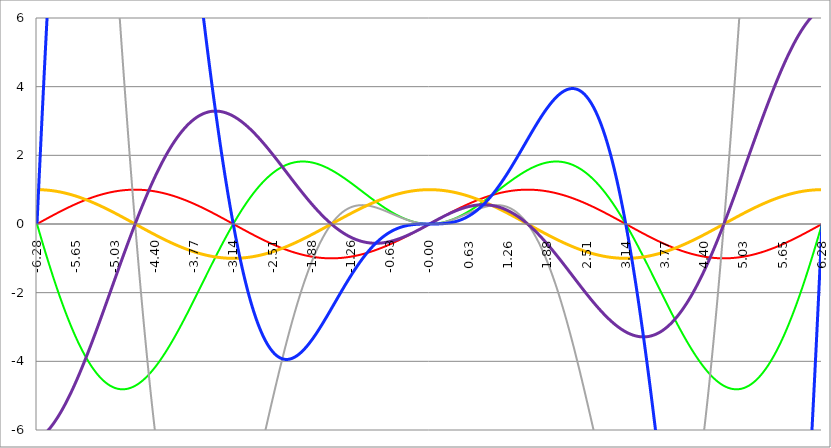
| Category | Series 1 | Series 0 | Series 2 | Series 3 | Series 4 | Series 5 |
|---|---|---|---|---|---|---|
| -6.283185307179586 | 0 | 0 | 39.478 | 1 | -6.283 | 0 |
| -6.276902121872407 | 0.006 | -0.039 | 39.399 | 1 | -6.277 | 0.248 |
| -6.270618936565228 | 0.013 | -0.079 | 39.318 | 1 | -6.27 | 0.494 |
| -6.264335751258049 | 0.019 | -0.118 | 39.235 | 1 | -6.263 | 0.74 |
| -6.25805256595087 | 0.025 | -0.157 | 39.151 | 1 | -6.256 | 0.984 |
| -6.25176938064369 | 0.031 | -0.196 | 39.065 | 1 | -6.249 | 1.228 |
| -6.245486195336511 | 0.038 | -0.235 | 38.978 | 0.999 | -6.241 | 1.47 |
| -6.23920301002933 | 0.044 | -0.274 | 38.89 | 0.999 | -6.233 | 1.712 |
| -6.232919824722153 | 0.05 | -0.313 | 38.8 | 0.999 | -6.225 | 1.952 |
| -6.226636639414973 | 0.057 | -0.352 | 38.709 | 0.998 | -6.217 | 2.191 |
| -6.220353454107794 | 0.063 | -0.391 | 38.616 | 0.998 | -6.208 | 2.43 |
| -6.214070268800615 | 0.069 | -0.429 | 38.522 | 0.998 | -6.199 | 2.667 |
| -6.207787083493435 | 0.075 | -0.468 | 38.427 | 0.997 | -6.19 | 2.903 |
| -6.201503898186257 | 0.082 | -0.506 | 38.33 | 0.997 | -6.181 | 3.138 |
| -6.195220712879077 | 0.088 | -0.544 | 38.232 | 0.996 | -6.171 | 3.372 |
| -6.188937527571898 | 0.094 | -0.582 | 38.133 | 0.996 | -6.161 | 3.605 |
| -6.182654342264719 | 0.1 | -0.621 | 38.032 | 0.995 | -6.151 | 3.836 |
| -6.17637115695754 | 0.107 | -0.658 | 37.93 | 0.994 | -6.141 | 4.067 |
| -6.170087971650361 | 0.113 | -0.696 | 37.827 | 0.994 | -6.131 | 4.296 |
| -6.163804786343182 | 0.119 | -0.734 | 37.722 | 0.993 | -6.12 | 4.525 |
| -6.157521601036002 | 0.125 | -0.772 | 37.616 | 0.992 | -6.109 | 4.752 |
| -6.151238415728823 | 0.132 | -0.809 | 37.509 | 0.991 | -6.098 | 4.978 |
| -6.144955230421644 | 0.138 | -0.847 | 37.4 | 0.99 | -6.086 | 5.203 |
| -6.138672045114464 | 0.144 | -0.884 | 37.29 | 0.99 | -6.075 | 5.427 |
| -6.132388859807286 | 0.15 | -0.921 | 37.179 | 0.989 | -6.063 | 5.649 |
| -6.126105674500106 | 0.156 | -0.958 | 37.067 | 0.988 | -6.051 | 5.871 |
| -6.119822489192927 | 0.163 | -0.995 | 36.954 | 0.987 | -6.038 | 6.091 |
| -6.113539303885748 | 0.169 | -1.032 | 36.839 | 0.986 | -6.026 | 6.31 |
| -6.107256118578569 | 0.175 | -1.069 | 36.723 | 0.985 | -6.013 | 6.528 |
| -6.10097293327139 | 0.181 | -1.106 | 36.606 | 0.983 | -6 | 6.745 |
| -6.09468974796421 | 0.187 | -1.142 | 36.487 | 0.982 | -5.987 | 6.96 |
| -6.088406562657031 | 0.194 | -1.178 | 36.368 | 0.981 | -5.973 | 7.175 |
| -6.082123377349852 | 0.2 | -1.215 | 36.247 | 0.98 | -5.96 | 7.388 |
| -6.075840192042672 | 0.206 | -1.251 | 36.125 | 0.979 | -5.946 | 7.6 |
| -6.069557006735494 | 0.212 | -1.287 | 36.002 | 0.977 | -5.932 | 7.81 |
| -6.063273821428314 | 0.218 | -1.323 | 35.878 | 0.976 | -5.917 | 8.02 |
| -6.056990636121135 | 0.224 | -1.358 | 35.753 | 0.975 | -5.903 | 8.228 |
| -6.050707450813956 | 0.23 | -1.394 | 35.626 | 0.973 | -5.888 | 8.435 |
| -6.044424265506777 | 0.236 | -1.43 | 35.499 | 0.972 | -5.873 | 8.641 |
| -6.038141080199597 | 0.243 | -1.465 | 35.37 | 0.97 | -5.858 | 8.845 |
| -6.031857894892418 | 0.249 | -1.5 | 35.24 | 0.969 | -5.842 | 9.048 |
| -6.025574709585239 | 0.255 | -1.535 | 35.109 | 0.967 | -5.827 | 9.25 |
| -6.01929152427806 | 0.261 | -1.57 | 34.978 | 0.965 | -5.811 | 9.451 |
| -6.013008338970881 | 0.267 | -1.605 | 34.845 | 0.964 | -5.795 | 9.65 |
| -6.006725153663701 | 0.273 | -1.64 | 34.711 | 0.962 | -5.779 | 9.848 |
| -6.000441968356522 | 0.279 | -1.674 | 34.576 | 0.96 | -5.762 | 10.045 |
| -5.994158783049343 | 0.285 | -1.708 | 34.44 | 0.959 | -5.746 | 10.241 |
| -5.987875597742164 | 0.291 | -1.743 | 34.303 | 0.957 | -5.729 | 10.435 |
| -5.981592412434984 | 0.297 | -1.777 | 34.165 | 0.955 | -5.712 | 10.628 |
| -5.975309227127805 | 0.303 | -1.811 | 34.025 | 0.953 | -5.694 | 10.82 |
| -5.969026041820626 | 0.309 | -1.845 | 33.885 | 0.951 | -5.677 | 11.01 |
| -5.962742856513447 | 0.315 | -1.878 | 33.744 | 0.949 | -5.659 | 11.199 |
| -5.956459671206268 | 0.321 | -1.912 | 33.602 | 0.947 | -5.641 | 11.387 |
| -5.950176485899088 | 0.327 | -1.945 | 33.46 | 0.945 | -5.623 | 11.573 |
| -5.94389330059191 | 0.333 | -1.978 | 33.316 | 0.943 | -5.605 | 11.758 |
| -5.93761011528473 | 0.339 | -2.011 | 33.171 | 0.941 | -5.587 | 11.942 |
| -5.931326929977551 | 0.345 | -2.044 | 33.025 | 0.939 | -5.568 | 12.125 |
| -5.925043744670372 | 0.351 | -2.077 | 32.879 | 0.937 | -5.549 | 12.306 |
| -5.918760559363193 | 0.356 | -2.11 | 32.731 | 0.934 | -5.53 | 12.486 |
| -5.912477374056014 | 0.362 | -2.142 | 32.583 | 0.932 | -5.511 | 12.664 |
| -5.906194188748834 | 0.368 | -2.174 | 32.434 | 0.93 | -5.491 | 12.841 |
| -5.899911003441655 | 0.374 | -2.206 | 32.283 | 0.927 | -5.472 | 13.017 |
| -5.893627818134476 | 0.38 | -2.238 | 32.132 | 0.925 | -5.452 | 13.192 |
| -5.887344632827297 | 0.386 | -2.27 | 31.981 | 0.923 | -5.432 | 13.365 |
| -5.881061447520117 | 0.391 | -2.302 | 31.828 | 0.92 | -5.412 | 13.536 |
| -5.874778262212938 | 0.397 | -2.333 | 31.674 | 0.918 | -5.392 | 13.707 |
| -5.868495076905759 | 0.403 | -2.364 | 31.52 | 0.915 | -5.371 | 13.876 |
| -5.86221189159858 | 0.409 | -2.396 | 31.365 | 0.913 | -5.35 | 14.043 |
| -5.855928706291401 | 0.414 | -2.427 | 31.209 | 0.91 | -5.33 | 14.21 |
| -5.849645520984221 | 0.42 | -2.457 | 31.053 | 0.907 | -5.308 | 14.375 |
| -5.843362335677042 | 0.426 | -2.488 | 30.895 | 0.905 | -5.287 | 14.538 |
| -5.837079150369863 | 0.431 | -2.518 | 30.737 | 0.902 | -5.266 | 14.7 |
| -5.830795965062684 | 0.437 | -2.549 | 30.578 | 0.899 | -5.244 | 14.861 |
| -5.824512779755505 | 0.443 | -2.579 | 30.419 | 0.897 | -5.222 | 15.021 |
| -5.818229594448325 | 0.448 | -2.609 | 30.258 | 0.894 | -5.201 | 15.179 |
| -5.811946409141146 | 0.454 | -2.639 | 30.097 | 0.891 | -5.178 | 15.335 |
| -5.805663223833967 | 0.46 | -2.668 | 29.935 | 0.888 | -5.156 | 15.49 |
| -5.799380038526788 | 0.465 | -2.698 | 29.773 | 0.885 | -5.134 | 15.644 |
| -5.793096853219609 | 0.471 | -2.727 | 29.61 | 0.882 | -5.111 | 15.797 |
| -5.78681366791243 | 0.476 | -2.756 | 29.446 | 0.879 | -5.088 | 15.948 |
| -5.780530482605251 | 0.482 | -2.785 | 29.281 | 0.876 | -5.066 | 16.098 |
| -5.774247297298071 | 0.487 | -2.814 | 29.116 | 0.873 | -5.042 | 16.246 |
| -5.767964111990892 | 0.493 | -2.842 | 28.951 | 0.87 | -5.019 | 16.393 |
| -5.761680926683713 | 0.498 | -2.87 | 28.784 | 0.867 | -4.996 | 16.538 |
| -5.755397741376534 | 0.504 | -2.899 | 28.617 | 0.864 | -4.972 | 16.682 |
| -5.749114556069355 | 0.509 | -2.927 | 28.45 | 0.861 | -4.949 | 16.825 |
| -5.742831370762175 | 0.514 | -2.954 | 28.281 | 0.858 | -4.925 | 16.966 |
| -5.736548185454996 | 0.52 | -2.982 | 28.113 | 0.854 | -4.901 | 17.106 |
| -5.730265000147816 | 0.525 | -3.009 | 27.943 | 0.851 | -4.876 | 17.245 |
| -5.723981814840638 | 0.531 | -3.037 | 27.773 | 0.848 | -4.852 | 17.382 |
| -5.717698629533459 | 0.536 | -3.064 | 27.603 | 0.844 | -4.828 | 17.517 |
| -5.711415444226279 | 0.541 | -3.091 | 27.432 | 0.841 | -4.803 | 17.652 |
| -5.7051322589191 | 0.546 | -3.117 | 27.26 | 0.838 | -4.778 | 17.784 |
| -5.698849073611921 | 0.552 | -3.144 | 27.088 | 0.834 | -4.753 | 17.916 |
| -5.692565888304742 | 0.557 | -3.17 | 26.916 | 0.831 | -4.728 | 18.046 |
| -5.686282702997562 | 0.562 | -3.196 | 26.743 | 0.827 | -4.703 | 18.174 |
| -5.679999517690383 | 0.567 | -3.222 | 26.569 | 0.824 | -4.678 | 18.301 |
| -5.673716332383204 | 0.572 | -3.248 | 26.395 | 0.82 | -4.652 | 18.427 |
| -5.667433147076025 | 0.578 | -3.273 | 26.221 | 0.816 | -4.627 | 18.552 |
| -5.661149961768846 | 0.583 | -3.299 | 26.046 | 0.813 | -4.601 | 18.674 |
| -5.654866776461667 | 0.588 | -3.324 | 25.87 | 0.809 | -4.575 | 18.796 |
| -5.648583591154487 | 0.593 | -3.349 | 25.695 | 0.805 | -4.549 | 18.916 |
| -5.642300405847308 | 0.598 | -3.374 | 25.518 | 0.802 | -4.523 | 19.035 |
| -5.63601722054013 | 0.603 | -3.398 | 25.342 | 0.798 | -4.496 | 19.152 |
| -5.62973403523295 | 0.608 | -3.422 | 25.165 | 0.794 | -4.47 | 19.268 |
| -5.623450849925771 | 0.613 | -3.447 | 24.987 | 0.79 | -4.443 | 19.382 |
| -5.617167664618591 | 0.618 | -3.471 | 24.809 | 0.786 | -4.417 | 19.495 |
| -5.610884479311412 | 0.623 | -3.494 | 24.631 | 0.782 | -4.39 | 19.607 |
| -5.604601294004233 | 0.628 | -3.518 | 24.453 | 0.778 | -4.363 | 19.717 |
| -5.598318108697054 | 0.633 | -3.541 | 24.274 | 0.775 | -4.336 | 19.825 |
| -5.592034923389875 | 0.637 | -3.564 | 24.095 | 0.771 | -4.309 | 19.933 |
| -5.585751738082695 | 0.642 | -3.587 | 23.915 | 0.766 | -4.281 | 20.039 |
| -5.579468552775516 | 0.647 | -3.61 | 23.735 | 0.762 | -4.254 | 20.143 |
| -5.573185367468337 | 0.652 | -3.633 | 23.555 | 0.758 | -4.226 | 20.246 |
| -5.566902182161157 | 0.657 | -3.655 | 23.375 | 0.754 | -4.199 | 20.348 |
| -5.560618996853979 | 0.661 | -3.677 | 23.194 | 0.75 | -4.171 | 20.448 |
| -5.5543358115468 | 0.666 | -3.699 | 23.013 | 0.746 | -4.143 | 20.547 |
| -5.54805262623962 | 0.671 | -3.721 | 22.831 | 0.742 | -4.115 | 20.644 |
| -5.54176944093244 | 0.675 | -3.743 | 22.65 | 0.738 | -4.087 | 20.74 |
| -5.535486255625262 | 0.68 | -3.764 | 22.468 | 0.733 | -4.059 | 20.835 |
| -5.529203070318083 | 0.685 | -3.785 | 22.286 | 0.729 | -4.031 | 20.928 |
| -5.522919885010904 | 0.689 | -3.806 | 22.104 | 0.725 | -4.002 | 21.02 |
| -5.516636699703724 | 0.694 | -3.827 | 21.921 | 0.72 | -3.974 | 21.11 |
| -5.510353514396545 | 0.698 | -3.847 | 21.739 | 0.716 | -3.945 | 21.199 |
| -5.504070329089366 | 0.703 | -3.867 | 21.556 | 0.712 | -3.916 | 21.287 |
| -5.497787143782186 | 0.707 | -3.888 | 21.373 | 0.707 | -3.888 | 21.373 |
| -5.491503958475008 | 0.712 | -3.907 | 21.19 | 0.703 | -3.859 | 21.458 |
| -5.485220773167828 | 0.716 | -3.927 | 21.006 | 0.698 | -3.83 | 21.541 |
| -5.47893758786065 | 0.72 | -3.947 | 20.823 | 0.694 | -3.8 | 21.623 |
| -5.47265440255347 | 0.725 | -3.966 | 20.639 | 0.689 | -3.771 | 21.703 |
| -5.466371217246291 | 0.729 | -3.985 | 20.455 | 0.685 | -3.742 | 21.782 |
| -5.460088031939112 | 0.733 | -4.004 | 20.271 | 0.68 | -3.713 | 21.86 |
| -5.453804846631932 | 0.738 | -4.022 | 20.087 | 0.675 | -3.683 | 21.937 |
| -5.447521661324753 | 0.742 | -4.041 | 19.903 | 0.671 | -3.654 | 22.012 |
| -5.441238476017574 | 0.746 | -4.059 | 19.719 | 0.666 | -3.624 | 22.085 |
| -5.434955290710395 | 0.75 | -4.077 | 19.534 | 0.661 | -3.594 | 22.157 |
| -5.428672105403215 | 0.754 | -4.095 | 19.35 | 0.657 | -3.564 | 22.228 |
| -5.422388920096036 | 0.758 | -4.112 | 19.165 | 0.652 | -3.534 | 22.298 |
| -5.416105734788857 | 0.762 | -4.129 | 18.981 | 0.647 | -3.505 | 22.366 |
| -5.409822549481678 | 0.766 | -4.147 | 18.796 | 0.642 | -3.474 | 22.432 |
| -5.403539364174499 | 0.771 | -4.163 | 18.612 | 0.637 | -3.444 | 22.498 |
| -5.39725617886732 | 0.775 | -4.18 | 18.427 | 0.633 | -3.414 | 22.562 |
| -5.39097299356014 | 0.778 | -4.197 | 18.242 | 0.628 | -3.384 | 22.624 |
| -5.384689808252961 | 0.782 | -4.213 | 18.058 | 0.623 | -3.354 | 22.685 |
| -5.378406622945782 | 0.786 | -4.229 | 17.873 | 0.618 | -3.323 | 22.745 |
| -5.372123437638603 | 0.79 | -4.245 | 17.688 | 0.613 | -3.293 | 22.804 |
| -5.365840252331424 | 0.794 | -4.26 | 17.504 | 0.608 | -3.262 | 22.861 |
| -5.359557067024244 | 0.798 | -4.276 | 17.319 | 0.603 | -3.231 | 22.917 |
| -5.353273881717065 | 0.802 | -4.291 | 17.134 | 0.598 | -3.201 | 22.971 |
| -5.346990696409886 | 0.805 | -4.306 | 16.95 | 0.593 | -3.17 | 23.024 |
| -5.340707511102707 | 0.809 | -4.321 | 16.765 | 0.588 | -3.139 | 23.076 |
| -5.334424325795528 | 0.813 | -4.335 | 16.581 | 0.583 | -3.108 | 23.126 |
| -5.328141140488348 | 0.816 | -4.35 | 16.397 | 0.578 | -3.077 | 23.175 |
| -5.32185795518117 | 0.82 | -4.364 | 16.213 | 0.572 | -3.046 | 23.223 |
| -5.31557476987399 | 0.824 | -4.378 | 16.028 | 0.567 | -3.015 | 23.269 |
| -5.30929158456681 | 0.827 | -4.391 | 15.844 | 0.562 | -2.984 | 23.314 |
| -5.303008399259631 | 0.831 | -4.405 | 15.66 | 0.557 | -2.953 | 23.358 |
| -5.296725213952453 | 0.834 | -4.418 | 15.477 | 0.552 | -2.922 | 23.4 |
| -5.290442028645273 | 0.838 | -4.431 | 15.293 | 0.546 | -2.891 | 23.441 |
| -5.284158843338094 | 0.841 | -4.444 | 15.109 | 0.541 | -2.859 | 23.481 |
| -5.277875658030915 | 0.844 | -4.456 | 14.926 | 0.536 | -2.828 | 23.52 |
| -5.271592472723735 | 0.848 | -4.469 | 14.743 | 0.531 | -2.797 | 23.557 |
| -5.265309287416557 | 0.851 | -4.481 | 14.56 | 0.525 | -2.765 | 23.593 |
| -5.259026102109377 | 0.854 | -4.493 | 14.377 | 0.52 | -2.734 | 23.627 |
| -5.252742916802198 | 0.858 | -4.504 | 14.194 | 0.514 | -2.702 | 23.66 |
| -5.246459731495019 | 0.861 | -4.516 | 14.012 | 0.509 | -2.671 | 23.692 |
| -5.24017654618784 | 0.864 | -4.527 | 13.829 | 0.504 | -2.639 | 23.723 |
| -5.23389336088066 | 0.867 | -4.538 | 13.647 | 0.498 | -2.607 | 23.752 |
| -5.227610175573481 | 0.87 | -4.549 | 13.465 | 0.493 | -2.576 | 23.78 |
| -5.221326990266302 | 0.873 | -4.56 | 13.284 | 0.487 | -2.544 | 23.807 |
| -5.215043804959122 | 0.876 | -4.57 | 13.102 | 0.482 | -2.512 | 23.833 |
| -5.208760619651944 | 0.879 | -4.58 | 12.921 | 0.476 | -2.481 | 23.857 |
| -5.202477434344764 | 0.882 | -4.59 | 12.74 | 0.471 | -2.449 | 23.88 |
| -5.196194249037585 | 0.885 | -4.6 | 12.559 | 0.465 | -2.417 | 23.902 |
| -5.189911063730406 | 0.888 | -4.609 | 12.379 | 0.46 | -2.385 | 23.922 |
| -5.183627878423227 | 0.891 | -4.619 | 12.199 | 0.454 | -2.353 | 23.941 |
| -5.177344693116048 | 0.894 | -4.628 | 12.019 | 0.448 | -2.321 | 23.959 |
| -5.171061507808868 | 0.897 | -4.637 | 11.839 | 0.443 | -2.29 | 23.976 |
| -5.164778322501689 | 0.899 | -4.645 | 11.66 | 0.437 | -2.258 | 23.992 |
| -5.15849513719451 | 0.902 | -4.654 | 11.481 | 0.431 | -2.226 | 24.006 |
| -5.152211951887331 | 0.905 | -4.662 | 11.302 | 0.426 | -2.194 | 24.019 |
| -5.145928766580152 | 0.907 | -4.67 | 11.124 | 0.42 | -2.162 | 24.031 |
| -5.139645581272972 | 0.91 | -4.678 | 10.946 | 0.414 | -2.13 | 24.041 |
| -5.133362395965793 | 0.913 | -4.685 | 10.768 | 0.409 | -2.098 | 24.051 |
| -5.127079210658614 | 0.915 | -4.693 | 10.591 | 0.403 | -2.066 | 24.059 |
| -5.120796025351435 | 0.918 | -4.7 | 10.414 | 0.397 | -2.034 | 24.066 |
| -5.114512840044256 | 0.92 | -4.707 | 10.238 | 0.391 | -2.002 | 24.072 |
| -5.108229654737076 | 0.923 | -4.713 | 10.061 | 0.386 | -1.97 | 24.076 |
| -5.101946469429897 | 0.925 | -4.72 | 9.886 | 0.38 | -1.938 | 24.08 |
| -5.095663284122718 | 0.927 | -4.726 | 9.71 | 0.374 | -1.906 | 24.082 |
| -5.08938009881554 | 0.93 | -4.732 | 9.535 | 0.368 | -1.874 | 24.083 |
| -5.08309691350836 | 0.932 | -4.738 | 9.36 | 0.362 | -1.841 | 24.083 |
| -5.07681372820118 | 0.934 | -4.743 | 9.186 | 0.356 | -1.809 | 24.081 |
| -5.070530542894002 | 0.937 | -4.749 | 9.012 | 0.351 | -1.777 | 24.079 |
| -5.064247357586822 | 0.939 | -4.754 | 8.839 | 0.345 | -1.745 | 24.075 |
| -5.057964172279643 | 0.941 | -4.759 | 8.666 | 0.339 | -1.713 | 24.071 |
| -5.051680986972464 | 0.943 | -4.764 | 8.493 | 0.333 | -1.681 | 24.065 |
| -5.045397801665285 | 0.945 | -4.768 | 8.321 | 0.327 | -1.649 | 24.058 |
| -5.039114616358106 | 0.947 | -4.773 | 8.15 | 0.321 | -1.617 | 24.049 |
| -5.032831431050926 | 0.949 | -4.777 | 7.978 | 0.315 | -1.585 | 24.04 |
| -5.026548245743747 | 0.951 | -4.781 | 7.808 | 0.309 | -1.553 | 24.03 |
| -5.020265060436568 | 0.953 | -4.784 | 7.637 | 0.303 | -1.521 | 24.018 |
| -5.013981875129389 | 0.955 | -4.788 | 7.468 | 0.297 | -1.489 | 24.005 |
| -5.00769868982221 | 0.957 | -4.791 | 7.298 | 0.291 | -1.457 | 23.992 |
| -5.00141550451503 | 0.959 | -4.794 | 7.13 | 0.285 | -1.425 | 23.977 |
| -4.995132319207851 | 0.96 | -4.797 | 6.961 | 0.279 | -1.394 | 23.961 |
| -4.98884913390067 | 0.962 | -4.799 | 6.793 | 0.273 | -1.362 | 23.944 |
| -4.982565948593493 | 0.964 | -4.802 | 6.626 | 0.267 | -1.33 | 23.925 |
| -4.976282763286313 | 0.965 | -4.804 | 6.459 | 0.261 | -1.298 | 23.906 |
| -4.969999577979134 | 0.967 | -4.806 | 6.293 | 0.255 | -1.266 | 23.886 |
| -4.963716392671955 | 0.969 | -4.808 | 6.127 | 0.249 | -1.234 | 23.864 |
| -4.957433207364776 | 0.97 | -4.809 | 5.962 | 0.243 | -1.203 | 23.842 |
| -4.951150022057597 | 0.972 | -4.811 | 5.798 | 0.236 | -1.171 | 23.818 |
| -4.944866836750418 | 0.973 | -4.812 | 5.633 | 0.23 | -1.139 | 23.794 |
| -4.938583651443238 | 0.975 | -4.813 | 5.47 | 0.224 | -1.108 | 23.768 |
| -4.932300466136059 | 0.976 | -4.814 | 5.307 | 0.218 | -1.076 | 23.742 |
| -4.92601728082888 | 0.977 | -4.814 | 5.144 | 0.212 | -1.044 | 23.714 |
| -4.9197340955217 | 0.979 | -4.814 | 4.983 | 0.206 | -1.013 | 23.685 |
| -4.913450910214521 | 0.98 | -4.814 | 4.821 | 0.2 | -0.981 | 23.656 |
| -4.907167724907342 | 0.981 | -4.814 | 4.661 | 0.194 | -0.95 | 23.625 |
| -4.900884539600163 | 0.982 | -4.814 | 4.501 | 0.187 | -0.918 | 23.593 |
| -4.894601354292984 | 0.983 | -4.814 | 4.341 | 0.181 | -0.887 | 23.561 |
| -4.888318168985805 | 0.985 | -4.813 | 4.182 | 0.175 | -0.856 | 23.527 |
| -4.882034983678625 | 0.986 | -4.812 | 4.024 | 0.169 | -0.824 | 23.492 |
| -4.875751798371446 | 0.987 | -4.811 | 3.866 | 0.163 | -0.793 | 23.456 |
| -4.869468613064267 | 0.988 | -4.81 | 3.709 | 0.156 | -0.762 | 23.42 |
| -4.863185427757088 | 0.989 | -4.808 | 3.553 | 0.15 | -0.731 | 23.382 |
| -4.856902242449909 | 0.99 | -4.806 | 3.397 | 0.144 | -0.699 | 23.344 |
| -4.85061905714273 | 0.99 | -4.804 | 3.242 | 0.138 | -0.668 | 23.304 |
| -4.84433587183555 | 0.991 | -4.802 | 3.087 | 0.132 | -0.637 | 23.264 |
| -4.838052686528371 | 0.992 | -4.8 | 2.934 | 0.125 | -0.606 | 23.222 |
| -4.831769501221192 | 0.993 | -4.797 | 2.78 | 0.119 | -0.575 | 23.18 |
| -4.825486315914013 | 0.994 | -4.795 | 2.628 | 0.113 | -0.545 | 23.137 |
| -4.819203130606833 | 0.994 | -4.792 | 2.476 | 0.107 | -0.514 | 23.092 |
| -4.812919945299654 | 0.995 | -4.789 | 2.325 | 0.1 | -0.483 | 23.047 |
| -4.806636759992475 | 0.996 | -4.785 | 2.174 | 0.094 | -0.452 | 23.001 |
| -4.800353574685296 | 0.996 | -4.782 | 2.024 | 0.088 | -0.422 | 22.954 |
| -4.794070389378117 | 0.997 | -4.778 | 1.875 | 0.082 | -0.391 | 22.906 |
| -4.787787204070938 | 0.997 | -4.774 | 1.727 | 0.075 | -0.361 | 22.858 |
| -4.781504018763758 | 0.998 | -4.77 | 1.579 | 0.069 | -0.33 | 22.808 |
| -4.77522083345658 | 0.998 | -4.766 | 1.432 | 0.063 | -0.3 | 22.758 |
| -4.7689376481494 | 0.998 | -4.761 | 1.285 | 0.057 | -0.27 | 22.706 |
| -4.762654462842221 | 0.999 | -4.757 | 1.14 | 0.05 | -0.239 | 22.654 |
| -4.756371277535042 | 0.999 | -4.752 | 0.995 | 0.044 | -0.209 | 22.601 |
| -4.750088092227862 | 0.999 | -4.747 | 0.85 | 0.038 | -0.179 | 22.547 |
| -4.743804906920683 | 1 | -4.741 | 0.707 | 0.031 | -0.149 | 22.493 |
| -4.737521721613504 | 1 | -4.736 | 0.564 | 0.025 | -0.119 | 22.437 |
| -4.731238536306324 | 1 | -4.73 | 0.422 | 0.019 | -0.089 | 22.381 |
| -4.724955350999146 | 1 | -4.725 | 0.281 | 0.013 | -0.059 | 22.323 |
| -4.718672165691966 | 1 | -4.719 | 0.14 | 0.006 | -0.03 | 22.265 |
| -4.712388980384787 | 1 | -4.712 | 0 | 0 | 0 | 22.207 |
| -4.706105795077608 | 1 | -4.706 | -0.139 | -0.006 | 0.03 | 22.147 |
| -4.699822609770429 | 1 | -4.699 | -0.278 | -0.013 | 0.059 | 22.087 |
| -4.69353942446325 | 1 | -4.693 | -0.415 | -0.019 | 0.088 | 22.025 |
| -4.68725623915607 | 1 | -4.686 | -0.552 | -0.025 | 0.118 | 21.963 |
| -4.680973053848891 | 1 | -4.679 | -0.688 | -0.031 | 0.147 | 21.901 |
| -4.674689868541712 | 0.999 | -4.671 | -0.824 | -0.038 | 0.176 | 21.837 |
| -4.668406683234533 | 0.999 | -4.664 | -0.958 | -0.044 | 0.205 | 21.773 |
| -4.662123497927354 | 0.999 | -4.656 | -1.092 | -0.05 | 0.234 | 21.708 |
| -4.655840312620174 | 0.998 | -4.648 | -1.225 | -0.057 | 0.263 | 21.642 |
| -4.649557127312995 | 0.998 | -4.64 | -1.357 | -0.063 | 0.292 | 21.576 |
| -4.643273942005816 | 0.998 | -4.632 | -1.489 | -0.069 | 0.321 | 21.509 |
| -4.636990756698637 | 0.997 | -4.624 | -1.62 | -0.075 | 0.349 | 21.441 |
| -4.630707571391458 | 0.997 | -4.615 | -1.75 | -0.082 | 0.378 | 21.372 |
| -4.624424386084279 | 0.996 | -4.607 | -1.879 | -0.088 | 0.406 | 21.303 |
| -4.618141200777099 | 0.996 | -4.598 | -2.007 | -0.094 | 0.435 | 21.233 |
| -4.61185801546992 | 0.995 | -4.589 | -2.135 | -0.1 | 0.463 | 21.162 |
| -4.605574830162741 | 0.994 | -4.579 | -2.261 | -0.107 | 0.491 | 21.09 |
| -4.599291644855561 | 0.994 | -4.57 | -2.387 | -0.113 | 0.519 | 21.018 |
| -4.593008459548383 | 0.993 | -4.56 | -2.512 | -0.119 | 0.547 | 20.946 |
| -4.586725274241203 | 0.992 | -4.551 | -2.637 | -0.125 | 0.575 | 20.872 |
| -4.580442088934024 | 0.991 | -4.541 | -2.76 | -0.132 | 0.603 | 20.798 |
| -4.574158903626845 | 0.99 | -4.531 | -2.883 | -0.138 | 0.63 | 20.723 |
| -4.567875718319666 | 0.99 | -4.52 | -3.005 | -0.144 | 0.658 | 20.648 |
| -4.561592533012487 | 0.989 | -4.51 | -3.126 | -0.15 | 0.685 | 20.572 |
| -4.555309347705307 | 0.988 | -4.499 | -3.246 | -0.156 | 0.713 | 20.495 |
| -4.549026162398128 | 0.987 | -4.488 | -3.366 | -0.163 | 0.74 | 20.418 |
| -4.542742977090949 | 0.986 | -4.478 | -3.484 | -0.169 | 0.767 | 20.34 |
| -4.53645979178377 | 0.985 | -4.466 | -3.602 | -0.175 | 0.794 | 20.262 |
| -4.530176606476591 | 0.983 | -4.455 | -3.719 | -0.181 | 0.821 | 20.183 |
| -4.523893421169412 | 0.982 | -4.444 | -3.835 | -0.187 | 0.848 | 20.103 |
| -4.517610235862232 | 0.981 | -4.432 | -3.95 | -0.194 | 0.874 | 20.023 |
| -4.511327050555053 | 0.98 | -4.42 | -4.065 | -0.2 | 0.901 | 19.942 |
| -4.505043865247874 | 0.979 | -4.409 | -4.178 | -0.206 | 0.927 | 19.861 |
| -4.498760679940694 | 0.977 | -4.396 | -4.291 | -0.212 | 0.954 | 19.779 |
| -4.492477494633515 | 0.976 | -4.384 | -4.403 | -0.218 | 0.98 | 19.696 |
| -4.486194309326336 | 0.975 | -4.372 | -4.514 | -0.224 | 1.006 | 19.613 |
| -4.479911124019157 | 0.973 | -4.359 | -4.624 | -0.23 | 1.032 | 19.53 |
| -4.473627938711977 | 0.972 | -4.347 | -4.733 | -0.236 | 1.058 | 19.446 |
| -4.467344753404799 | 0.97 | -4.334 | -4.842 | -0.243 | 1.084 | 19.361 |
| -4.46106156809762 | 0.969 | -4.321 | -4.949 | -0.249 | 1.109 | 19.276 |
| -4.45477838279044 | 0.967 | -4.308 | -5.056 | -0.255 | 1.135 | 19.19 |
| -4.44849519748326 | 0.965 | -4.294 | -5.162 | -0.261 | 1.16 | 19.104 |
| -4.442212012176082 | 0.964 | -4.281 | -5.267 | -0.267 | 1.186 | 19.017 |
| -4.435928826868903 | 0.962 | -4.267 | -5.371 | -0.273 | 1.211 | 18.93 |
| -4.429645641561723 | 0.96 | -4.254 | -5.474 | -0.279 | 1.236 | 18.843 |
| -4.423362456254544 | 0.959 | -4.24 | -5.577 | -0.285 | 1.261 | 18.755 |
| -4.417079270947365 | 0.957 | -4.226 | -5.678 | -0.291 | 1.286 | 18.666 |
| -4.410796085640185 | 0.955 | -4.212 | -5.779 | -0.297 | 1.31 | 18.577 |
| -4.404512900333007 | 0.953 | -4.197 | -5.879 | -0.303 | 1.335 | 18.488 |
| -4.398229715025827 | 0.951 | -4.183 | -5.978 | -0.309 | 1.359 | 18.398 |
| -4.391946529718648 | 0.949 | -4.168 | -6.076 | -0.315 | 1.383 | 18.307 |
| -4.38566334441147 | 0.947 | -4.154 | -6.173 | -0.321 | 1.408 | 18.217 |
| -4.37938015910429 | 0.945 | -4.139 | -6.269 | -0.327 | 1.432 | 18.125 |
| -4.373096973797111 | 0.943 | -4.124 | -6.365 | -0.333 | 1.455 | 18.034 |
| -4.366813788489932 | 0.941 | -4.109 | -6.459 | -0.339 | 1.479 | 17.942 |
| -4.360530603182752 | 0.939 | -4.093 | -6.553 | -0.345 | 1.503 | 17.849 |
| -4.354247417875573 | 0.937 | -4.078 | -6.646 | -0.351 | 1.526 | 17.756 |
| -4.347964232568394 | 0.934 | -4.062 | -6.738 | -0.356 | 1.55 | 17.663 |
| -4.341681047261215 | 0.932 | -4.047 | -6.829 | -0.362 | 1.573 | 17.57 |
| -4.335397861954035 | 0.93 | -4.031 | -6.919 | -0.368 | 1.596 | 17.476 |
| -4.329114676646856 | 0.927 | -4.015 | -7.008 | -0.374 | 1.619 | 17.381 |
| -4.322831491339677 | 0.925 | -3.999 | -7.097 | -0.38 | 1.642 | 17.287 |
| -4.316548306032498 | 0.923 | -3.983 | -7.184 | -0.386 | 1.664 | 17.192 |
| -4.310265120725319 | 0.92 | -3.966 | -7.271 | -0.391 | 1.687 | 17.096 |
| -4.30398193541814 | 0.918 | -3.95 | -7.357 | -0.397 | 1.709 | 17.001 |
| -4.29769875011096 | 0.915 | -3.933 | -7.442 | -0.403 | 1.732 | 16.905 |
| -4.291415564803781 | 0.913 | -3.917 | -7.526 | -0.409 | 1.754 | 16.808 |
| -4.285132379496602 | 0.91 | -3.9 | -7.609 | -0.414 | 1.776 | 16.712 |
| -4.278849194189422 | 0.907 | -3.883 | -7.691 | -0.42 | 1.797 | 16.615 |
| -4.272566008882244 | 0.905 | -3.866 | -7.773 | -0.426 | 1.819 | 16.517 |
| -4.266282823575064 | 0.902 | -3.849 | -7.853 | -0.431 | 1.841 | 16.42 |
| -4.259999638267885 | 0.899 | -3.831 | -7.933 | -0.437 | 1.862 | 16.322 |
| -4.253716452960706 | 0.897 | -3.814 | -8.011 | -0.443 | 1.883 | 16.224 |
| -4.247433267653527 | 0.894 | -3.797 | -8.089 | -0.448 | 1.904 | 16.126 |
| -4.241150082346347 | 0.891 | -3.779 | -8.166 | -0.454 | 1.925 | 16.027 |
| -4.234866897039168 | 0.888 | -3.761 | -8.242 | -0.46 | 1.946 | 15.928 |
| -4.228583711731989 | 0.885 | -3.743 | -8.317 | -0.465 | 1.967 | 15.829 |
| -4.22230052642481 | 0.882 | -3.725 | -8.392 | -0.471 | 1.987 | 15.729 |
| -4.216017341117631 | 0.879 | -3.707 | -8.465 | -0.476 | 2.008 | 15.63 |
| -4.209734155810452 | 0.876 | -3.689 | -8.538 | -0.482 | 2.028 | 15.53 |
| -4.203450970503273 | 0.873 | -3.671 | -8.609 | -0.487 | 2.048 | 15.43 |
| -4.197167785196093 | 0.87 | -3.652 | -8.68 | -0.493 | 2.068 | 15.329 |
| -4.190884599888914 | 0.867 | -3.634 | -8.75 | -0.498 | 2.088 | 15.229 |
| -4.184601414581734 | 0.864 | -3.615 | -8.819 | -0.504 | 2.107 | 15.128 |
| -4.178318229274556 | 0.861 | -3.596 | -8.887 | -0.509 | 2.127 | 15.027 |
| -4.172035043967377 | 0.858 | -3.578 | -8.954 | -0.514 | 2.146 | 14.926 |
| -4.165751858660197 | 0.854 | -3.559 | -9.021 | -0.52 | 2.165 | 14.825 |
| -4.159468673353018 | 0.851 | -3.54 | -9.086 | -0.525 | 2.184 | 14.723 |
| -4.153185488045839 | 0.848 | -3.521 | -9.151 | -0.531 | 2.203 | 14.622 |
| -4.14690230273866 | 0.844 | -3.501 | -9.215 | -0.536 | 2.222 | 14.52 |
| -4.140619117431481 | 0.841 | -3.482 | -9.277 | -0.541 | 2.241 | 14.418 |
| -4.134335932124301 | 0.838 | -3.463 | -9.339 | -0.546 | 2.259 | 14.316 |
| -4.128052746817122 | 0.834 | -3.443 | -9.4 | -0.552 | 2.277 | 14.213 |
| -4.121769561509943 | 0.831 | -3.424 | -9.461 | -0.557 | 2.295 | 14.111 |
| -4.115486376202764 | 0.827 | -3.404 | -9.52 | -0.562 | 2.313 | 14.008 |
| -4.109203190895584 | 0.824 | -3.384 | -9.579 | -0.567 | 2.331 | 13.906 |
| -4.102920005588405 | 0.82 | -3.364 | -9.636 | -0.572 | 2.349 | 13.803 |
| -4.096636820281226 | 0.816 | -3.344 | -9.693 | -0.578 | 2.366 | 13.7 |
| -4.090353634974047 | 0.813 | -3.324 | -9.749 | -0.583 | 2.383 | 13.597 |
| -4.084070449666868 | 0.809 | -3.304 | -9.804 | -0.588 | 2.401 | 13.494 |
| -4.077787264359689 | 0.805 | -3.284 | -9.858 | -0.593 | 2.418 | 13.391 |
| -4.071504079052509 | 0.802 | -3.264 | -9.912 | -0.598 | 2.434 | 13.288 |
| -4.06522089374533 | 0.798 | -3.243 | -9.964 | -0.603 | 2.451 | 13.184 |
| -4.058937708438151 | 0.794 | -3.223 | -10.016 | -0.608 | 2.468 | 13.081 |
| -4.052654523130972 | 0.79 | -3.202 | -10.066 | -0.613 | 2.484 | 12.978 |
| -4.046371337823793 | 0.786 | -3.182 | -10.116 | -0.618 | 2.5 | 12.874 |
| -4.040088152516613 | 0.782 | -3.161 | -10.165 | -0.623 | 2.516 | 12.77 |
| -4.033804967209434 | 0.778 | -3.14 | -10.214 | -0.628 | 2.532 | 12.667 |
| -4.027521781902255 | 0.775 | -3.119 | -10.261 | -0.633 | 2.548 | 12.563 |
| -4.021238596595076 | 0.771 | -3.098 | -10.307 | -0.637 | 2.563 | 12.459 |
| -4.014955411287897 | 0.766 | -3.077 | -10.353 | -0.642 | 2.579 | 12.356 |
| -4.008672225980717 | 0.762 | -3.056 | -10.398 | -0.647 | 2.594 | 12.252 |
| -4.002389040673538 | 0.758 | -3.035 | -10.442 | -0.652 | 2.609 | 12.148 |
| -3.996105855366359 | 0.754 | -3.014 | -10.485 | -0.657 | 2.624 | 12.045 |
| -3.989822670059179 | 0.75 | -2.993 | -10.527 | -0.661 | 2.639 | 11.941 |
| -3.983539484752 | 0.746 | -2.971 | -10.569 | -0.666 | 2.653 | 11.837 |
| -3.97725629944482 | 0.742 | -2.95 | -10.609 | -0.671 | 2.667 | 11.733 |
| -3.97097311413764 | 0.738 | -2.929 | -10.649 | -0.675 | 2.682 | 11.63 |
| -3.96468992883046 | 0.733 | -2.907 | -10.688 | -0.68 | 2.696 | 11.526 |
| -3.958406743523281 | 0.729 | -2.886 | -10.726 | -0.685 | 2.71 | 11.422 |
| -3.952123558216101 | 0.725 | -2.864 | -10.763 | -0.689 | 2.723 | 11.319 |
| -3.945840372908922 | 0.72 | -2.842 | -10.8 | -0.694 | 2.737 | 11.215 |
| -3.939557187601742 | 0.716 | -2.82 | -10.836 | -0.698 | 2.75 | 11.111 |
| -3.933274002294562 | 0.712 | -2.799 | -10.87 | -0.703 | 2.764 | 11.008 |
| -3.926990816987382 | 0.707 | -2.777 | -10.904 | -0.707 | 2.777 | 10.904 |
| -3.920707631680203 | 0.703 | -2.755 | -10.938 | -0.712 | 2.79 | 10.801 |
| -3.914424446373023 | 0.698 | -2.733 | -10.97 | -0.716 | 2.802 | 10.698 |
| -3.908141261065844 | 0.694 | -2.711 | -11.002 | -0.72 | 2.815 | 10.595 |
| -3.901858075758664 | 0.689 | -2.689 | -11.032 | -0.725 | 2.827 | 10.491 |
| -3.895574890451484 | 0.685 | -2.667 | -11.062 | -0.729 | 2.84 | 10.388 |
| -3.889291705144305 | 0.68 | -2.645 | -11.092 | -0.733 | 2.852 | 10.285 |
| -3.883008519837125 | 0.675 | -2.622 | -11.12 | -0.738 | 2.864 | 10.183 |
| -3.876725334529945 | 0.671 | -2.6 | -11.148 | -0.742 | 2.876 | 10.08 |
| -3.870442149222766 | 0.666 | -2.578 | -11.174 | -0.746 | 2.887 | 9.977 |
| -3.864158963915586 | 0.661 | -2.555 | -11.2 | -0.75 | 2.899 | 9.875 |
| -3.857875778608407 | 0.657 | -2.533 | -11.226 | -0.754 | 2.91 | 9.772 |
| -3.851592593301227 | 0.652 | -2.511 | -11.25 | -0.758 | 2.921 | 9.67 |
| -3.845309407994047 | 0.647 | -2.488 | -11.274 | -0.762 | 2.932 | 9.568 |
| -3.839026222686868 | 0.642 | -2.466 | -11.297 | -0.766 | 2.943 | 9.466 |
| -3.832743037379688 | 0.637 | -2.443 | -11.319 | -0.771 | 2.953 | 9.364 |
| -3.826459852072508 | 0.633 | -2.421 | -11.34 | -0.775 | 2.964 | 9.262 |
| -3.820176666765329 | 0.628 | -2.398 | -11.361 | -0.778 | 2.974 | 9.16 |
| -3.813893481458149 | 0.623 | -2.375 | -11.38 | -0.782 | 2.984 | 9.059 |
| -3.807610296150969 | 0.618 | -2.353 | -11.4 | -0.786 | 2.994 | 8.958 |
| -3.80132711084379 | 0.613 | -2.33 | -11.418 | -0.79 | 3.004 | 8.857 |
| -3.79504392553661 | 0.608 | -2.307 | -11.435 | -0.794 | 3.013 | 8.756 |
| -3.78876074022943 | 0.603 | -2.284 | -11.452 | -0.798 | 3.023 | 8.655 |
| -3.782477554922251 | 0.598 | -2.262 | -11.468 | -0.802 | 3.032 | 8.554 |
| -3.776194369615071 | 0.593 | -2.239 | -11.483 | -0.805 | 3.041 | 8.454 |
| -3.769911184307892 | 0.588 | -2.216 | -11.498 | -0.809 | 3.05 | 8.354 |
| -3.763627999000712 | 0.583 | -2.193 | -11.512 | -0.813 | 3.059 | 8.254 |
| -3.757344813693532 | 0.578 | -2.17 | -11.525 | -0.816 | 3.067 | 8.154 |
| -3.751061628386352 | 0.572 | -2.147 | -11.537 | -0.82 | 3.076 | 8.054 |
| -3.744778443079173 | 0.567 | -2.124 | -11.549 | -0.824 | 3.084 | 7.955 |
| -3.738495257771993 | 0.562 | -2.101 | -11.56 | -0.827 | 3.092 | 7.856 |
| -3.732212072464814 | 0.557 | -2.078 | -11.57 | -0.831 | 3.1 | 7.757 |
| -3.725928887157634 | 0.552 | -2.055 | -11.579 | -0.834 | 3.108 | 7.658 |
| -3.719645701850454 | 0.546 | -2.032 | -11.588 | -0.838 | 3.115 | 7.56 |
| -3.713362516543275 | 0.541 | -2.009 | -11.596 | -0.841 | 3.123 | 7.462 |
| -3.707079331236095 | 0.536 | -1.986 | -11.603 | -0.844 | 3.13 | 7.364 |
| -3.700796145928915 | 0.531 | -1.963 | -11.61 | -0.848 | 3.137 | 7.266 |
| -3.694512960621736 | 0.525 | -1.94 | -11.616 | -0.851 | 3.144 | 7.168 |
| -3.688229775314556 | 0.52 | -1.917 | -11.621 | -0.854 | 3.151 | 7.071 |
| -3.681946590007376 | 0.514 | -1.894 | -11.625 | -0.858 | 3.157 | 6.974 |
| -3.675663404700197 | 0.509 | -1.871 | -11.629 | -0.861 | 3.164 | 6.877 |
| -3.669380219393017 | 0.504 | -1.848 | -11.632 | -0.864 | 3.17 | 6.781 |
| -3.663097034085838 | 0.498 | -1.825 | -11.635 | -0.867 | 3.176 | 6.685 |
| -3.656813848778658 | 0.493 | -1.802 | -11.636 | -0.87 | 3.182 | 6.589 |
| -3.650530663471478 | 0.487 | -1.779 | -11.637 | -0.873 | 3.188 | 6.493 |
| -3.644247478164299 | 0.482 | -1.756 | -11.638 | -0.876 | 3.193 | 6.398 |
| -3.63796429285712 | 0.476 | -1.733 | -11.638 | -0.879 | 3.199 | 6.303 |
| -3.631681107549939 | 0.471 | -1.709 | -11.637 | -0.882 | 3.204 | 6.208 |
| -3.62539792224276 | 0.465 | -1.686 | -11.635 | -0.885 | 3.209 | 6.114 |
| -3.61911473693558 | 0.46 | -1.663 | -11.633 | -0.888 | 3.214 | 6.02 |
| -3.612831551628401 | 0.454 | -1.64 | -11.63 | -0.891 | 3.219 | 5.926 |
| -3.606548366321221 | 0.448 | -1.617 | -11.626 | -0.894 | 3.224 | 5.832 |
| -3.600265181014041 | 0.443 | -1.594 | -11.622 | -0.897 | 3.228 | 5.739 |
| -3.593981995706862 | 0.437 | -1.571 | -11.617 | -0.899 | 3.232 | 5.646 |
| -3.587698810399682 | 0.431 | -1.548 | -11.612 | -0.902 | 3.237 | 5.554 |
| -3.581415625092502 | 0.426 | -1.525 | -11.606 | -0.905 | 3.241 | 5.461 |
| -3.575132439785323 | 0.42 | -1.502 | -11.599 | -0.907 | 3.244 | 5.369 |
| -3.568849254478143 | 0.414 | -1.479 | -11.592 | -0.91 | 3.248 | 5.278 |
| -3.562566069170964 | 0.409 | -1.456 | -11.584 | -0.913 | 3.252 | 5.187 |
| -3.556282883863784 | 0.403 | -1.433 | -11.575 | -0.915 | 3.255 | 5.096 |
| -3.549999698556604 | 0.397 | -1.41 | -11.566 | -0.918 | 3.258 | 5.005 |
| -3.543716513249425 | 0.391 | -1.387 | -11.556 | -0.92 | 3.261 | 4.915 |
| -3.537433327942245 | 0.386 | -1.364 | -11.546 | -0.923 | 3.264 | 4.825 |
| -3.531150142635065 | 0.38 | -1.341 | -11.535 | -0.925 | 3.267 | 4.735 |
| -3.524866957327886 | 0.374 | -1.318 | -11.523 | -0.927 | 3.269 | 4.646 |
| -3.518583772020706 | 0.368 | -1.295 | -11.511 | -0.93 | 3.271 | 4.558 |
| -3.512300586713526 | 0.362 | -1.272 | -11.498 | -0.932 | 3.274 | 4.469 |
| -3.506017401406347 | 0.356 | -1.25 | -11.485 | -0.934 | 3.276 | 4.381 |
| -3.499734216099167 | 0.351 | -1.227 | -11.471 | -0.937 | 3.278 | 4.293 |
| -3.493451030791987 | 0.345 | -1.204 | -11.456 | -0.939 | 3.279 | 4.206 |
| -3.487167845484808 | 0.339 | -1.181 | -11.441 | -0.941 | 3.281 | 4.119 |
| -3.480884660177628 | 0.333 | -1.159 | -11.426 | -0.943 | 3.282 | 4.033 |
| -3.474601474870449 | 0.327 | -1.136 | -11.41 | -0.945 | 3.284 | 3.946 |
| -3.468318289563269 | 0.321 | -1.113 | -11.393 | -0.947 | 3.285 | 3.861 |
| -3.462035104256089 | 0.315 | -1.09 | -11.376 | -0.949 | 3.286 | 3.775 |
| -3.45575191894891 | 0.309 | -1.068 | -11.358 | -0.951 | 3.287 | 3.69 |
| -3.44946873364173 | 0.303 | -1.045 | -11.339 | -0.953 | 3.287 | 3.606 |
| -3.44318554833455 | 0.297 | -1.023 | -11.32 | -0.955 | 3.288 | 3.522 |
| -3.436902363027371 | 0.291 | -1 | -11.301 | -0.957 | 3.288 | 3.438 |
| -3.430619177720191 | 0.285 | -0.978 | -11.281 | -0.959 | 3.288 | 3.354 |
| -3.424335992413011 | 0.279 | -0.955 | -11.26 | -0.96 | 3.288 | 3.271 |
| -3.418052807105832 | 0.273 | -0.933 | -11.239 | -0.962 | 3.288 | 3.189 |
| -3.411769621798652 | 0.267 | -0.911 | -11.218 | -0.964 | 3.288 | 3.107 |
| -3.405486436491473 | 0.261 | -0.888 | -11.196 | -0.965 | 3.288 | 3.025 |
| -3.399203251184293 | 0.255 | -0.866 | -11.173 | -0.967 | 3.287 | 2.944 |
| -3.392920065877113 | 0.249 | -0.844 | -11.15 | -0.969 | 3.286 | 2.863 |
| -3.386636880569934 | 0.243 | -0.822 | -11.127 | -0.97 | 3.285 | 2.782 |
| -3.380353695262754 | 0.236 | -0.799 | -11.103 | -0.972 | 3.284 | 2.702 |
| -3.374070509955574 | 0.23 | -0.777 | -11.078 | -0.973 | 3.283 | 2.623 |
| -3.367787324648395 | 0.224 | -0.755 | -11.053 | -0.975 | 3.282 | 2.544 |
| -3.361504139341215 | 0.218 | -0.733 | -11.028 | -0.976 | 3.281 | 2.465 |
| -3.355220954034035 | 0.212 | -0.711 | -11.002 | -0.977 | 3.279 | 2.387 |
| -3.348937768726855 | 0.206 | -0.689 | -10.975 | -0.979 | 3.277 | 2.309 |
| -3.342654583419676 | 0.2 | -0.668 | -10.948 | -0.98 | 3.275 | 2.231 |
| -3.336371398112496 | 0.194 | -0.646 | -10.921 | -0.981 | 3.273 | 2.154 |
| -3.330088212805317 | 0.187 | -0.624 | -10.893 | -0.982 | 3.271 | 2.078 |
| -3.323805027498137 | 0.181 | -0.602 | -10.865 | -0.983 | 3.269 | 2.002 |
| -3.317521842190957 | 0.175 | -0.581 | -10.836 | -0.985 | 3.266 | 1.926 |
| -3.311238656883778 | 0.169 | -0.559 | -10.807 | -0.986 | 3.264 | 1.851 |
| -3.304955471576598 | 0.163 | -0.538 | -10.777 | -0.987 | 3.261 | 1.776 |
| -3.298672286269419 | 0.156 | -0.516 | -10.747 | -0.988 | 3.258 | 1.702 |
| -3.292389100962239 | 0.15 | -0.495 | -10.717 | -0.989 | 3.255 | 1.628 |
| -3.286105915655059 | 0.144 | -0.473 | -10.686 | -0.99 | 3.252 | 1.555 |
| -3.27982273034788 | 0.138 | -0.452 | -10.655 | -0.99 | 3.249 | 1.482 |
| -3.2735395450407 | 0.132 | -0.431 | -10.623 | -0.991 | 3.245 | 1.41 |
| -3.26725635973352 | 0.125 | -0.409 | -10.591 | -0.992 | 3.241 | 1.338 |
| -3.260973174426341 | 0.119 | -0.388 | -10.558 | -0.993 | 3.238 | 1.266 |
| -3.254689989119161 | 0.113 | -0.367 | -10.525 | -0.994 | 3.234 | 1.195 |
| -3.248406803811982 | 0.107 | -0.346 | -10.492 | -0.994 | 3.23 | 1.125 |
| -3.242123618504802 | 0.1 | -0.325 | -10.458 | -0.995 | 3.226 | 1.055 |
| -3.235840433197622 | 0.094 | -0.305 | -10.424 | -0.996 | 3.221 | 0.985 |
| -3.229557247890442 | 0.088 | -0.284 | -10.39 | -0.996 | 3.217 | 0.916 |
| -3.223274062583263 | 0.082 | -0.263 | -10.355 | -0.997 | 3.213 | 0.848 |
| -3.216990877276083 | 0.075 | -0.242 | -10.32 | -0.997 | 3.208 | 0.78 |
| -3.210707691968904 | 0.069 | -0.222 | -10.284 | -0.998 | 3.203 | 0.712 |
| -3.204424506661724 | 0.063 | -0.201 | -10.248 | -0.998 | 3.198 | 0.645 |
| -3.198141321354544 | 0.057 | -0.181 | -10.212 | -0.998 | 3.193 | 0.578 |
| -3.191858136047365 | 0.05 | -0.16 | -10.175 | -0.999 | 3.188 | 0.512 |
| -3.185574950740185 | 0.044 | -0.14 | -10.138 | -0.999 | 3.182 | 0.446 |
| -3.179291765433005 | 0.038 | -0.12 | -10.101 | -0.999 | 3.177 | 0.381 |
| -3.173008580125826 | 0.031 | -0.1 | -10.063 | -1 | 3.171 | 0.316 |
| -3.166725394818646 | 0.025 | -0.08 | -10.025 | -1 | 3.166 | 0.252 |
| -3.160442209511467 | 0.019 | -0.06 | -9.987 | -1 | 3.16 | 0.188 |
| -3.154159024204287 | 0.013 | -0.04 | -9.948 | -1 | 3.154 | 0.125 |
| -3.147875838897107 | 0.006 | -0.02 | -9.909 | -1 | 3.148 | 0.062 |
| -3.141592653589928 | 0 | 0 | -9.87 | -1 | 3.142 | 0 |
| -3.135309468282748 | -0.006 | 0.02 | -9.83 | -1 | 3.135 | -0.062 |
| -3.129026282975568 | -0.013 | 0.039 | -9.79 | -1 | 3.129 | -0.123 |
| -3.122743097668389 | -0.019 | 0.059 | -9.75 | -1 | 3.122 | -0.184 |
| -3.116459912361209 | -0.025 | 0.078 | -9.709 | -1 | 3.115 | -0.244 |
| -3.110176727054029 | -0.031 | 0.098 | -9.668 | -1 | 3.109 | -0.304 |
| -3.10389354174685 | -0.038 | 0.117 | -9.627 | -0.999 | 3.102 | -0.363 |
| -3.09761035643967 | -0.044 | 0.136 | -9.586 | -0.999 | 3.095 | -0.422 |
| -3.09132717113249 | -0.05 | 0.155 | -9.544 | -0.999 | 3.087 | -0.48 |
| -3.085043985825311 | -0.057 | 0.174 | -9.502 | -0.998 | 3.08 | -0.538 |
| -3.078760800518131 | -0.063 | 0.193 | -9.46 | -0.998 | 3.073 | -0.595 |
| -3.072477615210952 | -0.069 | 0.212 | -9.418 | -0.998 | 3.065 | -0.652 |
| -3.066194429903772 | -0.075 | 0.231 | -9.375 | -0.997 | 3.057 | -0.708 |
| -3.059911244596592 | -0.082 | 0.25 | -9.332 | -0.997 | 3.05 | -0.764 |
| -3.053628059289413 | -0.088 | 0.268 | -9.289 | -0.996 | 3.042 | -0.819 |
| -3.047344873982233 | -0.094 | 0.287 | -9.245 | -0.996 | 3.034 | -0.874 |
| -3.041061688675053 | -0.1 | 0.305 | -9.201 | -0.995 | 3.026 | -0.928 |
| -3.034778503367874 | -0.107 | 0.324 | -9.157 | -0.994 | 3.017 | -0.982 |
| -3.028495318060694 | -0.113 | 0.342 | -9.113 | -0.994 | 3.009 | -1.035 |
| -3.022212132753515 | -0.119 | 0.36 | -9.069 | -0.993 | 3.001 | -1.088 |
| -3.015928947446335 | -0.125 | 0.378 | -9.024 | -0.992 | 2.992 | -1.14 |
| -3.009645762139155 | -0.132 | 0.396 | -8.979 | -0.991 | 2.983 | -1.192 |
| -3.003362576831975 | -0.138 | 0.414 | -8.934 | -0.99 | 2.975 | -1.243 |
| -2.997079391524796 | -0.144 | 0.432 | -8.889 | -0.99 | 2.966 | -1.294 |
| -2.990796206217616 | -0.15 | 0.449 | -8.843 | -0.989 | 2.957 | -1.344 |
| -2.984513020910436 | -0.156 | 0.467 | -8.798 | -0.988 | 2.948 | -1.393 |
| -2.978229835603257 | -0.163 | 0.484 | -8.752 | -0.987 | 2.939 | -1.443 |
| -2.971946650296077 | -0.169 | 0.502 | -8.706 | -0.986 | 2.929 | -1.491 |
| -2.965663464988898 | -0.175 | 0.519 | -8.659 | -0.985 | 2.92 | -1.539 |
| -2.959380279681718 | -0.181 | 0.536 | -8.613 | -0.983 | 2.91 | -1.587 |
| -2.953097094374538 | -0.187 | 0.553 | -8.566 | -0.982 | 2.901 | -1.634 |
| -2.946813909067359 | -0.194 | 0.57 | -8.52 | -0.981 | 2.891 | -1.681 |
| -2.94053072376018 | -0.2 | 0.587 | -8.473 | -0.98 | 2.881 | -1.727 |
| -2.934247538453 | -0.206 | 0.604 | -8.425 | -0.979 | 2.871 | -1.772 |
| -2.92796435314582 | -0.212 | 0.621 | -8.378 | -0.977 | 2.861 | -1.818 |
| -2.92168116783864 | -0.218 | 0.637 | -8.331 | -0.976 | 2.851 | -1.862 |
| -2.915397982531461 | -0.224 | 0.654 | -8.283 | -0.975 | 2.841 | -1.906 |
| -2.909114797224281 | -0.23 | 0.67 | -8.235 | -0.973 | 2.831 | -1.95 |
| -2.902831611917101 | -0.236 | 0.687 | -8.187 | -0.972 | 2.82 | -1.993 |
| -2.896548426609922 | -0.243 | 0.703 | -8.139 | -0.97 | 2.81 | -2.035 |
| -2.890265241302742 | -0.249 | 0.719 | -8.091 | -0.969 | 2.799 | -2.077 |
| -2.883982055995562 | -0.255 | 0.735 | -8.043 | -0.967 | 2.789 | -2.119 |
| -2.877698870688383 | -0.261 | 0.751 | -7.994 | -0.965 | 2.778 | -2.16 |
| -2.871415685381203 | -0.267 | 0.766 | -7.946 | -0.964 | 2.767 | -2.201 |
| -2.865132500074023 | -0.273 | 0.782 | -7.897 | -0.962 | 2.756 | -2.241 |
| -2.858849314766844 | -0.279 | 0.798 | -7.848 | -0.96 | 2.745 | -2.28 |
| -2.852566129459664 | -0.285 | 0.813 | -7.8 | -0.959 | 2.734 | -2.319 |
| -2.846282944152485 | -0.291 | 0.828 | -7.751 | -0.957 | 2.723 | -2.358 |
| -2.839999758845305 | -0.297 | 0.844 | -7.702 | -0.955 | 2.712 | -2.396 |
| -2.833716573538125 | -0.303 | 0.859 | -7.652 | -0.953 | 2.7 | -2.433 |
| -2.827433388230946 | -0.309 | 0.874 | -7.603 | -0.951 | 2.689 | -2.47 |
| -2.821150202923766 | -0.315 | 0.889 | -7.554 | -0.949 | 2.678 | -2.507 |
| -2.814867017616586 | -0.321 | 0.903 | -7.504 | -0.947 | 2.666 | -2.543 |
| -2.808583832309407 | -0.327 | 0.918 | -7.455 | -0.945 | 2.654 | -2.579 |
| -2.802300647002227 | -0.333 | 0.933 | -7.405 | -0.943 | 2.643 | -2.614 |
| -2.796017461695047 | -0.339 | 0.947 | -7.356 | -0.941 | 2.631 | -2.648 |
| -2.789734276387867 | -0.345 | 0.961 | -7.306 | -0.939 | 2.619 | -2.682 |
| -2.783451091080688 | -0.351 | 0.976 | -7.256 | -0.937 | 2.607 | -2.716 |
| -2.777167905773509 | -0.356 | 0.99 | -7.206 | -0.934 | 2.595 | -2.749 |
| -2.770884720466329 | -0.362 | 1.004 | -7.156 | -0.932 | 2.583 | -2.781 |
| -2.764601535159149 | -0.368 | 1.018 | -7.106 | -0.93 | 2.57 | -2.814 |
| -2.75831834985197 | -0.374 | 1.031 | -7.056 | -0.927 | 2.558 | -2.845 |
| -2.75203516454479 | -0.38 | 1.045 | -7.006 | -0.925 | 2.546 | -2.876 |
| -2.74575197923761 | -0.386 | 1.059 | -6.956 | -0.923 | 2.533 | -2.907 |
| -2.739468793930431 | -0.391 | 1.072 | -6.906 | -0.92 | 2.521 | -2.937 |
| -2.733185608623251 | -0.397 | 1.085 | -6.856 | -0.918 | 2.508 | -2.967 |
| -2.726902423316071 | -0.403 | 1.099 | -6.806 | -0.915 | 2.496 | -2.996 |
| -2.720619238008892 | -0.409 | 1.112 | -6.756 | -0.913 | 2.483 | -3.025 |
| -2.714336052701712 | -0.414 | 1.125 | -6.705 | -0.91 | 2.47 | -3.053 |
| -2.708052867394532 | -0.42 | 1.138 | -6.655 | -0.907 | 2.458 | -3.081 |
| -2.701769682087352 | -0.426 | 1.15 | -6.605 | -0.905 | 2.445 | -3.108 |
| -2.695486496780173 | -0.431 | 1.163 | -6.555 | -0.902 | 2.432 | -3.135 |
| -2.689203311472993 | -0.437 | 1.175 | -6.504 | -0.899 | 2.419 | -3.161 |
| -2.682920126165814 | -0.443 | 1.188 | -6.454 | -0.897 | 2.406 | -3.187 |
| -2.676636940858634 | -0.448 | 1.2 | -6.404 | -0.894 | 2.392 | -3.212 |
| -2.670353755551454 | -0.454 | 1.212 | -6.354 | -0.891 | 2.379 | -3.237 |
| -2.664070570244275 | -0.46 | 1.224 | -6.303 | -0.888 | 2.366 | -3.262 |
| -2.657787384937095 | -0.465 | 1.236 | -6.253 | -0.885 | 2.353 | -3.286 |
| -2.651504199629916 | -0.471 | 1.248 | -6.203 | -0.882 | 2.339 | -3.309 |
| -2.645221014322736 | -0.476 | 1.26 | -6.153 | -0.879 | 2.326 | -3.332 |
| -2.638937829015556 | -0.482 | 1.271 | -6.103 | -0.876 | 2.313 | -3.355 |
| -2.632654643708377 | -0.487 | 1.283 | -6.052 | -0.873 | 2.299 | -3.377 |
| -2.626371458401197 | -0.493 | 1.294 | -6.002 | -0.87 | 2.285 | -3.399 |
| -2.620088273094018 | -0.498 | 1.305 | -5.952 | -0.867 | 2.272 | -3.42 |
| -2.613805087786838 | -0.504 | 1.316 | -5.902 | -0.864 | 2.258 | -3.441 |
| -2.607521902479658 | -0.509 | 1.327 | -5.852 | -0.861 | 2.244 | -3.461 |
| -2.601238717172478 | -0.514 | 1.338 | -5.802 | -0.858 | 2.231 | -3.481 |
| -2.594955531865299 | -0.52 | 1.349 | -5.753 | -0.854 | 2.217 | -3.5 |
| -2.588672346558119 | -0.525 | 1.36 | -5.703 | -0.851 | 2.203 | -3.519 |
| -2.58238916125094 | -0.531 | 1.37 | -5.653 | -0.848 | 2.189 | -3.538 |
| -2.57610597594376 | -0.536 | 1.38 | -5.603 | -0.844 | 2.175 | -3.556 |
| -2.56982279063658 | -0.541 | 1.391 | -5.554 | -0.841 | 2.161 | -3.574 |
| -2.563539605329401 | -0.546 | 1.401 | -5.504 | -0.838 | 2.147 | -3.591 |
| -2.557256420022221 | -0.552 | 1.411 | -5.455 | -0.834 | 2.133 | -3.608 |
| -2.550973234715042 | -0.557 | 1.421 | -5.405 | -0.831 | 2.119 | -3.624 |
| -2.544690049407862 | -0.562 | 1.43 | -5.356 | -0.827 | 2.105 | -3.64 |
| -2.538406864100682 | -0.567 | 1.44 | -5.306 | -0.824 | 2.09 | -3.655 |
| -2.532123678793503 | -0.572 | 1.449 | -5.257 | -0.82 | 2.076 | -3.67 |
| -2.525840493486323 | -0.578 | 1.459 | -5.208 | -0.816 | 2.062 | -3.685 |
| -2.519557308179143 | -0.583 | 1.468 | -5.159 | -0.813 | 2.048 | -3.699 |
| -2.513274122871964 | -0.588 | 1.477 | -5.11 | -0.809 | 2.033 | -3.713 |
| -2.506990937564784 | -0.593 | 1.486 | -5.061 | -0.805 | 2.019 | -3.726 |
| -2.500707752257604 | -0.598 | 1.495 | -5.013 | -0.802 | 2.004 | -3.739 |
| -2.494424566950425 | -0.603 | 1.504 | -4.964 | -0.798 | 1.99 | -3.752 |
| -2.488141381643245 | -0.608 | 1.513 | -4.915 | -0.794 | 1.976 | -3.764 |
| -2.481858196336065 | -0.613 | 1.521 | -4.867 | -0.79 | 1.961 | -3.775 |
| -2.475575011028886 | -0.618 | 1.53 | -4.819 | -0.786 | 1.947 | -3.787 |
| -2.469291825721706 | -0.623 | 1.538 | -4.771 | -0.782 | 1.932 | -3.797 |
| -2.463008640414527 | -0.628 | 1.546 | -4.722 | -0.778 | 1.917 | -3.808 |
| -2.456725455107347 | -0.633 | 1.554 | -4.675 | -0.775 | 1.903 | -3.818 |
| -2.450442269800167 | -0.637 | 1.562 | -4.627 | -0.771 | 1.888 | -3.828 |
| -2.444159084492988 | -0.642 | 1.57 | -4.579 | -0.766 | 1.873 | -3.837 |
| -2.437875899185808 | -0.647 | 1.577 | -4.531 | -0.762 | 1.859 | -3.846 |
| -2.431592713878628 | -0.652 | 1.585 | -4.484 | -0.758 | 1.844 | -3.854 |
| -2.425309528571449 | -0.657 | 1.592 | -4.437 | -0.754 | 1.829 | -3.862 |
| -2.419026343264269 | -0.661 | 1.6 | -4.389 | -0.75 | 1.815 | -3.87 |
| -2.412743157957089 | -0.666 | 1.607 | -4.342 | -0.746 | 1.8 | -3.877 |
| -2.40645997264991 | -0.671 | 1.614 | -4.295 | -0.742 | 1.785 | -3.884 |
| -2.40017678734273 | -0.675 | 1.621 | -4.249 | -0.738 | 1.77 | -3.89 |
| -2.393893602035551 | -0.68 | 1.628 | -4.202 | -0.733 | 1.755 | -3.897 |
| -2.387610416728371 | -0.685 | 1.634 | -4.156 | -0.729 | 1.74 | -3.902 |
| -2.381327231421191 | -0.689 | 1.641 | -4.109 | -0.725 | 1.726 | -3.908 |
| -2.375044046114012 | -0.694 | 1.647 | -4.063 | -0.72 | 1.711 | -3.913 |
| -2.368760860806832 | -0.698 | 1.654 | -4.017 | -0.716 | 1.696 | -3.917 |
| -2.362477675499652 | -0.703 | 1.66 | -3.971 | -0.712 | 1.681 | -3.922 |
| -2.356194490192473 | -0.707 | 1.666 | -3.926 | -0.707 | 1.666 | -3.926 |
| -2.349911304885293 | -0.712 | 1.672 | -3.88 | -0.703 | 1.651 | -3.929 |
| -2.343628119578113 | -0.716 | 1.678 | -3.835 | -0.698 | 1.636 | -3.932 |
| -2.337344934270934 | -0.72 | 1.684 | -3.79 | -0.694 | 1.621 | -3.935 |
| -2.331061748963754 | -0.725 | 1.689 | -3.745 | -0.689 | 1.606 | -3.938 |
| -2.324778563656574 | -0.729 | 1.695 | -3.7 | -0.685 | 1.591 | -3.94 |
| -2.318495378349395 | -0.733 | 1.7 | -3.655 | -0.68 | 1.576 | -3.942 |
| -2.312212193042215 | -0.738 | 1.705 | -3.611 | -0.675 | 1.562 | -3.943 |
| -2.305929007735036 | -0.742 | 1.71 | -3.566 | -0.671 | 1.547 | -3.944 |
| -2.299645822427856 | -0.746 | 1.715 | -3.522 | -0.666 | 1.532 | -3.945 |
| -2.293362637120676 | -0.75 | 1.72 | -3.478 | -0.661 | 1.517 | -3.945 |
| -2.287079451813496 | -0.754 | 1.725 | -3.434 | -0.657 | 1.502 | -3.945 |
| -2.280796266506317 | -0.758 | 1.73 | -3.391 | -0.652 | 1.487 | -3.945 |
| -2.274513081199137 | -0.762 | 1.734 | -3.347 | -0.647 | 1.472 | -3.944 |
| -2.268229895891957 | -0.766 | 1.739 | -3.304 | -0.642 | 1.457 | -3.944 |
| -2.261946710584778 | -0.771 | 1.743 | -3.261 | -0.637 | 1.442 | -3.942 |
| -2.255663525277598 | -0.775 | 1.747 | -3.219 | -0.633 | 1.427 | -3.941 |
| -2.249380339970419 | -0.778 | 1.751 | -3.176 | -0.628 | 1.412 | -3.939 |
| -2.24309715466324 | -0.782 | 1.755 | -3.134 | -0.623 | 1.397 | -3.937 |
| -2.23681396935606 | -0.786 | 1.759 | -3.091 | -0.618 | 1.382 | -3.934 |
| -2.23053078404888 | -0.79 | 1.762 | -3.049 | -0.613 | 1.367 | -3.931 |
| -2.2242475987417 | -0.794 | 1.766 | -3.008 | -0.608 | 1.352 | -3.928 |
| -2.217964413434521 | -0.798 | 1.769 | -2.966 | -0.603 | 1.337 | -3.925 |
| -2.211681228127341 | -0.802 | 1.773 | -2.925 | -0.598 | 1.322 | -3.921 |
| -2.205398042820161 | -0.805 | 1.776 | -2.884 | -0.593 | 1.307 | -3.917 |
| -2.199114857512981 | -0.809 | 1.779 | -2.843 | -0.588 | 1.293 | -3.912 |
| -2.192831672205802 | -0.813 | 1.782 | -2.802 | -0.583 | 1.278 | -3.908 |
| -2.186548486898622 | -0.816 | 1.785 | -2.761 | -0.578 | 1.263 | -3.903 |
| -2.180265301591443 | -0.82 | 1.788 | -2.721 | -0.572 | 1.248 | -3.898 |
| -2.173982116284263 | -0.824 | 1.79 | -2.681 | -0.567 | 1.233 | -3.892 |
| -2.167698930977084 | -0.827 | 1.793 | -2.641 | -0.562 | 1.218 | -3.886 |
| -2.161415745669904 | -0.831 | 1.795 | -2.602 | -0.557 | 1.204 | -3.88 |
| -2.155132560362724 | -0.834 | 1.798 | -2.562 | -0.552 | 1.189 | -3.874 |
| -2.148849375055545 | -0.838 | 1.8 | -2.523 | -0.546 | 1.174 | -3.867 |
| -2.142566189748365 | -0.841 | 1.802 | -2.484 | -0.541 | 1.159 | -3.86 |
| -2.136283004441185 | -0.844 | 1.804 | -2.445 | -0.536 | 1.145 | -3.853 |
| -2.129999819134006 | -0.848 | 1.806 | -2.407 | -0.531 | 1.13 | -3.846 |
| -2.123716633826826 | -0.851 | 1.807 | -2.369 | -0.525 | 1.115 | -3.838 |
| -2.117433448519646 | -0.854 | 1.809 | -2.331 | -0.52 | 1.101 | -3.83 |
| -2.111150263212467 | -0.858 | 1.81 | -2.293 | -0.514 | 1.086 | -3.822 |
| -2.104867077905287 | -0.861 | 1.812 | -2.255 | -0.509 | 1.071 | -3.813 |
| -2.098583892598107 | -0.864 | 1.813 | -2.218 | -0.504 | 1.057 | -3.805 |
| -2.092300707290928 | -0.867 | 1.814 | -2.181 | -0.498 | 1.042 | -3.796 |
| -2.086017521983748 | -0.87 | 1.815 | -2.144 | -0.493 | 1.028 | -3.787 |
| -2.079734336676569 | -0.873 | 1.816 | -2.108 | -0.487 | 1.013 | -3.777 |
| -2.073451151369389 | -0.876 | 1.817 | -2.071 | -0.482 | 0.999 | -3.767 |
| -2.06716796606221 | -0.879 | 1.818 | -2.035 | -0.476 | 0.984 | -3.757 |
| -2.06088478075503 | -0.882 | 1.818 | -1.999 | -0.471 | 0.97 | -3.747 |
| -2.05460159544785 | -0.885 | 1.819 | -1.964 | -0.465 | 0.956 | -3.737 |
| -2.04831841014067 | -0.888 | 1.819 | -1.928 | -0.46 | 0.941 | -3.726 |
| -2.042035224833491 | -0.891 | 1.819 | -1.893 | -0.454 | 0.927 | -3.715 |
| -2.035752039526311 | -0.894 | 1.82 | -1.858 | -0.448 | 0.913 | -3.704 |
| -2.029468854219131 | -0.897 | 1.82 | -1.824 | -0.443 | 0.899 | -3.693 |
| -2.023185668911951 | -0.899 | 1.82 | -1.789 | -0.437 | 0.884 | -3.682 |
| -2.016902483604772 | -0.902 | 1.82 | -1.755 | -0.431 | 0.87 | -3.67 |
| -2.010619298297592 | -0.905 | 1.819 | -1.721 | -0.426 | 0.856 | -3.658 |
| -2.004336112990412 | -0.907 | 1.819 | -1.688 | -0.42 | 0.842 | -3.646 |
| -1.998052927683233 | -0.91 | 1.818 | -1.654 | -0.414 | 0.828 | -3.633 |
| -1.991769742376054 | -0.913 | 1.818 | -1.621 | -0.409 | 0.814 | -3.621 |
| -1.985486557068874 | -0.915 | 1.817 | -1.588 | -0.403 | 0.8 | -3.608 |
| -1.979203371761694 | -0.918 | 1.816 | -1.556 | -0.397 | 0.786 | -3.595 |
| -1.972920186454515 | -0.92 | 1.816 | -1.523 | -0.391 | 0.772 | -3.582 |
| -1.966637001147335 | -0.923 | 1.815 | -1.491 | -0.386 | 0.758 | -3.569 |
| -1.960353815840155 | -0.925 | 1.813 | -1.459 | -0.38 | 0.745 | -3.555 |
| -1.954070630532976 | -0.927 | 1.812 | -1.428 | -0.374 | 0.731 | -3.541 |
| -1.947787445225796 | -0.93 | 1.811 | -1.397 | -0.368 | 0.717 | -3.527 |
| -1.941504259918616 | -0.932 | 1.81 | -1.366 | -0.362 | 0.703 | -3.513 |
| -1.935221074611437 | -0.934 | 1.808 | -1.335 | -0.356 | 0.69 | -3.499 |
| -1.928937889304257 | -0.937 | 1.807 | -1.304 | -0.351 | 0.676 | -3.485 |
| -1.922654703997078 | -0.939 | 1.805 | -1.274 | -0.345 | 0.663 | -3.47 |
| -1.916371518689898 | -0.941 | 1.803 | -1.244 | -0.339 | 0.649 | -3.455 |
| -1.910088333382718 | -0.943 | 1.801 | -1.214 | -0.333 | 0.636 | -3.44 |
| -1.903805148075539 | -0.945 | 1.799 | -1.185 | -0.327 | 0.622 | -3.425 |
| -1.897521962768359 | -0.947 | 1.797 | -1.156 | -0.321 | 0.609 | -3.41 |
| -1.891238777461179 | -0.949 | 1.795 | -1.127 | -0.315 | 0.596 | -3.395 |
| -1.884955592154 | -0.951 | 1.793 | -1.098 | -0.309 | 0.582 | -3.379 |
| -1.87867240684682 | -0.953 | 1.79 | -1.07 | -0.303 | 0.569 | -3.363 |
| -1.87238922153964 | -0.955 | 1.788 | -1.041 | -0.297 | 0.556 | -3.348 |
| -1.866106036232461 | -0.957 | 1.785 | -1.013 | -0.291 | 0.543 | -3.332 |
| -1.859822850925281 | -0.959 | 1.783 | -0.986 | -0.285 | 0.53 | -3.315 |
| -1.853539665618102 | -0.96 | 1.78 | -0.959 | -0.279 | 0.517 | -3.299 |
| -1.847256480310922 | -0.962 | 1.777 | -0.931 | -0.273 | 0.504 | -3.283 |
| -1.840973295003742 | -0.964 | 1.774 | -0.905 | -0.267 | 0.491 | -3.266 |
| -1.834690109696563 | -0.965 | 1.771 | -0.878 | -0.261 | 0.479 | -3.25 |
| -1.828406924389383 | -0.967 | 1.768 | -0.852 | -0.255 | 0.466 | -3.233 |
| -1.822123739082203 | -0.969 | 1.765 | -0.826 | -0.249 | 0.453 | -3.216 |
| -1.815840553775024 | -0.97 | 1.762 | -0.8 | -0.243 | 0.441 | -3.199 |
| -1.809557368467844 | -0.972 | 1.758 | -0.774 | -0.236 | 0.428 | -3.182 |
| -1.803274183160664 | -0.973 | 1.755 | -0.749 | -0.23 | 0.415 | -3.164 |
| -1.796990997853485 | -0.975 | 1.751 | -0.724 | -0.224 | 0.403 | -3.147 |
| -1.790707812546305 | -0.976 | 1.748 | -0.7 | -0.218 | 0.391 | -3.129 |
| -1.784424627239125 | -0.977 | 1.744 | -0.675 | -0.212 | 0.378 | -3.112 |
| -1.778141441931946 | -0.979 | 1.74 | -0.651 | -0.206 | 0.366 | -3.094 |
| -1.771858256624766 | -0.98 | 1.736 | -0.627 | -0.2 | 0.354 | -3.076 |
| -1.765575071317587 | -0.981 | 1.732 | -0.603 | -0.194 | 0.342 | -3.058 |
| -1.759291886010407 | -0.982 | 1.728 | -0.58 | -0.187 | 0.33 | -3.04 |
| -1.753008700703227 | -0.983 | 1.724 | -0.557 | -0.181 | 0.318 | -3.022 |
| -1.746725515396048 | -0.985 | 1.72 | -0.534 | -0.175 | 0.306 | -3.004 |
| -1.740442330088868 | -0.986 | 1.715 | -0.511 | -0.169 | 0.294 | -2.986 |
| -1.734159144781688 | -0.987 | 1.711 | -0.489 | -0.163 | 0.282 | -2.967 |
| -1.727875959474509 | -0.988 | 1.707 | -0.467 | -0.156 | 0.27 | -2.949 |
| -1.72159277416733 | -0.989 | 1.702 | -0.445 | -0.15 | 0.259 | -2.93 |
| -1.715309588860149 | -0.99 | 1.697 | -0.424 | -0.144 | 0.247 | -2.912 |
| -1.70902640355297 | -0.99 | 1.693 | -0.402 | -0.138 | 0.235 | -2.893 |
| -1.70274321824579 | -0.991 | 1.688 | -0.381 | -0.132 | 0.224 | -2.874 |
| -1.69646003293861 | -0.992 | 1.683 | -0.361 | -0.125 | 0.213 | -2.855 |
| -1.690176847631431 | -0.993 | 1.678 | -0.34 | -0.119 | 0.201 | -2.836 |
| -1.683893662324251 | -0.994 | 1.673 | -0.32 | -0.113 | 0.19 | -2.817 |
| -1.677610477017072 | -0.994 | 1.668 | -0.3 | -0.107 | 0.179 | -2.798 |
| -1.671327291709892 | -0.995 | 1.663 | -0.28 | -0.1 | 0.168 | -2.779 |
| -1.665044106402712 | -0.996 | 1.658 | -0.261 | -0.094 | 0.157 | -2.76 |
| -1.658760921095533 | -0.996 | 1.652 | -0.242 | -0.088 | 0.146 | -2.741 |
| -1.652477735788353 | -0.997 | 1.647 | -0.223 | -0.082 | 0.135 | -2.722 |
| -1.646194550481173 | -0.997 | 1.642 | -0.204 | -0.075 | 0.124 | -2.702 |
| -1.639911365173994 | -0.998 | 1.636 | -0.186 | -0.069 | 0.113 | -2.683 |
| -1.633628179866814 | -0.998 | 1.63 | -0.168 | -0.063 | 0.103 | -2.663 |
| -1.627344994559634 | -0.998 | 1.625 | -0.15 | -0.057 | 0.092 | -2.644 |
| -1.621061809252455 | -0.999 | 1.619 | -0.132 | -0.05 | 0.081 | -2.625 |
| -1.614778623945275 | -0.999 | 1.613 | -0.115 | -0.044 | 0.071 | -2.605 |
| -1.608495438638096 | -0.999 | 1.607 | -0.098 | -0.038 | 0.061 | -2.585 |
| -1.602212253330916 | -1 | 1.601 | -0.081 | -0.031 | 0.05 | -2.566 |
| -1.595929068023736 | -1 | 1.595 | -0.064 | -0.025 | 0.04 | -2.546 |
| -1.589645882716557 | -1 | 1.589 | -0.048 | -0.019 | 0.03 | -2.527 |
| -1.583362697409377 | -1 | 1.583 | -0.032 | -0.013 | 0.02 | -2.507 |
| -1.577079512102197 | -1 | 1.577 | -0.016 | -0.006 | 0.01 | -2.487 |
| -1.570796326795018 | -1 | 1.571 | 0 | 0 | 0 | -2.467 |
| -1.564513141487838 | -1 | 1.564 | 0.015 | 0.006 | -0.01 | -2.448 |
| -1.558229956180659 | -1 | 1.558 | 0.031 | 0.013 | -0.02 | -2.428 |
| -1.551946770873479 | -1 | 1.552 | 0.045 | 0.019 | -0.029 | -2.408 |
| -1.545663585566299 | -1 | 1.545 | 0.06 | 0.025 | -0.039 | -2.388 |
| -1.53938040025912 | -1 | 1.539 | 0.074 | 0.031 | -0.048 | -2.369 |
| -1.53309721495194 | -0.999 | 1.532 | 0.089 | 0.038 | -0.058 | -2.349 |
| -1.52681402964476 | -0.999 | 1.525 | 0.102 | 0.044 | -0.067 | -2.329 |
| -1.520530844337581 | -0.999 | 1.519 | 0.116 | 0.05 | -0.076 | -2.309 |
| -1.514247659030401 | -0.998 | 1.512 | 0.13 | 0.057 | -0.086 | -2.289 |
| -1.507964473723221 | -0.998 | 1.505 | 0.143 | 0.063 | -0.095 | -2.269 |
| -1.501681288416042 | -0.998 | 1.498 | 0.156 | 0.069 | -0.104 | -2.25 |
| -1.495398103108862 | -0.997 | 1.491 | 0.168 | 0.075 | -0.113 | -2.23 |
| -1.489114917801682 | -0.997 | 1.484 | 0.181 | 0.082 | -0.121 | -2.21 |
| -1.482831732494503 | -0.996 | 1.477 | 0.193 | 0.088 | -0.13 | -2.19 |
| -1.476548547187323 | -0.996 | 1.47 | 0.205 | 0.094 | -0.139 | -2.171 |
| -1.470265361880144 | -0.995 | 1.463 | 0.217 | 0.1 | -0.148 | -2.151 |
| -1.463982176572964 | -0.994 | 1.456 | 0.228 | 0.107 | -0.156 | -2.131 |
| -1.457698991265784 | -0.994 | 1.448 | 0.24 | 0.113 | -0.165 | -2.111 |
| -1.451415805958605 | -0.993 | 1.441 | 0.251 | 0.119 | -0.173 | -2.092 |
| -1.445132620651425 | -0.992 | 1.434 | 0.262 | 0.125 | -0.181 | -2.072 |
| -1.438849435344245 | -0.991 | 1.426 | 0.272 | 0.132 | -0.189 | -2.052 |
| -1.432566250037066 | -0.99 | 1.419 | 0.283 | 0.138 | -0.197 | -2.033 |
| -1.426283064729886 | -0.99 | 1.411 | 0.293 | 0.144 | -0.205 | -2.013 |
| -1.419999879422706 | -0.989 | 1.404 | 0.303 | 0.15 | -0.213 | -1.994 |
| -1.413716694115527 | -0.988 | 1.396 | 0.313 | 0.156 | -0.221 | -1.974 |
| -1.407433508808347 | -0.987 | 1.389 | 0.322 | 0.163 | -0.229 | -1.954 |
| -1.401150323501168 | -0.986 | 1.381 | 0.331 | 0.169 | -0.237 | -1.935 |
| -1.394867138193988 | -0.985 | 1.373 | 0.341 | 0.175 | -0.244 | -1.916 |
| -1.388583952886808 | -0.983 | 1.366 | 0.349 | 0.181 | -0.252 | -1.896 |
| -1.382300767579629 | -0.982 | 1.358 | 0.358 | 0.187 | -0.259 | -1.877 |
| -1.376017582272449 | -0.981 | 1.35 | 0.366 | 0.194 | -0.266 | -1.858 |
| -1.369734396965269 | -0.98 | 1.342 | 0.375 | 0.2 | -0.274 | -1.838 |
| -1.36345121165809 | -0.979 | 1.334 | 0.383 | 0.206 | -0.281 | -1.819 |
| -1.35716802635091 | -0.977 | 1.326 | 0.39 | 0.212 | -0.288 | -1.8 |
| -1.35088484104373 | -0.976 | 1.318 | 0.398 | 0.218 | -0.295 | -1.781 |
| -1.344601655736551 | -0.975 | 1.31 | 0.405 | 0.224 | -0.302 | -1.762 |
| -1.338318470429371 | -0.973 | 1.302 | 0.413 | 0.23 | -0.308 | -1.743 |
| -1.332035285122191 | -0.972 | 1.294 | 0.42 | 0.236 | -0.315 | -1.724 |
| -1.325752099815012 | -0.97 | 1.286 | 0.426 | 0.243 | -0.322 | -1.705 |
| -1.319468914507832 | -0.969 | 1.278 | 0.433 | 0.249 | -0.328 | -1.686 |
| -1.313185729200653 | -0.967 | 1.27 | 0.439 | 0.255 | -0.335 | -1.668 |
| -1.306902543893473 | -0.965 | 1.262 | 0.446 | 0.261 | -0.341 | -1.649 |
| -1.300619358586293 | -0.964 | 1.253 | 0.451 | 0.267 | -0.347 | -1.63 |
| -1.294336173279114 | -0.962 | 1.245 | 0.457 | 0.273 | -0.353 | -1.612 |
| -1.288052987971934 | -0.96 | 1.237 | 0.463 | 0.279 | -0.359 | -1.593 |
| -1.281769802664754 | -0.959 | 1.229 | 0.468 | 0.285 | -0.365 | -1.575 |
| -1.275486617357575 | -0.957 | 1.22 | 0.473 | 0.291 | -0.371 | -1.556 |
| -1.269203432050395 | -0.955 | 1.212 | 0.478 | 0.297 | -0.377 | -1.538 |
| -1.262920246743215 | -0.953 | 1.204 | 0.483 | 0.303 | -0.383 | -1.52 |
| -1.256637061436036 | -0.951 | 1.195 | 0.488 | 0.309 | -0.388 | -1.502 |
| -1.250353876128856 | -0.949 | 1.187 | 0.492 | 0.315 | -0.394 | -1.484 |
| -1.244070690821677 | -0.947 | 1.178 | 0.497 | 0.321 | -0.399 | -1.466 |
| -1.237787505514497 | -0.945 | 1.17 | 0.501 | 0.327 | -0.405 | -1.448 |
| -1.231504320207317 | -0.943 | 1.161 | 0.505 | 0.333 | -0.41 | -1.43 |
| -1.225221134900138 | -0.941 | 1.153 | 0.509 | 0.339 | -0.415 | -1.412 |
| -1.218937949592958 | -0.939 | 1.144 | 0.512 | 0.345 | -0.42 | -1.395 |
| -1.212654764285778 | -0.937 | 1.136 | 0.515 | 0.351 | -0.425 | -1.377 |
| -1.206371578978599 | -0.934 | 1.127 | 0.519 | 0.356 | -0.43 | -1.36 |
| -1.20008839367142 | -0.932 | 1.119 | 0.522 | 0.362 | -0.435 | -1.342 |
| -1.193805208364239 | -0.93 | 1.11 | 0.525 | 0.368 | -0.439 | -1.325 |
| -1.18752202305706 | -0.927 | 1.101 | 0.527 | 0.374 | -0.444 | -1.308 |
| -1.18123883774988 | -0.925 | 1.093 | 0.53 | 0.38 | -0.449 | -1.291 |
| -1.1749556524427 | -0.923 | 1.084 | 0.532 | 0.386 | -0.453 | -1.274 |
| -1.168672467135521 | -0.92 | 1.075 | 0.535 | 0.391 | -0.457 | -1.257 |
| -1.162389281828341 | -0.918 | 1.067 | 0.537 | 0.397 | -0.462 | -1.24 |
| -1.156106096521162 | -0.915 | 1.058 | 0.539 | 0.403 | -0.466 | -1.223 |
| -1.149822911213982 | -0.913 | 1.049 | 0.54 | 0.409 | -0.47 | -1.207 |
| -1.143539725906802 | -0.91 | 1.041 | 0.542 | 0.414 | -0.474 | -1.19 |
| -1.137256540599623 | -0.907 | 1.032 | 0.543 | 0.42 | -0.478 | -1.174 |
| -1.130973355292443 | -0.905 | 1.023 | 0.545 | 0.426 | -0.482 | -1.157 |
| -1.124690169985263 | -0.902 | 1.015 | 0.546 | 0.431 | -0.485 | -1.141 |
| -1.118406984678084 | -0.899 | 1.006 | 0.547 | 0.437 | -0.489 | -1.125 |
| -1.112123799370904 | -0.897 | 0.997 | 0.548 | 0.443 | -0.492 | -1.109 |
| -1.105840614063724 | -0.894 | 0.988 | 0.548 | 0.448 | -0.496 | -1.093 |
| -1.099557428756545 | -0.891 | 0.98 | 0.549 | 0.454 | -0.499 | -1.077 |
| -1.093274243449365 | -0.888 | 0.971 | 0.549 | 0.46 | -0.502 | -1.062 |
| -1.086991058142186 | -0.885 | 0.962 | 0.55 | 0.465 | -0.506 | -1.046 |
| -1.080707872835006 | -0.882 | 0.953 | 0.55 | 0.471 | -0.509 | -1.03 |
| -1.074424687527826 | -0.879 | 0.945 | 0.55 | 0.476 | -0.512 | -1.015 |
| -1.068141502220647 | -0.876 | 0.936 | 0.55 | 0.482 | -0.515 | -1 |
| -1.061858316913467 | -0.873 | 0.927 | 0.549 | 0.487 | -0.517 | -0.985 |
| -1.055575131606287 | -0.87 | 0.919 | 0.549 | 0.493 | -0.52 | -0.97 |
| -1.049291946299108 | -0.867 | 0.91 | 0.549 | 0.498 | -0.523 | -0.955 |
| -1.043008760991928 | -0.864 | 0.901 | 0.548 | 0.504 | -0.525 | -0.94 |
| -1.036725575684748 | -0.861 | 0.892 | 0.547 | 0.509 | -0.528 | -0.925 |
| -1.030442390377569 | -0.858 | 0.884 | 0.546 | 0.514 | -0.53 | -0.911 |
| -1.024159205070389 | -0.854 | 0.875 | 0.545 | 0.52 | -0.532 | -0.896 |
| -1.01787601976321 | -0.851 | 0.866 | 0.544 | 0.525 | -0.535 | -0.882 |
| -1.01159283445603 | -0.848 | 0.858 | 0.543 | 0.531 | -0.537 | -0.867 |
| -1.00530964914885 | -0.844 | 0.849 | 0.542 | 0.536 | -0.539 | -0.853 |
| -0.999026463841671 | -0.841 | 0.84 | 0.54 | 0.541 | -0.541 | -0.839 |
| -0.992743278534491 | -0.838 | 0.831 | 0.538 | 0.546 | -0.542 | -0.825 |
| -0.986460093227311 | -0.834 | 0.823 | 0.537 | 0.552 | -0.544 | -0.812 |
| -0.980176907920132 | -0.831 | 0.814 | 0.535 | 0.557 | -0.546 | -0.798 |
| -0.973893722612952 | -0.827 | 0.805 | 0.533 | 0.562 | -0.547 | -0.784 |
| -0.967610537305772 | -0.824 | 0.797 | 0.531 | 0.567 | -0.549 | -0.771 |
| -0.961327351998593 | -0.82 | 0.788 | 0.529 | 0.572 | -0.55 | -0.758 |
| -0.955044166691413 | -0.816 | 0.78 | 0.527 | 0.578 | -0.552 | -0.745 |
| -0.948760981384233 | -0.813 | 0.771 | 0.525 | 0.583 | -0.553 | -0.732 |
| -0.942477796077054 | -0.809 | 0.762 | 0.522 | 0.588 | -0.554 | -0.719 |
| -0.936194610769874 | -0.805 | 0.754 | 0.52 | 0.593 | -0.555 | -0.706 |
| -0.929911425462695 | -0.802 | 0.745 | 0.517 | 0.598 | -0.556 | -0.693 |
| -0.923628240155515 | -0.798 | 0.737 | 0.514 | 0.603 | -0.557 | -0.681 |
| -0.917345054848335 | -0.794 | 0.728 | 0.512 | 0.608 | -0.558 | -0.668 |
| -0.911061869541156 | -0.79 | 0.72 | 0.509 | 0.613 | -0.558 | -0.656 |
| -0.904778684233976 | -0.786 | 0.711 | 0.506 | 0.618 | -0.559 | -0.644 |
| -0.898495498926796 | -0.782 | 0.703 | 0.503 | 0.623 | -0.56 | -0.632 |
| -0.892212313619617 | -0.778 | 0.695 | 0.5 | 0.628 | -0.56 | -0.62 |
| -0.885929128312437 | -0.775 | 0.686 | 0.496 | 0.633 | -0.56 | -0.608 |
| -0.879645943005257 | -0.771 | 0.678 | 0.493 | 0.637 | -0.561 | -0.596 |
| -0.873362757698078 | -0.766 | 0.669 | 0.49 | 0.642 | -0.561 | -0.585 |
| -0.867079572390898 | -0.762 | 0.661 | 0.486 | 0.647 | -0.561 | -0.573 |
| -0.860796387083718 | -0.758 | 0.653 | 0.483 | 0.652 | -0.561 | -0.562 |
| -0.854513201776539 | -0.754 | 0.645 | 0.479 | 0.657 | -0.561 | -0.551 |
| -0.848230016469359 | -0.75 | 0.636 | 0.476 | 0.661 | -0.561 | -0.54 |
| -0.84194683116218 | -0.746 | 0.628 | 0.472 | 0.666 | -0.561 | -0.529 |
| -0.835663645855 | -0.742 | 0.62 | 0.468 | 0.671 | -0.56 | -0.518 |
| -0.82938046054782 | -0.738 | 0.612 | 0.465 | 0.675 | -0.56 | -0.507 |
| -0.823097275240641 | -0.733 | 0.604 | 0.461 | 0.68 | -0.56 | -0.497 |
| -0.816814089933461 | -0.729 | 0.595 | 0.457 | 0.685 | -0.559 | -0.486 |
| -0.810530904626281 | -0.725 | 0.587 | 0.453 | 0.689 | -0.559 | -0.476 |
| -0.804247719319102 | -0.72 | 0.579 | 0.449 | 0.694 | -0.558 | -0.466 |
| -0.797964534011922 | -0.716 | 0.571 | 0.445 | 0.698 | -0.557 | -0.456 |
| -0.791681348704742 | -0.712 | 0.563 | 0.44 | 0.703 | -0.556 | -0.446 |
| -0.785398163397563 | -0.707 | 0.555 | 0.436 | 0.707 | -0.555 | -0.436 |
| -0.779114978090383 | -0.703 | 0.547 | 0.432 | 0.712 | -0.554 | -0.427 |
| -0.772831792783204 | -0.698 | 0.54 | 0.428 | 0.716 | -0.553 | -0.417 |
| -0.766548607476024 | -0.694 | 0.532 | 0.423 | 0.72 | -0.552 | -0.408 |
| -0.760265422168844 | -0.689 | 0.524 | 0.419 | 0.725 | -0.551 | -0.398 |
| -0.753982236861665 | -0.685 | 0.516 | 0.414 | 0.729 | -0.55 | -0.389 |
| -0.747699051554485 | -0.68 | 0.508 | 0.41 | 0.733 | -0.548 | -0.38 |
| -0.741415866247305 | -0.675 | 0.501 | 0.405 | 0.738 | -0.547 | -0.371 |
| -0.735132680940126 | -0.671 | 0.493 | 0.401 | 0.742 | -0.545 | -0.362 |
| -0.728849495632946 | -0.666 | 0.485 | 0.396 | 0.746 | -0.544 | -0.354 |
| -0.722566310325766 | -0.661 | 0.478 | 0.392 | 0.75 | -0.542 | -0.345 |
| -0.716283125018587 | -0.657 | 0.47 | 0.387 | 0.754 | -0.54 | -0.337 |
| -0.709999939711407 | -0.652 | 0.463 | 0.382 | 0.758 | -0.538 | -0.329 |
| -0.703716754404227 | -0.647 | 0.455 | 0.378 | 0.762 | -0.537 | -0.32 |
| -0.697433569097048 | -0.642 | 0.448 | 0.373 | 0.766 | -0.535 | -0.312 |
| -0.691150383789868 | -0.637 | 0.441 | 0.368 | 0.771 | -0.533 | -0.304 |
| -0.684867198482689 | -0.633 | 0.433 | 0.363 | 0.775 | -0.53 | -0.297 |
| -0.678584013175509 | -0.628 | 0.426 | 0.358 | 0.778 | -0.528 | -0.289 |
| -0.672300827868329 | -0.623 | 0.419 | 0.354 | 0.782 | -0.526 | -0.281 |
| -0.66601764256115 | -0.618 | 0.412 | 0.349 | 0.786 | -0.524 | -0.274 |
| -0.65973445725397 | -0.613 | 0.404 | 0.344 | 0.79 | -0.521 | -0.267 |
| -0.65345127194679 | -0.608 | 0.397 | 0.339 | 0.794 | -0.519 | -0.26 |
| -0.647168086639611 | -0.603 | 0.39 | 0.334 | 0.798 | -0.516 | -0.253 |
| -0.640884901332431 | -0.598 | 0.383 | 0.329 | 0.802 | -0.514 | -0.246 |
| -0.634601716025251 | -0.593 | 0.376 | 0.324 | 0.805 | -0.511 | -0.239 |
| -0.628318530718072 | -0.588 | 0.369 | 0.319 | 0.809 | -0.508 | -0.232 |
| -0.622035345410892 | -0.583 | 0.362 | 0.314 | 0.813 | -0.506 | -0.225 |
| -0.615752160103712 | -0.578 | 0.356 | 0.31 | 0.816 | -0.503 | -0.219 |
| -0.609468974796533 | -0.572 | 0.349 | 0.305 | 0.82 | -0.5 | -0.213 |
| -0.603185789489353 | -0.567 | 0.342 | 0.3 | 0.824 | -0.497 | -0.206 |
| -0.596902604182174 | -0.562 | 0.336 | 0.295 | 0.827 | -0.494 | -0.2 |
| -0.590619418874994 | -0.557 | 0.329 | 0.29 | 0.831 | -0.491 | -0.194 |
| -0.584336233567814 | -0.552 | 0.322 | 0.285 | 0.834 | -0.487 | -0.188 |
| -0.578053048260635 | -0.546 | 0.316 | 0.28 | 0.838 | -0.484 | -0.183 |
| -0.571769862953455 | -0.541 | 0.309 | 0.275 | 0.841 | -0.481 | -0.177 |
| -0.565486677646275 | -0.536 | 0.303 | 0.27 | 0.844 | -0.477 | -0.171 |
| -0.559203492339096 | -0.531 | 0.297 | 0.265 | 0.848 | -0.474 | -0.166 |
| -0.552920307031916 | -0.525 | 0.29 | 0.26 | 0.851 | -0.471 | -0.161 |
| -0.546637121724737 | -0.52 | 0.284 | 0.255 | 0.854 | -0.467 | -0.155 |
| -0.540353936417557 | -0.514 | 0.278 | 0.25 | 0.858 | -0.463 | -0.15 |
| -0.534070751110377 | -0.509 | 0.272 | 0.246 | 0.861 | -0.46 | -0.145 |
| -0.527787565803198 | -0.504 | 0.266 | 0.241 | 0.864 | -0.456 | -0.14 |
| -0.521504380496018 | -0.498 | 0.26 | 0.236 | 0.867 | -0.452 | -0.135 |
| -0.515221195188838 | -0.493 | 0.254 | 0.231 | 0.87 | -0.448 | -0.131 |
| -0.508938009881659 | -0.487 | 0.248 | 0.226 | 0.873 | -0.444 | -0.126 |
| -0.502654824574479 | -0.482 | 0.242 | 0.221 | 0.876 | -0.44 | -0.122 |
| -0.496371639267299 | -0.476 | 0.236 | 0.217 | 0.879 | -0.436 | -0.117 |
| -0.49008845396012 | -0.471 | 0.231 | 0.212 | 0.882 | -0.432 | -0.113 |
| -0.48380526865294 | -0.465 | 0.225 | 0.207 | 0.885 | -0.428 | -0.109 |
| -0.477522083345761 | -0.46 | 0.219 | 0.203 | 0.888 | -0.424 | -0.105 |
| -0.471238898038581 | -0.454 | 0.214 | 0.198 | 0.891 | -0.42 | -0.101 |
| -0.464955712731402 | -0.448 | 0.208 | 0.193 | 0.894 | -0.416 | -0.097 |
| -0.458672527424222 | -0.443 | 0.203 | 0.189 | 0.897 | -0.411 | -0.093 |
| -0.452389342117042 | -0.437 | 0.198 | 0.184 | 0.899 | -0.407 | -0.089 |
| -0.446106156809863 | -0.431 | 0.192 | 0.18 | 0.902 | -0.402 | -0.086 |
| -0.439822971502683 | -0.426 | 0.187 | 0.175 | 0.905 | -0.398 | -0.082 |
| -0.433539786195504 | -0.42 | 0.182 | 0.171 | 0.907 | -0.393 | -0.079 |
| -0.427256600888324 | -0.414 | 0.177 | 0.166 | 0.91 | -0.389 | -0.076 |
| -0.420973415581144 | -0.409 | 0.172 | 0.162 | 0.913 | -0.384 | -0.072 |
| -0.414690230273965 | -0.403 | 0.167 | 0.157 | 0.915 | -0.38 | -0.069 |
| -0.408407044966785 | -0.397 | 0.162 | 0.153 | 0.918 | -0.375 | -0.066 |
| -0.402123859659606 | -0.391 | 0.157 | 0.149 | 0.92 | -0.37 | -0.063 |
| -0.395840674352426 | -0.386 | 0.153 | 0.145 | 0.923 | -0.365 | -0.06 |
| -0.389557489045247 | -0.38 | 0.148 | 0.14 | 0.925 | -0.36 | -0.058 |
| -0.383274303738067 | -0.374 | 0.143 | 0.136 | 0.927 | -0.355 | -0.055 |
| -0.376991118430887 | -0.368 | 0.139 | 0.132 | 0.93 | -0.351 | -0.052 |
| -0.370707933123708 | -0.362 | 0.134 | 0.128 | 0.932 | -0.346 | -0.05 |
| -0.364424747816528 | -0.356 | 0.13 | 0.124 | 0.934 | -0.34 | -0.047 |
| -0.358141562509349 | -0.351 | 0.126 | 0.12 | 0.937 | -0.335 | -0.045 |
| -0.351858377202169 | -0.345 | 0.121 | 0.116 | 0.939 | -0.33 | -0.043 |
| -0.345575191894989 | -0.339 | 0.117 | 0.112 | 0.941 | -0.325 | -0.04 |
| -0.33929200658781 | -0.333 | 0.113 | 0.109 | 0.943 | -0.32 | -0.038 |
| -0.33300882128063 | -0.327 | 0.109 | 0.105 | 0.945 | -0.315 | -0.036 |
| -0.326725635973451 | -0.321 | 0.105 | 0.101 | 0.947 | -0.309 | -0.034 |
| -0.320442450666271 | -0.315 | 0.101 | 0.097 | 0.949 | -0.304 | -0.032 |
| -0.314159265359092 | -0.309 | 0.097 | 0.094 | 0.951 | -0.299 | -0.03 |
| -0.307876080051912 | -0.303 | 0.093 | 0.09 | 0.953 | -0.293 | -0.029 |
| -0.301592894744732 | -0.297 | 0.09 | 0.087 | 0.955 | -0.288 | -0.027 |
| -0.295309709437553 | -0.291 | 0.086 | 0.083 | 0.957 | -0.283 | -0.025 |
| -0.289026524130373 | -0.285 | 0.082 | 0.08 | 0.959 | -0.277 | -0.024 |
| -0.282743338823194 | -0.279 | 0.079 | 0.077 | 0.96 | -0.272 | -0.022 |
| -0.276460153516014 | -0.273 | 0.075 | 0.074 | 0.962 | -0.266 | -0.021 |
| -0.270176968208834 | -0.267 | 0.072 | 0.07 | 0.964 | -0.26 | -0.019 |
| -0.263893782901655 | -0.261 | 0.069 | 0.067 | 0.965 | -0.255 | -0.018 |
| -0.257610597594475 | -0.255 | 0.066 | 0.064 | 0.967 | -0.249 | -0.017 |
| -0.251327412287296 | -0.249 | 0.063 | 0.061 | 0.969 | -0.243 | -0.016 |
| -0.245044226980116 | -0.243 | 0.059 | 0.058 | 0.97 | -0.238 | -0.015 |
| -0.238761041672937 | -0.236 | 0.056 | 0.055 | 0.972 | -0.232 | -0.013 |
| -0.232477856365757 | -0.23 | 0.054 | 0.053 | 0.973 | -0.226 | -0.012 |
| -0.226194671058577 | -0.224 | 0.051 | 0.05 | 0.975 | -0.22 | -0.011 |
| -0.219911485751398 | -0.218 | 0.048 | 0.047 | 0.976 | -0.215 | -0.011 |
| -0.213628300444218 | -0.212 | 0.045 | 0.045 | 0.977 | -0.209 | -0.01 |
| -0.207345115137039 | -0.206 | 0.043 | 0.042 | 0.979 | -0.203 | -0.009 |
| -0.201061929829859 | -0.2 | 0.04 | 0.04 | 0.98 | -0.197 | -0.008 |
| -0.194778744522679 | -0.194 | 0.038 | 0.037 | 0.981 | -0.191 | -0.007 |
| -0.1884955592155 | -0.187 | 0.035 | 0.035 | 0.982 | -0.185 | -0.007 |
| -0.18221237390832 | -0.181 | 0.033 | 0.033 | 0.983 | -0.179 | -0.006 |
| -0.175929188601141 | -0.175 | 0.031 | 0.03 | 0.985 | -0.173 | -0.005 |
| -0.169646003293961 | -0.169 | 0.029 | 0.028 | 0.986 | -0.167 | -0.005 |
| -0.163362817986782 | -0.163 | 0.027 | 0.026 | 0.987 | -0.161 | -0.004 |
| -0.157079632679602 | -0.156 | 0.025 | 0.024 | 0.988 | -0.155 | -0.004 |
| -0.150796447372422 | -0.15 | 0.023 | 0.022 | 0.989 | -0.149 | -0.003 |
| -0.144513262065243 | -0.144 | 0.021 | 0.021 | 0.99 | -0.143 | -0.003 |
| -0.138230076758063 | -0.138 | 0.019 | 0.019 | 0.99 | -0.137 | -0.003 |
| -0.131946891450884 | -0.132 | 0.017 | 0.017 | 0.991 | -0.131 | -0.002 |
| -0.125663706143704 | -0.125 | 0.016 | 0.016 | 0.992 | -0.125 | -0.002 |
| -0.119380520836524 | -0.119 | 0.014 | 0.014 | 0.993 | -0.119 | -0.002 |
| -0.113097335529345 | -0.113 | 0.013 | 0.013 | 0.994 | -0.112 | -0.001 |
| -0.106814150222165 | -0.107 | 0.011 | 0.011 | 0.994 | -0.106 | -0.001 |
| -0.100530964914986 | -0.1 | 0.01 | 0.01 | 0.995 | -0.1 | -0.001 |
| -0.0942477796078061 | -0.094 | 0.009 | 0.009 | 0.996 | -0.094 | -0.001 |
| -0.0879645943006265 | -0.088 | 0.008 | 0.008 | 0.996 | -0.088 | -0.001 |
| -0.0816814089934469 | -0.082 | 0.007 | 0.007 | 0.997 | -0.081 | -0.001 |
| -0.0753982236862674 | -0.075 | 0.006 | 0.006 | 0.997 | -0.075 | 0 |
| -0.0691150383790878 | -0.069 | 0.005 | 0.005 | 0.998 | -0.069 | 0 |
| -0.0628318530719082 | -0.063 | 0.004 | 0.004 | 0.998 | -0.063 | 0 |
| -0.0565486677647286 | -0.057 | 0.003 | 0.003 | 0.998 | -0.056 | 0 |
| -0.050265482457549 | -0.05 | 0.003 | 0.003 | 0.999 | -0.05 | 0 |
| -0.0439822971503694 | -0.044 | 0.002 | 0.002 | 0.999 | -0.044 | 0 |
| -0.0376991118431899 | -0.038 | 0.001 | 0.001 | 0.999 | -0.038 | 0 |
| -0.0314159265360103 | -0.031 | 0.001 | 0.001 | 1 | -0.031 | 0 |
| -0.0251327412288307 | -0.025 | 0.001 | 0.001 | 1 | -0.025 | 0 |
| -0.0188495559216511 | -0.019 | 0 | 0 | 1 | -0.019 | 0 |
| -0.0125663706144715 | -0.013 | 0 | 0 | 1 | -0.013 | 0 |
| -0.00628318530729192 | -0.006 | 0 | 0 | 1 | -0.006 | 0 |
| -1.12338957580782e-13 | 0 | 0 | 0 | 1 | 0 | 0 |
| 0.00628318530706725 | 0.006 | 0 | 0 | 1 | 0.006 | 0 |
| 0.0125663706142468 | 0.013 | 0 | 0 | 1 | 0.013 | 0 |
| 0.0188495559214264 | 0.019 | 0 | 0 | 1 | 0.019 | 0 |
| 0.025132741228606 | 0.025 | 0.001 | 0.001 | 1 | 0.025 | 0 |
| 0.0314159265357856 | 0.031 | 0.001 | 0.001 | 1 | 0.031 | 0 |
| 0.0376991118429652 | 0.038 | 0.001 | 0.001 | 0.999 | 0.038 | 0 |
| 0.0439822971501448 | 0.044 | 0.002 | 0.002 | 0.999 | 0.044 | 0 |
| 0.0502654824573243 | 0.05 | 0.003 | 0.003 | 0.999 | 0.05 | 0 |
| 0.0565486677645039 | 0.057 | 0.003 | 0.003 | 0.998 | 0.056 | 0 |
| 0.0628318530716835 | 0.063 | 0.004 | 0.004 | 0.998 | 0.063 | 0 |
| 0.0691150383788631 | 0.069 | 0.005 | 0.005 | 0.998 | 0.069 | 0 |
| 0.0753982236860427 | 0.075 | 0.006 | 0.006 | 0.997 | 0.075 | 0 |
| 0.0816814089932222 | 0.082 | 0.007 | 0.007 | 0.997 | 0.081 | 0.001 |
| 0.0879645943004018 | 0.088 | 0.008 | 0.008 | 0.996 | 0.088 | 0.001 |
| 0.0942477796075814 | 0.094 | 0.009 | 0.009 | 0.996 | 0.094 | 0.001 |
| 0.100530964914761 | 0.1 | 0.01 | 0.01 | 0.995 | 0.1 | 0.001 |
| 0.106814150221941 | 0.107 | 0.011 | 0.011 | 0.994 | 0.106 | 0.001 |
| 0.11309733552912 | 0.113 | 0.013 | 0.013 | 0.994 | 0.112 | 0.001 |
| 0.1193805208363 | 0.119 | 0.014 | 0.014 | 0.993 | 0.119 | 0.002 |
| 0.125663706143479 | 0.125 | 0.016 | 0.016 | 0.992 | 0.125 | 0.002 |
| 0.131946891450659 | 0.132 | 0.017 | 0.017 | 0.991 | 0.131 | 0.002 |
| 0.138230076757839 | 0.138 | 0.019 | 0.019 | 0.99 | 0.137 | 0.003 |
| 0.144513262065018 | 0.144 | 0.021 | 0.021 | 0.99 | 0.143 | 0.003 |
| 0.150796447372198 | 0.15 | 0.023 | 0.022 | 0.989 | 0.149 | 0.003 |
| 0.157079632679377 | 0.156 | 0.025 | 0.024 | 0.988 | 0.155 | 0.004 |
| 0.163362817986557 | 0.163 | 0.027 | 0.026 | 0.987 | 0.161 | 0.004 |
| 0.169646003293736 | 0.169 | 0.029 | 0.028 | 0.986 | 0.167 | 0.005 |
| 0.175929188600916 | 0.175 | 0.031 | 0.03 | 0.985 | 0.173 | 0.005 |
| 0.182212373908096 | 0.181 | 0.033 | 0.033 | 0.983 | 0.179 | 0.006 |
| 0.188495559215275 | 0.187 | 0.035 | 0.035 | 0.982 | 0.185 | 0.007 |
| 0.194778744522455 | 0.194 | 0.038 | 0.037 | 0.981 | 0.191 | 0.007 |
| 0.201061929829634 | 0.2 | 0.04 | 0.04 | 0.98 | 0.197 | 0.008 |
| 0.207345115136814 | 0.206 | 0.043 | 0.042 | 0.979 | 0.203 | 0.009 |
| 0.213628300443994 | 0.212 | 0.045 | 0.045 | 0.977 | 0.209 | 0.01 |
| 0.219911485751173 | 0.218 | 0.048 | 0.047 | 0.976 | 0.215 | 0.011 |
| 0.226194671058353 | 0.224 | 0.051 | 0.05 | 0.975 | 0.22 | 0.011 |
| 0.232477856365532 | 0.23 | 0.054 | 0.053 | 0.973 | 0.226 | 0.012 |
| 0.238761041672712 | 0.236 | 0.056 | 0.055 | 0.972 | 0.232 | 0.013 |
| 0.245044226979891 | 0.243 | 0.059 | 0.058 | 0.97 | 0.238 | 0.015 |
| 0.251327412287071 | 0.249 | 0.063 | 0.061 | 0.969 | 0.243 | 0.016 |
| 0.257610597594251 | 0.255 | 0.066 | 0.064 | 0.967 | 0.249 | 0.017 |
| 0.26389378290143 | 0.261 | 0.069 | 0.067 | 0.965 | 0.255 | 0.018 |
| 0.27017696820861 | 0.267 | 0.072 | 0.07 | 0.964 | 0.26 | 0.019 |
| 0.276460153515789 | 0.273 | 0.075 | 0.074 | 0.962 | 0.266 | 0.021 |
| 0.282743338822969 | 0.279 | 0.079 | 0.077 | 0.96 | 0.272 | 0.022 |
| 0.289026524130149 | 0.285 | 0.082 | 0.08 | 0.959 | 0.277 | 0.024 |
| 0.295309709437328 | 0.291 | 0.086 | 0.083 | 0.957 | 0.283 | 0.025 |
| 0.301592894744508 | 0.297 | 0.09 | 0.087 | 0.955 | 0.288 | 0.027 |
| 0.307876080051687 | 0.303 | 0.093 | 0.09 | 0.953 | 0.293 | 0.029 |
| 0.314159265358867 | 0.309 | 0.097 | 0.094 | 0.951 | 0.299 | 0.03 |
| 0.320442450666046 | 0.315 | 0.101 | 0.097 | 0.949 | 0.304 | 0.032 |
| 0.326725635973226 | 0.321 | 0.105 | 0.101 | 0.947 | 0.309 | 0.034 |
| 0.333008821280406 | 0.327 | 0.109 | 0.105 | 0.945 | 0.315 | 0.036 |
| 0.339292006587585 | 0.333 | 0.113 | 0.109 | 0.943 | 0.32 | 0.038 |
| 0.345575191894765 | 0.339 | 0.117 | 0.112 | 0.941 | 0.325 | 0.04 |
| 0.351858377201944 | 0.345 | 0.121 | 0.116 | 0.939 | 0.33 | 0.043 |
| 0.358141562509124 | 0.351 | 0.126 | 0.12 | 0.937 | 0.335 | 0.045 |
| 0.364424747816304 | 0.356 | 0.13 | 0.124 | 0.934 | 0.34 | 0.047 |
| 0.370707933123483 | 0.362 | 0.134 | 0.128 | 0.932 | 0.346 | 0.05 |
| 0.376991118430663 | 0.368 | 0.139 | 0.132 | 0.93 | 0.351 | 0.052 |
| 0.383274303737842 | 0.374 | 0.143 | 0.136 | 0.927 | 0.355 | 0.055 |
| 0.389557489045022 | 0.38 | 0.148 | 0.14 | 0.925 | 0.36 | 0.058 |
| 0.395840674352201 | 0.386 | 0.153 | 0.145 | 0.923 | 0.365 | 0.06 |
| 0.402123859659381 | 0.391 | 0.157 | 0.149 | 0.92 | 0.37 | 0.063 |
| 0.408407044966561 | 0.397 | 0.162 | 0.153 | 0.918 | 0.375 | 0.066 |
| 0.41469023027374 | 0.403 | 0.167 | 0.157 | 0.915 | 0.38 | 0.069 |
| 0.42097341558092 | 0.409 | 0.172 | 0.162 | 0.913 | 0.384 | 0.072 |
| 0.427256600888099 | 0.414 | 0.177 | 0.166 | 0.91 | 0.389 | 0.076 |
| 0.433539786195279 | 0.42 | 0.182 | 0.171 | 0.907 | 0.393 | 0.079 |
| 0.439822971502459 | 0.426 | 0.187 | 0.175 | 0.905 | 0.398 | 0.082 |
| 0.446106156809638 | 0.431 | 0.192 | 0.18 | 0.902 | 0.402 | 0.086 |
| 0.452389342116818 | 0.437 | 0.198 | 0.184 | 0.899 | 0.407 | 0.089 |
| 0.458672527423997 | 0.443 | 0.203 | 0.189 | 0.897 | 0.411 | 0.093 |
| 0.464955712731177 | 0.448 | 0.208 | 0.193 | 0.894 | 0.416 | 0.097 |
| 0.471238898038356 | 0.454 | 0.214 | 0.198 | 0.891 | 0.42 | 0.101 |
| 0.477522083345536 | 0.46 | 0.219 | 0.203 | 0.888 | 0.424 | 0.105 |
| 0.483805268652716 | 0.465 | 0.225 | 0.207 | 0.885 | 0.428 | 0.109 |
| 0.490088453959895 | 0.471 | 0.231 | 0.212 | 0.882 | 0.432 | 0.113 |
| 0.496371639267075 | 0.476 | 0.236 | 0.217 | 0.879 | 0.436 | 0.117 |
| 0.502654824574254 | 0.482 | 0.242 | 0.221 | 0.876 | 0.44 | 0.122 |
| 0.508938009881434 | 0.487 | 0.248 | 0.226 | 0.873 | 0.444 | 0.126 |
| 0.515221195188614 | 0.493 | 0.254 | 0.231 | 0.87 | 0.448 | 0.131 |
| 0.521504380495793 | 0.498 | 0.26 | 0.236 | 0.867 | 0.452 | 0.135 |
| 0.527787565802973 | 0.504 | 0.266 | 0.241 | 0.864 | 0.456 | 0.14 |
| 0.534070751110153 | 0.509 | 0.272 | 0.246 | 0.861 | 0.46 | 0.145 |
| 0.540353936417332 | 0.514 | 0.278 | 0.25 | 0.858 | 0.463 | 0.15 |
| 0.546637121724512 | 0.52 | 0.284 | 0.255 | 0.854 | 0.467 | 0.155 |
| 0.552920307031692 | 0.525 | 0.29 | 0.26 | 0.851 | 0.471 | 0.161 |
| 0.559203492338871 | 0.531 | 0.297 | 0.265 | 0.848 | 0.474 | 0.166 |
| 0.565486677646051 | 0.536 | 0.303 | 0.27 | 0.844 | 0.477 | 0.171 |
| 0.571769862953231 | 0.541 | 0.309 | 0.275 | 0.841 | 0.481 | 0.177 |
| 0.57805304826041 | 0.546 | 0.316 | 0.28 | 0.838 | 0.484 | 0.183 |
| 0.58433623356759 | 0.552 | 0.322 | 0.285 | 0.834 | 0.487 | 0.188 |
| 0.590619418874769 | 0.557 | 0.329 | 0.29 | 0.831 | 0.491 | 0.194 |
| 0.596902604181949 | 0.562 | 0.336 | 0.295 | 0.827 | 0.494 | 0.2 |
| 0.603185789489129 | 0.567 | 0.342 | 0.3 | 0.824 | 0.497 | 0.206 |
| 0.609468974796308 | 0.572 | 0.349 | 0.305 | 0.82 | 0.5 | 0.213 |
| 0.615752160103488 | 0.578 | 0.356 | 0.31 | 0.816 | 0.503 | 0.219 |
| 0.622035345410668 | 0.583 | 0.362 | 0.314 | 0.813 | 0.506 | 0.225 |
| 0.628318530717847 | 0.588 | 0.369 | 0.319 | 0.809 | 0.508 | 0.232 |
| 0.634601716025027 | 0.593 | 0.376 | 0.324 | 0.805 | 0.511 | 0.239 |
| 0.640884901332206 | 0.598 | 0.383 | 0.329 | 0.802 | 0.514 | 0.246 |
| 0.647168086639386 | 0.603 | 0.39 | 0.334 | 0.798 | 0.516 | 0.253 |
| 0.653451271946566 | 0.608 | 0.397 | 0.339 | 0.794 | 0.519 | 0.26 |
| 0.659734457253745 | 0.613 | 0.404 | 0.344 | 0.79 | 0.521 | 0.267 |
| 0.666017642560925 | 0.618 | 0.412 | 0.349 | 0.786 | 0.524 | 0.274 |
| 0.672300827868105 | 0.623 | 0.419 | 0.354 | 0.782 | 0.526 | 0.281 |
| 0.678584013175284 | 0.628 | 0.426 | 0.358 | 0.778 | 0.528 | 0.289 |
| 0.684867198482464 | 0.633 | 0.433 | 0.363 | 0.775 | 0.53 | 0.297 |
| 0.691150383789644 | 0.637 | 0.441 | 0.368 | 0.771 | 0.533 | 0.304 |
| 0.697433569096823 | 0.642 | 0.448 | 0.373 | 0.766 | 0.535 | 0.312 |
| 0.703716754404003 | 0.647 | 0.455 | 0.378 | 0.762 | 0.537 | 0.32 |
| 0.709999939711183 | 0.652 | 0.463 | 0.382 | 0.758 | 0.538 | 0.329 |
| 0.716283125018362 | 0.657 | 0.47 | 0.387 | 0.754 | 0.54 | 0.337 |
| 0.722566310325542 | 0.661 | 0.478 | 0.392 | 0.75 | 0.542 | 0.345 |
| 0.728849495632721 | 0.666 | 0.485 | 0.396 | 0.746 | 0.544 | 0.354 |
| 0.735132680939901 | 0.671 | 0.493 | 0.401 | 0.742 | 0.545 | 0.362 |
| 0.741415866247081 | 0.675 | 0.501 | 0.405 | 0.738 | 0.547 | 0.371 |
| 0.74769905155426 | 0.68 | 0.508 | 0.41 | 0.733 | 0.548 | 0.38 |
| 0.75398223686144 | 0.685 | 0.516 | 0.414 | 0.729 | 0.55 | 0.389 |
| 0.76026542216862 | 0.689 | 0.524 | 0.419 | 0.725 | 0.551 | 0.398 |
| 0.766548607475799 | 0.694 | 0.532 | 0.423 | 0.72 | 0.552 | 0.408 |
| 0.772831792782979 | 0.698 | 0.54 | 0.428 | 0.716 | 0.553 | 0.417 |
| 0.779114978090159 | 0.703 | 0.547 | 0.432 | 0.712 | 0.554 | 0.427 |
| 0.785398163397338 | 0.707 | 0.555 | 0.436 | 0.707 | 0.555 | 0.436 |
| 0.791681348704518 | 0.712 | 0.563 | 0.44 | 0.703 | 0.556 | 0.446 |
| 0.797964534011697 | 0.716 | 0.571 | 0.445 | 0.698 | 0.557 | 0.456 |
| 0.804247719318877 | 0.72 | 0.579 | 0.449 | 0.694 | 0.558 | 0.466 |
| 0.810530904626057 | 0.725 | 0.587 | 0.453 | 0.689 | 0.559 | 0.476 |
| 0.816814089933236 | 0.729 | 0.595 | 0.457 | 0.685 | 0.559 | 0.486 |
| 0.823097275240416 | 0.733 | 0.604 | 0.461 | 0.68 | 0.56 | 0.497 |
| 0.829380460547596 | 0.738 | 0.612 | 0.465 | 0.675 | 0.56 | 0.507 |
| 0.835663645854775 | 0.742 | 0.62 | 0.468 | 0.671 | 0.56 | 0.518 |
| 0.841946831161955 | 0.746 | 0.628 | 0.472 | 0.666 | 0.561 | 0.529 |
| 0.848230016469135 | 0.75 | 0.636 | 0.476 | 0.661 | 0.561 | 0.54 |
| 0.854513201776314 | 0.754 | 0.645 | 0.479 | 0.657 | 0.561 | 0.551 |
| 0.860796387083494 | 0.758 | 0.653 | 0.483 | 0.652 | 0.561 | 0.562 |
| 0.867079572390674 | 0.762 | 0.661 | 0.486 | 0.647 | 0.561 | 0.573 |
| 0.873362757697853 | 0.766 | 0.669 | 0.49 | 0.642 | 0.561 | 0.585 |
| 0.879645943005033 | 0.771 | 0.678 | 0.493 | 0.637 | 0.561 | 0.596 |
| 0.885929128312212 | 0.775 | 0.686 | 0.496 | 0.633 | 0.56 | 0.608 |
| 0.892212313619392 | 0.778 | 0.695 | 0.5 | 0.628 | 0.56 | 0.62 |
| 0.898495498926572 | 0.782 | 0.703 | 0.503 | 0.623 | 0.56 | 0.632 |
| 0.904778684233751 | 0.786 | 0.711 | 0.506 | 0.618 | 0.559 | 0.644 |
| 0.911061869540931 | 0.79 | 0.72 | 0.509 | 0.613 | 0.558 | 0.656 |
| 0.917345054848111 | 0.794 | 0.728 | 0.512 | 0.608 | 0.558 | 0.668 |
| 0.92362824015529 | 0.798 | 0.737 | 0.514 | 0.603 | 0.557 | 0.681 |
| 0.92991142546247 | 0.802 | 0.745 | 0.517 | 0.598 | 0.556 | 0.693 |
| 0.93619461076965 | 0.805 | 0.754 | 0.52 | 0.593 | 0.555 | 0.706 |
| 0.942477796076829 | 0.809 | 0.762 | 0.522 | 0.588 | 0.554 | 0.719 |
| 0.948760981384009 | 0.813 | 0.771 | 0.525 | 0.583 | 0.553 | 0.732 |
| 0.955044166691188 | 0.816 | 0.78 | 0.527 | 0.578 | 0.552 | 0.745 |
| 0.961327351998368 | 0.82 | 0.788 | 0.529 | 0.572 | 0.55 | 0.758 |
| 0.967610537305548 | 0.824 | 0.797 | 0.531 | 0.567 | 0.549 | 0.771 |
| 0.973893722612727 | 0.827 | 0.805 | 0.533 | 0.562 | 0.547 | 0.784 |
| 0.980176907919907 | 0.831 | 0.814 | 0.535 | 0.557 | 0.546 | 0.798 |
| 0.986460093227087 | 0.834 | 0.823 | 0.537 | 0.552 | 0.544 | 0.812 |
| 0.992743278534266 | 0.838 | 0.831 | 0.538 | 0.546 | 0.542 | 0.825 |
| 0.999026463841446 | 0.841 | 0.84 | 0.54 | 0.541 | 0.541 | 0.839 |
| 1.005309649148626 | 0.844 | 0.849 | 0.542 | 0.536 | 0.539 | 0.853 |
| 1.011592834455805 | 0.848 | 0.858 | 0.543 | 0.531 | 0.537 | 0.867 |
| 1.017876019762985 | 0.851 | 0.866 | 0.544 | 0.525 | 0.535 | 0.882 |
| 1.024159205070164 | 0.854 | 0.875 | 0.545 | 0.52 | 0.532 | 0.896 |
| 1.030442390377344 | 0.858 | 0.884 | 0.546 | 0.514 | 0.53 | 0.911 |
| 1.036725575684524 | 0.861 | 0.892 | 0.547 | 0.509 | 0.528 | 0.925 |
| 1.043008760991703 | 0.864 | 0.901 | 0.548 | 0.504 | 0.525 | 0.94 |
| 1.049291946298883 | 0.867 | 0.91 | 0.549 | 0.498 | 0.523 | 0.955 |
| 1.055575131606063 | 0.87 | 0.919 | 0.549 | 0.493 | 0.52 | 0.97 |
| 1.061858316913242 | 0.873 | 0.927 | 0.549 | 0.487 | 0.517 | 0.985 |
| 1.068141502220422 | 0.876 | 0.936 | 0.55 | 0.482 | 0.515 | 1 |
| 1.074424687527602 | 0.879 | 0.945 | 0.55 | 0.476 | 0.512 | 1.015 |
| 1.080707872834781 | 0.882 | 0.953 | 0.55 | 0.471 | 0.509 | 1.03 |
| 1.086991058141961 | 0.885 | 0.962 | 0.55 | 0.465 | 0.506 | 1.046 |
| 1.09327424344914 | 0.888 | 0.971 | 0.549 | 0.46 | 0.502 | 1.062 |
| 1.09955742875632 | 0.891 | 0.98 | 0.549 | 0.454 | 0.499 | 1.077 |
| 1.1058406140635 | 0.894 | 0.988 | 0.548 | 0.448 | 0.496 | 1.093 |
| 1.112123799370679 | 0.897 | 0.997 | 0.548 | 0.443 | 0.492 | 1.109 |
| 1.11840698467786 | 0.899 | 1.006 | 0.547 | 0.437 | 0.489 | 1.125 |
| 1.124690169985039 | 0.902 | 1.015 | 0.546 | 0.431 | 0.485 | 1.141 |
| 1.130973355292218 | 0.905 | 1.023 | 0.545 | 0.426 | 0.482 | 1.157 |
| 1.137256540599398 | 0.907 | 1.032 | 0.543 | 0.42 | 0.478 | 1.174 |
| 1.143539725906578 | 0.91 | 1.041 | 0.542 | 0.414 | 0.474 | 1.19 |
| 1.149822911213757 | 0.913 | 1.049 | 0.54 | 0.409 | 0.47 | 1.207 |
| 1.156106096520937 | 0.915 | 1.058 | 0.539 | 0.403 | 0.466 | 1.223 |
| 1.162389281828116 | 0.918 | 1.067 | 0.537 | 0.397 | 0.462 | 1.24 |
| 1.168672467135296 | 0.92 | 1.075 | 0.535 | 0.391 | 0.457 | 1.257 |
| 1.174955652442476 | 0.923 | 1.084 | 0.532 | 0.386 | 0.453 | 1.274 |
| 1.181238837749655 | 0.925 | 1.093 | 0.53 | 0.38 | 0.449 | 1.291 |
| 1.187522023056835 | 0.927 | 1.101 | 0.527 | 0.374 | 0.444 | 1.308 |
| 1.193805208364015 | 0.93 | 1.11 | 0.525 | 0.368 | 0.439 | 1.325 |
| 1.200088393671194 | 0.932 | 1.119 | 0.522 | 0.362 | 0.435 | 1.342 |
| 1.206371578978374 | 0.934 | 1.127 | 0.519 | 0.356 | 0.43 | 1.36 |
| 1.212654764285554 | 0.937 | 1.136 | 0.515 | 0.351 | 0.425 | 1.377 |
| 1.218937949592733 | 0.939 | 1.144 | 0.512 | 0.345 | 0.42 | 1.395 |
| 1.225221134899913 | 0.941 | 1.153 | 0.509 | 0.339 | 0.415 | 1.412 |
| 1.231504320207093 | 0.943 | 1.161 | 0.505 | 0.333 | 0.41 | 1.43 |
| 1.237787505514272 | 0.945 | 1.17 | 0.501 | 0.327 | 0.405 | 1.448 |
| 1.244070690821452 | 0.947 | 1.178 | 0.497 | 0.321 | 0.399 | 1.466 |
| 1.250353876128631 | 0.949 | 1.187 | 0.492 | 0.315 | 0.394 | 1.484 |
| 1.256637061435811 | 0.951 | 1.195 | 0.488 | 0.309 | 0.388 | 1.502 |
| 1.262920246742991 | 0.953 | 1.204 | 0.483 | 0.303 | 0.383 | 1.52 |
| 1.26920343205017 | 0.955 | 1.212 | 0.478 | 0.297 | 0.377 | 1.538 |
| 1.27548661735735 | 0.957 | 1.22 | 0.473 | 0.291 | 0.371 | 1.556 |
| 1.28176980266453 | 0.959 | 1.229 | 0.468 | 0.285 | 0.365 | 1.575 |
| 1.28805298797171 | 0.96 | 1.237 | 0.463 | 0.279 | 0.359 | 1.593 |
| 1.294336173278889 | 0.962 | 1.245 | 0.457 | 0.273 | 0.353 | 1.612 |
| 1.300619358586069 | 0.964 | 1.253 | 0.451 | 0.267 | 0.347 | 1.63 |
| 1.306902543893248 | 0.965 | 1.262 | 0.446 | 0.261 | 0.341 | 1.649 |
| 1.313185729200428 | 0.967 | 1.27 | 0.439 | 0.255 | 0.335 | 1.668 |
| 1.319468914507607 | 0.969 | 1.278 | 0.433 | 0.249 | 0.328 | 1.686 |
| 1.325752099814787 | 0.97 | 1.286 | 0.426 | 0.243 | 0.322 | 1.705 |
| 1.332035285121967 | 0.972 | 1.294 | 0.42 | 0.236 | 0.315 | 1.724 |
| 1.338318470429146 | 0.973 | 1.302 | 0.413 | 0.23 | 0.308 | 1.743 |
| 1.344601655736326 | 0.975 | 1.31 | 0.405 | 0.224 | 0.302 | 1.762 |
| 1.350884841043506 | 0.976 | 1.318 | 0.398 | 0.218 | 0.295 | 1.781 |
| 1.357168026350685 | 0.977 | 1.326 | 0.39 | 0.212 | 0.288 | 1.8 |
| 1.363451211657865 | 0.979 | 1.334 | 0.383 | 0.206 | 0.281 | 1.819 |
| 1.369734396965045 | 0.98 | 1.342 | 0.375 | 0.2 | 0.274 | 1.838 |
| 1.376017582272224 | 0.981 | 1.35 | 0.366 | 0.194 | 0.266 | 1.858 |
| 1.382300767579404 | 0.982 | 1.358 | 0.358 | 0.187 | 0.259 | 1.877 |
| 1.388583952886583 | 0.983 | 1.366 | 0.349 | 0.181 | 0.252 | 1.896 |
| 1.394867138193763 | 0.985 | 1.373 | 0.341 | 0.175 | 0.244 | 1.916 |
| 1.401150323500943 | 0.986 | 1.381 | 0.331 | 0.169 | 0.237 | 1.935 |
| 1.407433508808122 | 0.987 | 1.389 | 0.322 | 0.163 | 0.229 | 1.954 |
| 1.413716694115302 | 0.988 | 1.396 | 0.313 | 0.156 | 0.221 | 1.974 |
| 1.419999879422482 | 0.989 | 1.404 | 0.303 | 0.15 | 0.213 | 1.994 |
| 1.426283064729661 | 0.99 | 1.411 | 0.293 | 0.144 | 0.205 | 2.013 |
| 1.432566250036841 | 0.99 | 1.419 | 0.283 | 0.138 | 0.197 | 2.033 |
| 1.438849435344021 | 0.991 | 1.426 | 0.272 | 0.132 | 0.189 | 2.052 |
| 1.4451326206512 | 0.992 | 1.434 | 0.262 | 0.125 | 0.181 | 2.072 |
| 1.45141580595838 | 0.993 | 1.441 | 0.251 | 0.119 | 0.173 | 2.092 |
| 1.45769899126556 | 0.994 | 1.448 | 0.24 | 0.113 | 0.165 | 2.111 |
| 1.46398217657274 | 0.994 | 1.456 | 0.228 | 0.107 | 0.156 | 2.131 |
| 1.470265361879919 | 0.995 | 1.463 | 0.217 | 0.1 | 0.148 | 2.151 |
| 1.476548547187098 | 0.996 | 1.47 | 0.205 | 0.094 | 0.139 | 2.171 |
| 1.482831732494278 | 0.996 | 1.477 | 0.193 | 0.088 | 0.13 | 2.19 |
| 1.489114917801458 | 0.997 | 1.484 | 0.181 | 0.082 | 0.121 | 2.21 |
| 1.495398103108637 | 0.997 | 1.491 | 0.168 | 0.075 | 0.113 | 2.23 |
| 1.501681288415817 | 0.998 | 1.498 | 0.156 | 0.069 | 0.104 | 2.25 |
| 1.507964473722997 | 0.998 | 1.505 | 0.143 | 0.063 | 0.095 | 2.269 |
| 1.514247659030176 | 0.998 | 1.512 | 0.13 | 0.057 | 0.086 | 2.289 |
| 1.520530844337356 | 0.999 | 1.519 | 0.116 | 0.05 | 0.076 | 2.309 |
| 1.526814029644536 | 0.999 | 1.525 | 0.102 | 0.044 | 0.067 | 2.329 |
| 1.533097214951715 | 0.999 | 1.532 | 0.089 | 0.038 | 0.058 | 2.349 |
| 1.539380400258895 | 1 | 1.539 | 0.074 | 0.031 | 0.048 | 2.369 |
| 1.545663585566075 | 1 | 1.545 | 0.06 | 0.025 | 0.039 | 2.388 |
| 1.551946770873254 | 1 | 1.552 | 0.045 | 0.019 | 0.029 | 2.408 |
| 1.558229956180434 | 1 | 1.558 | 0.031 | 0.013 | 0.02 | 2.428 |
| 1.564513141487613 | 1 | 1.564 | 0.015 | 0.006 | 0.01 | 2.448 |
| 1.570796326794793 | 1 | 1.571 | 0 | 0 | 0 | 2.467 |
| 1.577079512101973 | 1 | 1.577 | -0.016 | -0.006 | -0.01 | 2.487 |
| 1.583362697409152 | 1 | 1.583 | -0.032 | -0.013 | -0.02 | 2.507 |
| 1.589645882716332 | 1 | 1.589 | -0.048 | -0.019 | -0.03 | 2.527 |
| 1.595929068023512 | 1 | 1.595 | -0.064 | -0.025 | -0.04 | 2.546 |
| 1.602212253330691 | 1 | 1.601 | -0.081 | -0.031 | -0.05 | 2.566 |
| 1.608495438637871 | 0.999 | 1.607 | -0.098 | -0.038 | -0.061 | 2.585 |
| 1.61477862394505 | 0.999 | 1.613 | -0.115 | -0.044 | -0.071 | 2.605 |
| 1.62106180925223 | 0.999 | 1.619 | -0.132 | -0.05 | -0.081 | 2.625 |
| 1.62734499455941 | 0.998 | 1.625 | -0.15 | -0.057 | -0.092 | 2.644 |
| 1.633628179866589 | 0.998 | 1.63 | -0.168 | -0.063 | -0.103 | 2.663 |
| 1.63991136517377 | 0.998 | 1.636 | -0.186 | -0.069 | -0.113 | 2.683 |
| 1.646194550480949 | 0.997 | 1.642 | -0.204 | -0.075 | -0.124 | 2.702 |
| 1.652477735788128 | 0.997 | 1.647 | -0.223 | -0.082 | -0.135 | 2.722 |
| 1.658760921095308 | 0.996 | 1.652 | -0.242 | -0.088 | -0.146 | 2.741 |
| 1.665044106402488 | 0.996 | 1.658 | -0.261 | -0.094 | -0.157 | 2.76 |
| 1.671327291709667 | 0.995 | 1.663 | -0.28 | -0.1 | -0.168 | 2.779 |
| 1.677610477016847 | 0.994 | 1.668 | -0.3 | -0.107 | -0.179 | 2.798 |
| 1.683893662324026 | 0.994 | 1.673 | -0.32 | -0.113 | -0.19 | 2.817 |
| 1.690176847631206 | 0.993 | 1.678 | -0.34 | -0.119 | -0.201 | 2.836 |
| 1.696460032938386 | 0.992 | 1.683 | -0.361 | -0.125 | -0.213 | 2.855 |
| 1.702743218245565 | 0.991 | 1.688 | -0.381 | -0.132 | -0.224 | 2.874 |
| 1.709026403552745 | 0.99 | 1.693 | -0.402 | -0.138 | -0.235 | 2.893 |
| 1.715309588859925 | 0.99 | 1.697 | -0.424 | -0.144 | -0.247 | 2.912 |
| 1.721592774167104 | 0.989 | 1.702 | -0.445 | -0.15 | -0.259 | 2.93 |
| 1.727875959474284 | 0.988 | 1.707 | -0.467 | -0.156 | -0.27 | 2.949 |
| 1.734159144781464 | 0.987 | 1.711 | -0.489 | -0.163 | -0.282 | 2.967 |
| 1.740442330088643 | 0.986 | 1.715 | -0.511 | -0.169 | -0.294 | 2.986 |
| 1.746725515395823 | 0.985 | 1.72 | -0.534 | -0.175 | -0.306 | 3.004 |
| 1.753008700703003 | 0.983 | 1.724 | -0.557 | -0.181 | -0.318 | 3.022 |
| 1.759291886010182 | 0.982 | 1.728 | -0.58 | -0.187 | -0.33 | 3.04 |
| 1.765575071317362 | 0.981 | 1.732 | -0.603 | -0.194 | -0.342 | 3.058 |
| 1.771858256624541 | 0.98 | 1.736 | -0.627 | -0.2 | -0.354 | 3.076 |
| 1.778141441931721 | 0.979 | 1.74 | -0.651 | -0.206 | -0.366 | 3.094 |
| 1.784424627238901 | 0.977 | 1.744 | -0.675 | -0.212 | -0.378 | 3.112 |
| 1.79070781254608 | 0.976 | 1.748 | -0.7 | -0.218 | -0.391 | 3.129 |
| 1.79699099785326 | 0.975 | 1.751 | -0.724 | -0.224 | -0.403 | 3.147 |
| 1.80327418316044 | 0.973 | 1.755 | -0.749 | -0.23 | -0.415 | 3.164 |
| 1.809557368467619 | 0.972 | 1.758 | -0.774 | -0.236 | -0.428 | 3.182 |
| 1.815840553774799 | 0.97 | 1.762 | -0.8 | -0.243 | -0.441 | 3.199 |
| 1.822123739081979 | 0.969 | 1.765 | -0.826 | -0.249 | -0.453 | 3.216 |
| 1.828406924389158 | 0.967 | 1.768 | -0.852 | -0.255 | -0.466 | 3.233 |
| 1.834690109696338 | 0.965 | 1.771 | -0.878 | -0.261 | -0.479 | 3.25 |
| 1.840973295003518 | 0.964 | 1.774 | -0.905 | -0.267 | -0.491 | 3.266 |
| 1.847256480310697 | 0.962 | 1.777 | -0.931 | -0.273 | -0.504 | 3.283 |
| 1.853539665617877 | 0.96 | 1.78 | -0.959 | -0.279 | -0.517 | 3.299 |
| 1.859822850925056 | 0.959 | 1.783 | -0.986 | -0.285 | -0.53 | 3.315 |
| 1.866106036232236 | 0.957 | 1.785 | -1.013 | -0.291 | -0.543 | 3.332 |
| 1.872389221539416 | 0.955 | 1.788 | -1.041 | -0.297 | -0.556 | 3.348 |
| 1.878672406846595 | 0.953 | 1.79 | -1.07 | -0.303 | -0.569 | 3.363 |
| 1.884955592153775 | 0.951 | 1.793 | -1.098 | -0.309 | -0.582 | 3.379 |
| 1.891238777460955 | 0.949 | 1.795 | -1.127 | -0.315 | -0.596 | 3.395 |
| 1.897521962768134 | 0.947 | 1.797 | -1.156 | -0.321 | -0.609 | 3.41 |
| 1.903805148075314 | 0.945 | 1.799 | -1.185 | -0.327 | -0.622 | 3.425 |
| 1.910088333382494 | 0.943 | 1.801 | -1.214 | -0.333 | -0.636 | 3.44 |
| 1.916371518689673 | 0.941 | 1.803 | -1.244 | -0.339 | -0.649 | 3.455 |
| 1.922654703996853 | 0.939 | 1.805 | -1.274 | -0.345 | -0.663 | 3.47 |
| 1.928937889304033 | 0.937 | 1.807 | -1.304 | -0.351 | -0.676 | 3.485 |
| 1.935221074611212 | 0.934 | 1.808 | -1.335 | -0.356 | -0.69 | 3.499 |
| 1.941504259918392 | 0.932 | 1.81 | -1.366 | -0.362 | -0.703 | 3.513 |
| 1.947787445225571 | 0.93 | 1.811 | -1.397 | -0.368 | -0.717 | 3.527 |
| 1.954070630532751 | 0.927 | 1.812 | -1.428 | -0.374 | -0.731 | 3.541 |
| 1.960353815839931 | 0.925 | 1.813 | -1.459 | -0.38 | -0.745 | 3.555 |
| 1.96663700114711 | 0.923 | 1.815 | -1.491 | -0.386 | -0.758 | 3.569 |
| 1.97292018645429 | 0.92 | 1.816 | -1.523 | -0.391 | -0.772 | 3.582 |
| 1.97920337176147 | 0.918 | 1.816 | -1.556 | -0.397 | -0.786 | 3.595 |
| 1.985486557068649 | 0.915 | 1.817 | -1.588 | -0.403 | -0.8 | 3.608 |
| 1.991769742375829 | 0.913 | 1.818 | -1.621 | -0.409 | -0.814 | 3.621 |
| 1.998052927683009 | 0.91 | 1.818 | -1.654 | -0.414 | -0.828 | 3.633 |
| 2.004336112990188 | 0.907 | 1.819 | -1.688 | -0.42 | -0.842 | 3.646 |
| 2.010619298297368 | 0.905 | 1.819 | -1.721 | -0.426 | -0.856 | 3.658 |
| 2.016902483604547 | 0.902 | 1.82 | -1.755 | -0.431 | -0.87 | 3.67 |
| 2.023185668911727 | 0.899 | 1.82 | -1.789 | -0.437 | -0.884 | 3.682 |
| 2.029468854218907 | 0.897 | 1.82 | -1.824 | -0.443 | -0.899 | 3.693 |
| 2.035752039526086 | 0.894 | 1.82 | -1.858 | -0.448 | -0.913 | 3.704 |
| 2.042035224833266 | 0.891 | 1.819 | -1.893 | -0.454 | -0.927 | 3.715 |
| 2.048318410140446 | 0.888 | 1.819 | -1.928 | -0.46 | -0.941 | 3.726 |
| 2.054601595447625 | 0.885 | 1.819 | -1.964 | -0.465 | -0.956 | 3.737 |
| 2.060884780754805 | 0.882 | 1.818 | -1.999 | -0.471 | -0.97 | 3.747 |
| 2.067167966061984 | 0.879 | 1.818 | -2.035 | -0.476 | -0.984 | 3.757 |
| 2.073451151369164 | 0.876 | 1.817 | -2.071 | -0.482 | -0.999 | 3.767 |
| 2.079734336676344 | 0.873 | 1.816 | -2.108 | -0.487 | -1.013 | 3.777 |
| 2.086017521983524 | 0.87 | 1.815 | -2.144 | -0.493 | -1.028 | 3.787 |
| 2.092300707290703 | 0.867 | 1.814 | -2.181 | -0.498 | -1.042 | 3.796 |
| 2.098583892597883 | 0.864 | 1.813 | -2.218 | -0.504 | -1.057 | 3.805 |
| 2.104867077905062 | 0.861 | 1.812 | -2.255 | -0.509 | -1.071 | 3.813 |
| 2.111150263212242 | 0.858 | 1.81 | -2.293 | -0.514 | -1.086 | 3.822 |
| 2.117433448519422 | 0.854 | 1.809 | -2.331 | -0.52 | -1.101 | 3.83 |
| 2.123716633826601 | 0.851 | 1.807 | -2.369 | -0.525 | -1.115 | 3.838 |
| 2.129999819133781 | 0.848 | 1.806 | -2.407 | -0.531 | -1.13 | 3.846 |
| 2.136283004440961 | 0.844 | 1.804 | -2.445 | -0.536 | -1.145 | 3.853 |
| 2.14256618974814 | 0.841 | 1.802 | -2.484 | -0.541 | -1.159 | 3.86 |
| 2.14884937505532 | 0.838 | 1.8 | -2.523 | -0.546 | -1.174 | 3.867 |
| 2.1551325603625 | 0.834 | 1.798 | -2.562 | -0.552 | -1.189 | 3.874 |
| 2.16141574566968 | 0.831 | 1.795 | -2.602 | -0.557 | -1.204 | 3.88 |
| 2.167698930976859 | 0.827 | 1.793 | -2.641 | -0.562 | -1.218 | 3.886 |
| 2.173982116284038 | 0.824 | 1.79 | -2.681 | -0.567 | -1.233 | 3.892 |
| 2.180265301591218 | 0.82 | 1.788 | -2.721 | -0.572 | -1.248 | 3.898 |
| 2.186548486898398 | 0.816 | 1.785 | -2.761 | -0.578 | -1.263 | 3.903 |
| 2.192831672205577 | 0.813 | 1.782 | -2.802 | -0.583 | -1.278 | 3.908 |
| 2.199114857512757 | 0.809 | 1.779 | -2.843 | -0.588 | -1.293 | 3.912 |
| 2.205398042819936 | 0.805 | 1.776 | -2.884 | -0.593 | -1.307 | 3.917 |
| 2.211681228127116 | 0.802 | 1.773 | -2.925 | -0.598 | -1.322 | 3.921 |
| 2.217964413434296 | 0.798 | 1.769 | -2.966 | -0.603 | -1.337 | 3.925 |
| 2.224247598741475 | 0.794 | 1.766 | -3.008 | -0.608 | -1.352 | 3.928 |
| 2.230530784048655 | 0.79 | 1.762 | -3.049 | -0.613 | -1.367 | 3.931 |
| 2.236813969355835 | 0.786 | 1.759 | -3.091 | -0.618 | -1.382 | 3.934 |
| 2.243097154663014 | 0.782 | 1.755 | -3.134 | -0.623 | -1.397 | 3.937 |
| 2.249380339970194 | 0.778 | 1.751 | -3.176 | -0.628 | -1.412 | 3.939 |
| 2.255663525277374 | 0.775 | 1.747 | -3.219 | -0.633 | -1.427 | 3.941 |
| 2.261946710584553 | 0.771 | 1.743 | -3.261 | -0.637 | -1.442 | 3.942 |
| 2.268229895891733 | 0.766 | 1.739 | -3.304 | -0.642 | -1.457 | 3.944 |
| 2.274513081198912 | 0.762 | 1.734 | -3.347 | -0.647 | -1.472 | 3.944 |
| 2.280796266506092 | 0.758 | 1.73 | -3.391 | -0.652 | -1.487 | 3.945 |
| 2.287079451813272 | 0.754 | 1.725 | -3.434 | -0.657 | -1.502 | 3.945 |
| 2.293362637120452 | 0.75 | 1.72 | -3.478 | -0.661 | -1.517 | 3.945 |
| 2.299645822427631 | 0.746 | 1.715 | -3.522 | -0.666 | -1.532 | 3.945 |
| 2.305929007734811 | 0.742 | 1.71 | -3.566 | -0.671 | -1.547 | 3.944 |
| 2.312212193041991 | 0.738 | 1.705 | -3.611 | -0.675 | -1.562 | 3.943 |
| 2.31849537834917 | 0.733 | 1.7 | -3.655 | -0.68 | -1.576 | 3.942 |
| 2.32477856365635 | 0.729 | 1.695 | -3.7 | -0.685 | -1.591 | 3.94 |
| 2.331061748963529 | 0.725 | 1.689 | -3.745 | -0.689 | -1.606 | 3.938 |
| 2.337344934270709 | 0.72 | 1.684 | -3.79 | -0.694 | -1.621 | 3.935 |
| 2.343628119577889 | 0.716 | 1.678 | -3.835 | -0.698 | -1.636 | 3.932 |
| 2.349911304885068 | 0.712 | 1.672 | -3.88 | -0.703 | -1.651 | 3.929 |
| 2.356194490192248 | 0.707 | 1.666 | -3.926 | -0.707 | -1.666 | 3.926 |
| 2.362477675499428 | 0.703 | 1.66 | -3.971 | -0.712 | -1.681 | 3.922 |
| 2.368760860806607 | 0.698 | 1.654 | -4.017 | -0.716 | -1.696 | 3.917 |
| 2.375044046113787 | 0.694 | 1.647 | -4.063 | -0.72 | -1.711 | 3.913 |
| 2.381327231420966 | 0.689 | 1.641 | -4.109 | -0.725 | -1.726 | 3.908 |
| 2.387610416728146 | 0.685 | 1.634 | -4.156 | -0.729 | -1.74 | 3.902 |
| 2.393893602035326 | 0.68 | 1.628 | -4.202 | -0.733 | -1.755 | 3.897 |
| 2.400176787342505 | 0.675 | 1.621 | -4.249 | -0.738 | -1.77 | 3.89 |
| 2.406459972649685 | 0.671 | 1.614 | -4.295 | -0.742 | -1.785 | 3.884 |
| 2.412743157956865 | 0.666 | 1.607 | -4.342 | -0.746 | -1.8 | 3.877 |
| 2.419026343264044 | 0.661 | 1.6 | -4.389 | -0.75 | -1.815 | 3.87 |
| 2.425309528571224 | 0.657 | 1.592 | -4.437 | -0.754 | -1.829 | 3.862 |
| 2.431592713878404 | 0.652 | 1.585 | -4.484 | -0.758 | -1.844 | 3.854 |
| 2.437875899185583 | 0.647 | 1.577 | -4.531 | -0.762 | -1.859 | 3.846 |
| 2.444159084492763 | 0.642 | 1.57 | -4.579 | -0.766 | -1.873 | 3.837 |
| 2.450442269799943 | 0.637 | 1.562 | -4.627 | -0.771 | -1.888 | 3.828 |
| 2.456725455107122 | 0.633 | 1.554 | -4.675 | -0.775 | -1.903 | 3.818 |
| 2.463008640414302 | 0.628 | 1.546 | -4.722 | -0.778 | -1.917 | 3.808 |
| 2.469291825721482 | 0.623 | 1.538 | -4.771 | -0.782 | -1.932 | 3.797 |
| 2.475575011028661 | 0.618 | 1.53 | -4.819 | -0.786 | -1.947 | 3.787 |
| 2.481858196335841 | 0.613 | 1.521 | -4.867 | -0.79 | -1.961 | 3.775 |
| 2.48814138164302 | 0.608 | 1.513 | -4.915 | -0.794 | -1.976 | 3.764 |
| 2.4944245669502 | 0.603 | 1.504 | -4.964 | -0.798 | -1.99 | 3.752 |
| 2.50070775225738 | 0.598 | 1.495 | -5.013 | -0.802 | -2.004 | 3.739 |
| 2.506990937564559 | 0.593 | 1.486 | -5.061 | -0.805 | -2.019 | 3.726 |
| 2.51327412287174 | 0.588 | 1.477 | -5.11 | -0.809 | -2.033 | 3.713 |
| 2.519557308178919 | 0.583 | 1.468 | -5.159 | -0.813 | -2.048 | 3.699 |
| 2.525840493486098 | 0.578 | 1.459 | -5.208 | -0.816 | -2.062 | 3.685 |
| 2.532123678793278 | 0.572 | 1.449 | -5.257 | -0.82 | -2.076 | 3.67 |
| 2.538406864100458 | 0.567 | 1.44 | -5.306 | -0.824 | -2.09 | 3.655 |
| 2.544690049407637 | 0.562 | 1.43 | -5.356 | -0.827 | -2.105 | 3.64 |
| 2.550973234714817 | 0.557 | 1.421 | -5.405 | -0.831 | -2.119 | 3.624 |
| 2.557256420021996 | 0.552 | 1.411 | -5.455 | -0.834 | -2.133 | 3.608 |
| 2.563539605329176 | 0.546 | 1.401 | -5.504 | -0.838 | -2.147 | 3.591 |
| 2.569822790636356 | 0.541 | 1.391 | -5.554 | -0.841 | -2.161 | 3.574 |
| 2.576105975943535 | 0.536 | 1.38 | -5.603 | -0.844 | -2.175 | 3.556 |
| 2.582389161250715 | 0.531 | 1.37 | -5.653 | -0.848 | -2.189 | 3.538 |
| 2.588672346557895 | 0.525 | 1.36 | -5.703 | -0.851 | -2.203 | 3.519 |
| 2.594955531865074 | 0.52 | 1.349 | -5.753 | -0.854 | -2.217 | 3.5 |
| 2.601238717172254 | 0.514 | 1.338 | -5.802 | -0.858 | -2.231 | 3.481 |
| 2.607521902479433 | 0.509 | 1.327 | -5.852 | -0.861 | -2.244 | 3.461 |
| 2.613805087786613 | 0.504 | 1.316 | -5.902 | -0.864 | -2.258 | 3.441 |
| 2.620088273093793 | 0.498 | 1.305 | -5.952 | -0.867 | -2.272 | 3.42 |
| 2.626371458400972 | 0.493 | 1.294 | -6.002 | -0.87 | -2.285 | 3.399 |
| 2.632654643708152 | 0.487 | 1.283 | -6.052 | -0.873 | -2.299 | 3.377 |
| 2.638937829015332 | 0.482 | 1.271 | -6.103 | -0.876 | -2.313 | 3.355 |
| 2.645221014322511 | 0.476 | 1.26 | -6.153 | -0.879 | -2.326 | 3.332 |
| 2.651504199629691 | 0.471 | 1.248 | -6.203 | -0.882 | -2.339 | 3.309 |
| 2.657787384936871 | 0.465 | 1.236 | -6.253 | -0.885 | -2.353 | 3.286 |
| 2.66407057024405 | 0.46 | 1.224 | -6.303 | -0.888 | -2.366 | 3.262 |
| 2.67035375555123 | 0.454 | 1.212 | -6.354 | -0.891 | -2.379 | 3.237 |
| 2.67663694085841 | 0.448 | 1.2 | -6.404 | -0.894 | -2.392 | 3.212 |
| 2.682920126165589 | 0.443 | 1.188 | -6.454 | -0.897 | -2.406 | 3.187 |
| 2.689203311472769 | 0.437 | 1.175 | -6.504 | -0.899 | -2.419 | 3.161 |
| 2.695486496779948 | 0.431 | 1.163 | -6.555 | -0.902 | -2.432 | 3.135 |
| 2.701769682087128 | 0.426 | 1.15 | -6.605 | -0.905 | -2.445 | 3.108 |
| 2.708052867394308 | 0.42 | 1.138 | -6.655 | -0.907 | -2.458 | 3.081 |
| 2.714336052701487 | 0.414 | 1.125 | -6.705 | -0.91 | -2.47 | 3.053 |
| 2.720619238008667 | 0.409 | 1.112 | -6.756 | -0.913 | -2.483 | 3.025 |
| 2.726902423315847 | 0.403 | 1.099 | -6.806 | -0.915 | -2.496 | 2.996 |
| 2.733185608623026 | 0.397 | 1.085 | -6.856 | -0.918 | -2.508 | 2.967 |
| 2.739468793930206 | 0.391 | 1.072 | -6.906 | -0.92 | -2.521 | 2.937 |
| 2.745751979237386 | 0.386 | 1.059 | -6.956 | -0.923 | -2.533 | 2.907 |
| 2.752035164544565 | 0.38 | 1.045 | -7.006 | -0.925 | -2.546 | 2.876 |
| 2.758318349851745 | 0.374 | 1.031 | -7.056 | -0.927 | -2.558 | 2.845 |
| 2.764601535158925 | 0.368 | 1.018 | -7.106 | -0.93 | -2.57 | 2.814 |
| 2.770884720466104 | 0.362 | 1.004 | -7.156 | -0.932 | -2.583 | 2.781 |
| 2.777167905773284 | 0.356 | 0.99 | -7.206 | -0.934 | -2.595 | 2.749 |
| 2.783451091080463 | 0.351 | 0.976 | -7.256 | -0.937 | -2.607 | 2.716 |
| 2.789734276387643 | 0.345 | 0.961 | -7.306 | -0.939 | -2.619 | 2.682 |
| 2.796017461694823 | 0.339 | 0.947 | -7.356 | -0.941 | -2.631 | 2.648 |
| 2.802300647002002 | 0.333 | 0.933 | -7.405 | -0.943 | -2.643 | 2.614 |
| 2.808583832309182 | 0.327 | 0.918 | -7.455 | -0.945 | -2.654 | 2.579 |
| 2.814867017616362 | 0.321 | 0.903 | -7.504 | -0.947 | -2.666 | 2.543 |
| 2.821150202923541 | 0.315 | 0.889 | -7.554 | -0.949 | -2.678 | 2.507 |
| 2.827433388230721 | 0.309 | 0.874 | -7.603 | -0.951 | -2.689 | 2.47 |
| 2.833716573537901 | 0.303 | 0.859 | -7.652 | -0.953 | -2.7 | 2.433 |
| 2.83999975884508 | 0.297 | 0.844 | -7.702 | -0.955 | -2.712 | 2.396 |
| 2.84628294415226 | 0.291 | 0.828 | -7.751 | -0.957 | -2.723 | 2.358 |
| 2.852566129459439 | 0.285 | 0.813 | -7.8 | -0.959 | -2.734 | 2.319 |
| 2.858849314766619 | 0.279 | 0.798 | -7.848 | -0.96 | -2.745 | 2.28 |
| 2.865132500073799 | 0.273 | 0.782 | -7.897 | -0.962 | -2.756 | 2.241 |
| 2.871415685380978 | 0.267 | 0.766 | -7.946 | -0.964 | -2.767 | 2.201 |
| 2.877698870688158 | 0.261 | 0.751 | -7.994 | -0.965 | -2.778 | 2.16 |
| 2.883982055995337 | 0.255 | 0.735 | -8.043 | -0.967 | -2.789 | 2.119 |
| 2.890265241302517 | 0.249 | 0.719 | -8.091 | -0.969 | -2.799 | 2.077 |
| 2.896548426609697 | 0.243 | 0.703 | -8.139 | -0.97 | -2.81 | 2.035 |
| 2.902831611916877 | 0.236 | 0.687 | -8.187 | -0.972 | -2.82 | 1.993 |
| 2.909114797224056 | 0.23 | 0.67 | -8.235 | -0.973 | -2.831 | 1.95 |
| 2.915397982531236 | 0.224 | 0.654 | -8.283 | -0.975 | -2.841 | 1.906 |
| 2.921681167838416 | 0.218 | 0.637 | -8.331 | -0.976 | -2.851 | 1.862 |
| 2.927964353145595 | 0.212 | 0.621 | -8.378 | -0.977 | -2.861 | 1.818 |
| 2.934247538452775 | 0.206 | 0.604 | -8.425 | -0.979 | -2.871 | 1.772 |
| 2.940530723759954 | 0.2 | 0.587 | -8.473 | -0.98 | -2.881 | 1.727 |
| 2.946813909067134 | 0.194 | 0.57 | -8.52 | -0.981 | -2.891 | 1.681 |
| 2.953097094374314 | 0.187 | 0.553 | -8.566 | -0.982 | -2.901 | 1.634 |
| 2.959380279681493 | 0.181 | 0.536 | -8.613 | -0.983 | -2.91 | 1.587 |
| 2.965663464988673 | 0.175 | 0.519 | -8.659 | -0.985 | -2.92 | 1.539 |
| 2.971946650295853 | 0.169 | 0.502 | -8.706 | -0.986 | -2.929 | 1.491 |
| 2.978229835603032 | 0.163 | 0.484 | -8.752 | -0.987 | -2.939 | 1.443 |
| 2.984513020910212 | 0.156 | 0.467 | -8.798 | -0.988 | -2.948 | 1.393 |
| 2.990796206217391 | 0.15 | 0.449 | -8.843 | -0.989 | -2.957 | 1.344 |
| 2.997079391524571 | 0.144 | 0.432 | -8.889 | -0.99 | -2.966 | 1.294 |
| 3.003362576831751 | 0.138 | 0.414 | -8.934 | -0.99 | -2.975 | 1.243 |
| 3.009645762138931 | 0.132 | 0.396 | -8.979 | -0.991 | -2.983 | 1.192 |
| 3.01592894744611 | 0.125 | 0.378 | -9.024 | -0.992 | -2.992 | 1.14 |
| 3.02221213275329 | 0.119 | 0.36 | -9.069 | -0.993 | -3.001 | 1.088 |
| 3.028495318060469 | 0.113 | 0.342 | -9.113 | -0.994 | -3.009 | 1.035 |
| 3.034778503367649 | 0.107 | 0.324 | -9.157 | -0.994 | -3.017 | 0.982 |
| 3.041061688674829 | 0.1 | 0.305 | -9.201 | -0.995 | -3.026 | 0.928 |
| 3.047344873982008 | 0.094 | 0.287 | -9.245 | -0.996 | -3.034 | 0.874 |
| 3.053628059289188 | 0.088 | 0.268 | -9.289 | -0.996 | -3.042 | 0.819 |
| 3.059911244596367 | 0.082 | 0.25 | -9.332 | -0.997 | -3.05 | 0.764 |
| 3.066194429903547 | 0.075 | 0.231 | -9.375 | -0.997 | -3.057 | 0.708 |
| 3.072477615210727 | 0.069 | 0.212 | -9.418 | -0.998 | -3.065 | 0.652 |
| 3.078760800517906 | 0.063 | 0.193 | -9.46 | -0.998 | -3.073 | 0.595 |
| 3.085043985825086 | 0.057 | 0.174 | -9.502 | -0.998 | -3.08 | 0.538 |
| 3.091327171132266 | 0.05 | 0.155 | -9.544 | -0.999 | -3.087 | 0.48 |
| 3.097610356439445 | 0.044 | 0.136 | -9.586 | -0.999 | -3.095 | 0.422 |
| 3.103893541746625 | 0.038 | 0.117 | -9.627 | -0.999 | -3.102 | 0.363 |
| 3.110176727053805 | 0.031 | 0.098 | -9.668 | -1 | -3.109 | 0.304 |
| 3.116459912360984 | 0.025 | 0.078 | -9.709 | -1 | -3.115 | 0.244 |
| 3.122743097668164 | 0.019 | 0.059 | -9.75 | -1 | -3.122 | 0.184 |
| 3.129026282975343 | 0.013 | 0.039 | -9.79 | -1 | -3.129 | 0.123 |
| 3.135309468282523 | 0.006 | 0.02 | -9.83 | -1 | -3.135 | 0.062 |
| 3.141592653589703 | 0 | 0 | -9.87 | -1 | -3.142 | 0 |
| 3.147875838896883 | -0.006 | -0.02 | -9.909 | -1 | -3.148 | -0.062 |
| 3.154159024204062 | -0.013 | -0.04 | -9.948 | -1 | -3.154 | -0.125 |
| 3.160442209511242 | -0.019 | -0.06 | -9.987 | -1 | -3.16 | -0.188 |
| 3.166725394818422 | -0.025 | -0.08 | -10.025 | -1 | -3.166 | -0.252 |
| 3.173008580125601 | -0.031 | -0.1 | -10.063 | -1 | -3.171 | -0.316 |
| 3.179291765432781 | -0.038 | -0.12 | -10.101 | -0.999 | -3.177 | -0.381 |
| 3.18557495073996 | -0.044 | -0.14 | -10.138 | -0.999 | -3.182 | -0.446 |
| 3.19185813604714 | -0.05 | -0.16 | -10.175 | -0.999 | -3.188 | -0.512 |
| 3.19814132135432 | -0.057 | -0.181 | -10.212 | -0.998 | -3.193 | -0.578 |
| 3.2044245066615 | -0.063 | -0.201 | -10.248 | -0.998 | -3.198 | -0.645 |
| 3.210707691968679 | -0.069 | -0.222 | -10.284 | -0.998 | -3.203 | -0.712 |
| 3.216990877275859 | -0.075 | -0.242 | -10.32 | -0.997 | -3.208 | -0.78 |
| 3.223274062583038 | -0.082 | -0.263 | -10.355 | -0.997 | -3.213 | -0.848 |
| 3.229557247890217 | -0.088 | -0.284 | -10.39 | -0.996 | -3.217 | -0.916 |
| 3.235840433197398 | -0.094 | -0.305 | -10.424 | -0.996 | -3.221 | -0.985 |
| 3.242123618504577 | -0.1 | -0.325 | -10.458 | -0.995 | -3.226 | -1.055 |
| 3.248406803811757 | -0.107 | -0.346 | -10.492 | -0.994 | -3.23 | -1.125 |
| 3.254689989118936 | -0.113 | -0.367 | -10.525 | -0.994 | -3.234 | -1.195 |
| 3.260973174426116 | -0.119 | -0.388 | -10.558 | -0.993 | -3.238 | -1.266 |
| 3.267256359733296 | -0.125 | -0.409 | -10.591 | -0.992 | -3.241 | -1.338 |
| 3.273539545040475 | -0.132 | -0.431 | -10.623 | -0.991 | -3.245 | -1.41 |
| 3.279822730347655 | -0.138 | -0.452 | -10.655 | -0.99 | -3.249 | -1.482 |
| 3.286105915654835 | -0.144 | -0.473 | -10.686 | -0.99 | -3.252 | -1.555 |
| 3.292389100962014 | -0.15 | -0.495 | -10.717 | -0.989 | -3.255 | -1.628 |
| 3.298672286269194 | -0.156 | -0.516 | -10.747 | -0.988 | -3.258 | -1.702 |
| 3.304955471576374 | -0.163 | -0.538 | -10.777 | -0.987 | -3.261 | -1.776 |
| 3.311238656883553 | -0.169 | -0.559 | -10.807 | -0.986 | -3.264 | -1.851 |
| 3.317521842190732 | -0.175 | -0.581 | -10.836 | -0.985 | -3.266 | -1.926 |
| 3.323805027497912 | -0.181 | -0.602 | -10.865 | -0.983 | -3.269 | -2.002 |
| 3.330088212805092 | -0.187 | -0.624 | -10.893 | -0.982 | -3.271 | -2.078 |
| 3.336371398112272 | -0.194 | -0.646 | -10.921 | -0.981 | -3.273 | -2.154 |
| 3.342654583419451 | -0.2 | -0.668 | -10.948 | -0.98 | -3.275 | -2.231 |
| 3.34893776872663 | -0.206 | -0.689 | -10.975 | -0.979 | -3.277 | -2.309 |
| 3.355220954033811 | -0.212 | -0.711 | -11.002 | -0.977 | -3.279 | -2.387 |
| 3.36150413934099 | -0.218 | -0.733 | -11.028 | -0.976 | -3.281 | -2.465 |
| 3.36778732464817 | -0.224 | -0.755 | -11.053 | -0.975 | -3.282 | -2.544 |
| 3.37407050995535 | -0.23 | -0.777 | -11.078 | -0.973 | -3.283 | -2.623 |
| 3.380353695262529 | -0.236 | -0.799 | -11.103 | -0.972 | -3.284 | -2.702 |
| 3.386636880569709 | -0.243 | -0.822 | -11.127 | -0.97 | -3.285 | -2.782 |
| 3.392920065876888 | -0.249 | -0.844 | -11.15 | -0.969 | -3.286 | -2.863 |
| 3.399203251184068 | -0.255 | -0.866 | -11.173 | -0.967 | -3.287 | -2.944 |
| 3.405486436491248 | -0.261 | -0.888 | -11.196 | -0.965 | -3.288 | -3.025 |
| 3.411769621798427 | -0.267 | -0.911 | -11.218 | -0.964 | -3.288 | -3.107 |
| 3.418052807105607 | -0.273 | -0.933 | -11.239 | -0.962 | -3.288 | -3.189 |
| 3.424335992412787 | -0.279 | -0.955 | -11.26 | -0.96 | -3.288 | -3.271 |
| 3.430619177719966 | -0.285 | -0.978 | -11.281 | -0.959 | -3.288 | -3.354 |
| 3.436902363027146 | -0.291 | -1 | -11.301 | -0.957 | -3.288 | -3.438 |
| 3.443185548334325 | -0.297 | -1.023 | -11.32 | -0.955 | -3.288 | -3.522 |
| 3.449468733641505 | -0.303 | -1.045 | -11.339 | -0.953 | -3.287 | -3.606 |
| 3.455751918948685 | -0.309 | -1.068 | -11.358 | -0.951 | -3.287 | -3.69 |
| 3.462035104255865 | -0.315 | -1.09 | -11.376 | -0.949 | -3.286 | -3.775 |
| 3.468318289563044 | -0.321 | -1.113 | -11.393 | -0.947 | -3.285 | -3.861 |
| 3.474601474870224 | -0.327 | -1.136 | -11.41 | -0.945 | -3.284 | -3.946 |
| 3.480884660177403 | -0.333 | -1.159 | -11.426 | -0.943 | -3.282 | -4.033 |
| 3.487167845484583 | -0.339 | -1.181 | -11.441 | -0.941 | -3.281 | -4.119 |
| 3.493451030791763 | -0.345 | -1.204 | -11.456 | -0.939 | -3.279 | -4.206 |
| 3.499734216098942 | -0.351 | -1.227 | -11.471 | -0.937 | -3.278 | -4.293 |
| 3.506017401406122 | -0.356 | -1.25 | -11.485 | -0.934 | -3.276 | -4.381 |
| 3.512300586713302 | -0.362 | -1.272 | -11.498 | -0.932 | -3.274 | -4.469 |
| 3.518583772020481 | -0.368 | -1.295 | -11.511 | -0.93 | -3.271 | -4.558 |
| 3.524866957327661 | -0.374 | -1.318 | -11.523 | -0.927 | -3.269 | -4.646 |
| 3.531150142634841 | -0.38 | -1.341 | -11.535 | -0.925 | -3.267 | -4.735 |
| 3.53743332794202 | -0.386 | -1.364 | -11.546 | -0.923 | -3.264 | -4.825 |
| 3.5437165132492 | -0.391 | -1.387 | -11.556 | -0.92 | -3.261 | -4.915 |
| 3.54999969855638 | -0.397 | -1.41 | -11.566 | -0.918 | -3.258 | -5.005 |
| 3.556282883863559 | -0.403 | -1.433 | -11.575 | -0.915 | -3.255 | -5.096 |
| 3.562566069170739 | -0.409 | -1.456 | -11.584 | -0.913 | -3.252 | -5.187 |
| 3.568849254477918 | -0.414 | -1.479 | -11.592 | -0.91 | -3.248 | -5.278 |
| 3.575132439785098 | -0.42 | -1.502 | -11.599 | -0.907 | -3.244 | -5.369 |
| 3.581415625092278 | -0.426 | -1.525 | -11.606 | -0.905 | -3.241 | -5.461 |
| 3.587698810399457 | -0.431 | -1.548 | -11.612 | -0.902 | -3.237 | -5.554 |
| 3.593981995706637 | -0.437 | -1.571 | -11.617 | -0.899 | -3.232 | -5.646 |
| 3.600265181013817 | -0.443 | -1.594 | -11.622 | -0.897 | -3.228 | -5.739 |
| 3.606548366320996 | -0.448 | -1.617 | -11.626 | -0.894 | -3.224 | -5.832 |
| 3.612831551628176 | -0.454 | -1.64 | -11.63 | -0.891 | -3.219 | -5.926 |
| 3.619114736935355 | -0.46 | -1.663 | -11.633 | -0.888 | -3.214 | -6.02 |
| 3.625397922242535 | -0.465 | -1.686 | -11.635 | -0.885 | -3.209 | -6.114 |
| 3.631681107549715 | -0.471 | -1.709 | -11.637 | -0.882 | -3.204 | -6.208 |
| 3.637964292856894 | -0.476 | -1.733 | -11.638 | -0.879 | -3.199 | -6.303 |
| 3.644247478164074 | -0.482 | -1.756 | -11.638 | -0.876 | -3.193 | -6.398 |
| 3.650530663471254 | -0.487 | -1.779 | -11.637 | -0.873 | -3.188 | -6.493 |
| 3.656813848778433 | -0.493 | -1.802 | -11.636 | -0.87 | -3.182 | -6.589 |
| 3.663097034085613 | -0.498 | -1.825 | -11.635 | -0.867 | -3.176 | -6.685 |
| 3.669380219392792 | -0.504 | -1.848 | -11.632 | -0.864 | -3.17 | -6.781 |
| 3.675663404699972 | -0.509 | -1.871 | -11.629 | -0.861 | -3.164 | -6.877 |
| 3.681946590007152 | -0.514 | -1.894 | -11.625 | -0.858 | -3.157 | -6.974 |
| 3.688229775314331 | -0.52 | -1.917 | -11.621 | -0.854 | -3.151 | -7.071 |
| 3.694512960621511 | -0.525 | -1.94 | -11.616 | -0.851 | -3.144 | -7.168 |
| 3.700796145928691 | -0.531 | -1.963 | -11.61 | -0.848 | -3.137 | -7.266 |
| 3.70707933123587 | -0.536 | -1.986 | -11.603 | -0.844 | -3.13 | -7.364 |
| 3.71336251654305 | -0.541 | -2.009 | -11.596 | -0.841 | -3.123 | -7.462 |
| 3.71964570185023 | -0.546 | -2.032 | -11.588 | -0.838 | -3.115 | -7.56 |
| 3.72592888715741 | -0.552 | -2.055 | -11.579 | -0.834 | -3.108 | -7.658 |
| 3.732212072464589 | -0.557 | -2.078 | -11.57 | -0.831 | -3.1 | -7.757 |
| 3.738495257771769 | -0.562 | -2.101 | -11.56 | -0.827 | -3.092 | -7.856 |
| 3.744778443078948 | -0.567 | -2.124 | -11.549 | -0.824 | -3.084 | -7.955 |
| 3.751061628386128 | -0.572 | -2.147 | -11.537 | -0.82 | -3.076 | -8.054 |
| 3.757344813693308 | -0.578 | -2.17 | -11.525 | -0.816 | -3.067 | -8.154 |
| 3.763627999000487 | -0.583 | -2.193 | -11.512 | -0.813 | -3.059 | -8.254 |
| 3.769911184307667 | -0.588 | -2.216 | -11.498 | -0.809 | -3.05 | -8.354 |
| 3.776194369614846 | -0.593 | -2.239 | -11.483 | -0.805 | -3.041 | -8.454 |
| 3.782477554922026 | -0.598 | -2.262 | -11.468 | -0.802 | -3.032 | -8.554 |
| 3.788760740229206 | -0.603 | -2.284 | -11.452 | -0.798 | -3.023 | -8.655 |
| 3.795043925536385 | -0.608 | -2.307 | -11.435 | -0.794 | -3.013 | -8.756 |
| 3.801327110843565 | -0.613 | -2.33 | -11.418 | -0.79 | -3.004 | -8.857 |
| 3.807610296150745 | -0.618 | -2.353 | -11.4 | -0.786 | -2.994 | -8.958 |
| 3.813893481457924 | -0.623 | -2.375 | -11.38 | -0.782 | -2.984 | -9.059 |
| 3.820176666765104 | -0.628 | -2.398 | -11.361 | -0.778 | -2.974 | -9.16 |
| 3.826459852072284 | -0.633 | -2.421 | -11.34 | -0.775 | -2.964 | -9.262 |
| 3.832743037379463 | -0.637 | -2.443 | -11.319 | -0.771 | -2.953 | -9.364 |
| 3.839026222686643 | -0.642 | -2.466 | -11.297 | -0.766 | -2.943 | -9.466 |
| 3.845309407993823 | -0.647 | -2.488 | -11.274 | -0.762 | -2.932 | -9.568 |
| 3.851592593301002 | -0.652 | -2.511 | -11.25 | -0.758 | -2.921 | -9.67 |
| 3.857875778608182 | -0.657 | -2.533 | -11.226 | -0.754 | -2.91 | -9.772 |
| 3.864158963915361 | -0.661 | -2.555 | -11.2 | -0.75 | -2.899 | -9.875 |
| 3.870442149222541 | -0.666 | -2.578 | -11.174 | -0.746 | -2.887 | -9.977 |
| 3.876725334529721 | -0.671 | -2.6 | -11.148 | -0.742 | -2.876 | -10.08 |
| 3.8830085198369 | -0.675 | -2.622 | -11.12 | -0.738 | -2.864 | -10.183 |
| 3.88929170514408 | -0.68 | -2.645 | -11.092 | -0.733 | -2.852 | -10.285 |
| 3.89557489045126 | -0.685 | -2.667 | -11.062 | -0.729 | -2.84 | -10.388 |
| 3.901858075758439 | -0.689 | -2.689 | -11.032 | -0.725 | -2.827 | -10.491 |
| 3.908141261065619 | -0.694 | -2.711 | -11.002 | -0.72 | -2.815 | -10.595 |
| 3.914424446372799 | -0.698 | -2.733 | -10.97 | -0.716 | -2.802 | -10.698 |
| 3.920707631679978 | -0.703 | -2.755 | -10.938 | -0.712 | -2.79 | -10.801 |
| 3.926990816987158 | -0.707 | -2.777 | -10.904 | -0.707 | -2.777 | -10.904 |
| 3.933274002294337 | -0.712 | -2.799 | -10.87 | -0.703 | -2.764 | -11.008 |
| 3.939557187601517 | -0.716 | -2.82 | -10.836 | -0.698 | -2.75 | -11.111 |
| 3.945840372908697 | -0.72 | -2.842 | -10.8 | -0.694 | -2.737 | -11.215 |
| 3.952123558215876 | -0.725 | -2.864 | -10.763 | -0.689 | -2.723 | -11.319 |
| 3.958406743523056 | -0.729 | -2.886 | -10.726 | -0.685 | -2.71 | -11.422 |
| 3.964689928830236 | -0.733 | -2.907 | -10.688 | -0.68 | -2.696 | -11.526 |
| 3.970973114137415 | -0.738 | -2.929 | -10.649 | -0.675 | -2.682 | -11.63 |
| 3.977256299444595 | -0.742 | -2.95 | -10.609 | -0.671 | -2.667 | -11.733 |
| 3.983539484751775 | -0.746 | -2.971 | -10.569 | -0.666 | -2.653 | -11.837 |
| 3.989822670058954 | -0.75 | -2.993 | -10.527 | -0.661 | -2.639 | -11.941 |
| 3.996105855366134 | -0.754 | -3.014 | -10.485 | -0.657 | -2.624 | -12.045 |
| 4.002389040673314 | -0.758 | -3.035 | -10.442 | -0.652 | -2.609 | -12.148 |
| 4.008672225980493 | -0.762 | -3.056 | -10.398 | -0.647 | -2.594 | -12.252 |
| 4.014955411287672 | -0.766 | -3.077 | -10.353 | -0.642 | -2.579 | -12.356 |
| 4.021238596594851 | -0.771 | -3.098 | -10.307 | -0.637 | -2.563 | -12.459 |
| 4.02752178190203 | -0.775 | -3.119 | -10.261 | -0.633 | -2.548 | -12.563 |
| 4.03380496720921 | -0.778 | -3.14 | -10.214 | -0.628 | -2.532 | -12.667 |
| 4.040088152516389 | -0.782 | -3.161 | -10.165 | -0.623 | -2.516 | -12.77 |
| 4.046371337823567 | -0.786 | -3.182 | -10.116 | -0.618 | -2.5 | -12.874 |
| 4.052654523130747 | -0.79 | -3.202 | -10.066 | -0.613 | -2.484 | -12.978 |
| 4.058937708437926 | -0.794 | -3.223 | -10.016 | -0.608 | -2.468 | -13.081 |
| 4.065220893745105 | -0.798 | -3.243 | -9.964 | -0.603 | -2.451 | -13.184 |
| 4.071504079052285 | -0.802 | -3.264 | -9.912 | -0.598 | -2.434 | -13.288 |
| 4.077787264359464 | -0.805 | -3.284 | -9.858 | -0.593 | -2.418 | -13.391 |
| 4.084070449666643 | -0.809 | -3.304 | -9.804 | -0.588 | -2.401 | -13.494 |
| 4.090353634973822 | -0.813 | -3.324 | -9.749 | -0.583 | -2.383 | -13.597 |
| 4.096636820281001 | -0.816 | -3.344 | -9.693 | -0.578 | -2.366 | -13.7 |
| 4.102920005588181 | -0.82 | -3.364 | -9.636 | -0.572 | -2.349 | -13.803 |
| 4.10920319089536 | -0.824 | -3.384 | -9.579 | -0.567 | -2.331 | -13.906 |
| 4.115486376202539 | -0.827 | -3.404 | -9.52 | -0.562 | -2.313 | -14.008 |
| 4.121769561509718 | -0.831 | -3.424 | -9.461 | -0.557 | -2.295 | -14.111 |
| 4.128052746816897 | -0.834 | -3.443 | -9.4 | -0.552 | -2.277 | -14.213 |
| 4.134335932124077 | -0.838 | -3.463 | -9.339 | -0.546 | -2.259 | -14.316 |
| 4.140619117431256 | -0.841 | -3.482 | -9.277 | -0.541 | -2.241 | -14.418 |
| 4.146902302738435 | -0.844 | -3.501 | -9.215 | -0.536 | -2.222 | -14.52 |
| 4.153185488045614 | -0.848 | -3.521 | -9.151 | -0.531 | -2.203 | -14.622 |
| 4.159468673352793 | -0.851 | -3.54 | -9.086 | -0.525 | -2.184 | -14.723 |
| 4.165751858659973 | -0.854 | -3.559 | -9.021 | -0.52 | -2.165 | -14.825 |
| 4.172035043967152 | -0.858 | -3.578 | -8.954 | -0.514 | -2.146 | -14.926 |
| 4.178318229274331 | -0.861 | -3.596 | -8.887 | -0.509 | -2.127 | -15.027 |
| 4.18460141458151 | -0.864 | -3.615 | -8.819 | -0.504 | -2.107 | -15.128 |
| 4.190884599888689 | -0.867 | -3.634 | -8.75 | -0.498 | -2.088 | -15.229 |
| 4.197167785195868 | -0.87 | -3.652 | -8.68 | -0.493 | -2.068 | -15.329 |
| 4.203450970503048 | -0.873 | -3.671 | -8.609 | -0.487 | -2.048 | -15.43 |
| 4.209734155810227 | -0.876 | -3.689 | -8.538 | -0.482 | -2.028 | -15.53 |
| 4.216017341117406 | -0.879 | -3.707 | -8.465 | -0.476 | -2.008 | -15.63 |
| 4.222300526424585 | -0.882 | -3.725 | -8.392 | -0.471 | -1.987 | -15.729 |
| 4.228583711731764 | -0.885 | -3.743 | -8.317 | -0.465 | -1.967 | -15.829 |
| 4.234866897038944 | -0.888 | -3.761 | -8.242 | -0.46 | -1.946 | -15.928 |
| 4.241150082346122 | -0.891 | -3.779 | -8.166 | -0.454 | -1.925 | -16.027 |
| 4.247433267653302 | -0.894 | -3.797 | -8.089 | -0.448 | -1.904 | -16.126 |
| 4.253716452960481 | -0.897 | -3.814 | -8.011 | -0.443 | -1.883 | -16.224 |
| 4.25999963826766 | -0.899 | -3.831 | -7.933 | -0.437 | -1.862 | -16.322 |
| 4.26628282357484 | -0.902 | -3.849 | -7.853 | -0.431 | -1.841 | -16.42 |
| 4.272566008882019 | -0.905 | -3.866 | -7.773 | -0.426 | -1.819 | -16.517 |
| 4.278849194189198 | -0.907 | -3.883 | -7.691 | -0.42 | -1.797 | -16.615 |
| 4.285132379496377 | -0.91 | -3.9 | -7.609 | -0.414 | -1.776 | -16.712 |
| 4.291415564803557 | -0.913 | -3.917 | -7.526 | -0.409 | -1.754 | -16.808 |
| 4.297698750110735 | -0.915 | -3.933 | -7.442 | -0.403 | -1.732 | -16.905 |
| 4.303981935417915 | -0.918 | -3.95 | -7.357 | -0.397 | -1.709 | -17.001 |
| 4.310265120725094 | -0.92 | -3.966 | -7.271 | -0.391 | -1.687 | -17.096 |
| 4.316548306032273 | -0.923 | -3.983 | -7.184 | -0.386 | -1.664 | -17.192 |
| 4.322831491339452 | -0.925 | -3.999 | -7.097 | -0.38 | -1.642 | -17.287 |
| 4.329114676646632 | -0.927 | -4.015 | -7.008 | -0.374 | -1.619 | -17.381 |
| 4.335397861953811 | -0.93 | -4.031 | -6.919 | -0.368 | -1.596 | -17.476 |
| 4.34168104726099 | -0.932 | -4.047 | -6.829 | -0.362 | -1.573 | -17.57 |
| 4.347964232568169 | -0.934 | -4.062 | -6.738 | -0.356 | -1.55 | -17.663 |
| 4.354247417875348 | -0.937 | -4.078 | -6.646 | -0.351 | -1.526 | -17.756 |
| 4.360530603182528 | -0.939 | -4.093 | -6.553 | -0.345 | -1.503 | -17.849 |
| 4.366813788489707 | -0.941 | -4.109 | -6.459 | -0.339 | -1.479 | -17.942 |
| 4.373096973796886 | -0.943 | -4.124 | -6.365 | -0.333 | -1.455 | -18.034 |
| 4.379380159104065 | -0.945 | -4.139 | -6.269 | -0.327 | -1.432 | -18.125 |
| 4.385663344411244 | -0.947 | -4.154 | -6.173 | -0.321 | -1.408 | -18.217 |
| 4.391946529718424 | -0.949 | -4.168 | -6.076 | -0.315 | -1.383 | -18.307 |
| 4.398229715025602 | -0.951 | -4.183 | -5.978 | -0.309 | -1.359 | -18.398 |
| 4.404512900332782 | -0.953 | -4.197 | -5.879 | -0.303 | -1.335 | -18.488 |
| 4.41079608563996 | -0.955 | -4.212 | -5.779 | -0.297 | -1.31 | -18.577 |
| 4.41707927094714 | -0.957 | -4.226 | -5.678 | -0.291 | -1.286 | -18.666 |
| 4.42336245625432 | -0.959 | -4.24 | -5.577 | -0.285 | -1.261 | -18.755 |
| 4.429645641561499 | -0.96 | -4.254 | -5.474 | -0.279 | -1.236 | -18.843 |
| 4.435928826868678 | -0.962 | -4.267 | -5.371 | -0.273 | -1.211 | -18.93 |
| 4.442212012175857 | -0.964 | -4.281 | -5.267 | -0.267 | -1.186 | -19.017 |
| 4.448495197483036 | -0.965 | -4.294 | -5.162 | -0.261 | -1.16 | -19.104 |
| 4.454778382790215 | -0.967 | -4.308 | -5.056 | -0.255 | -1.135 | -19.19 |
| 4.461061568097395 | -0.969 | -4.321 | -4.949 | -0.249 | -1.109 | -19.276 |
| 4.467344753404574 | -0.97 | -4.334 | -4.842 | -0.243 | -1.084 | -19.361 |
| 4.473627938711753 | -0.972 | -4.347 | -4.733 | -0.236 | -1.058 | -19.446 |
| 4.479911124018932 | -0.973 | -4.359 | -4.624 | -0.23 | -1.032 | -19.53 |
| 4.486194309326112 | -0.975 | -4.372 | -4.514 | -0.224 | -1.006 | -19.613 |
| 4.49247749463329 | -0.976 | -4.384 | -4.403 | -0.218 | -0.98 | -19.696 |
| 4.49876067994047 | -0.977 | -4.396 | -4.291 | -0.212 | -0.954 | -19.779 |
| 4.50504386524765 | -0.979 | -4.409 | -4.178 | -0.206 | -0.927 | -19.861 |
| 4.511327050554828 | -0.98 | -4.42 | -4.065 | -0.2 | -0.901 | -19.942 |
| 4.517610235862008 | -0.981 | -4.432 | -3.95 | -0.194 | -0.874 | -20.023 |
| 4.523893421169186 | -0.982 | -4.444 | -3.835 | -0.187 | -0.848 | -20.103 |
| 4.530176606476366 | -0.983 | -4.455 | -3.719 | -0.181 | -0.821 | -20.183 |
| 4.536459791783545 | -0.985 | -4.466 | -3.602 | -0.175 | -0.794 | -20.262 |
| 4.542742977090724 | -0.986 | -4.478 | -3.484 | -0.169 | -0.767 | -20.34 |
| 4.549026162397904 | -0.987 | -4.488 | -3.366 | -0.163 | -0.74 | -20.418 |
| 4.555309347705083 | -0.988 | -4.499 | -3.246 | -0.156 | -0.713 | -20.495 |
| 4.561592533012262 | -0.989 | -4.51 | -3.126 | -0.15 | -0.685 | -20.572 |
| 4.567875718319441 | -0.99 | -4.52 | -3.005 | -0.144 | -0.658 | -20.648 |
| 4.57415890362662 | -0.99 | -4.531 | -2.883 | -0.138 | -0.63 | -20.723 |
| 4.5804420889338 | -0.991 | -4.541 | -2.76 | -0.132 | -0.603 | -20.798 |
| 4.586725274240979 | -0.992 | -4.551 | -2.637 | -0.125 | -0.575 | -20.872 |
| 4.593008459548158 | -0.993 | -4.56 | -2.512 | -0.119 | -0.547 | -20.946 |
| 4.599291644855337 | -0.994 | -4.57 | -2.387 | -0.113 | -0.519 | -21.018 |
| 4.605574830162516 | -0.994 | -4.579 | -2.261 | -0.107 | -0.491 | -21.09 |
| 4.611858015469695 | -0.995 | -4.589 | -2.135 | -0.1 | -0.463 | -21.162 |
| 4.618141200776875 | -0.996 | -4.598 | -2.007 | -0.094 | -0.435 | -21.233 |
| 4.624424386084054 | -0.996 | -4.607 | -1.879 | -0.088 | -0.406 | -21.303 |
| 4.630707571391233 | -0.997 | -4.615 | -1.75 | -0.082 | -0.378 | -21.372 |
| 4.636990756698412 | -0.997 | -4.624 | -1.62 | -0.075 | -0.349 | -21.441 |
| 4.643273942005591 | -0.998 | -4.632 | -1.489 | -0.069 | -0.321 | -21.509 |
| 4.649557127312771 | -0.998 | -4.64 | -1.357 | -0.063 | -0.292 | -21.576 |
| 4.65584031261995 | -0.998 | -4.648 | -1.225 | -0.057 | -0.263 | -21.642 |
| 4.66212349792713 | -0.999 | -4.656 | -1.092 | -0.05 | -0.234 | -21.708 |
| 4.668406683234308 | -0.999 | -4.664 | -0.958 | -0.044 | -0.205 | -21.773 |
| 4.674689868541487 | -0.999 | -4.671 | -0.824 | -0.038 | -0.176 | -21.837 |
| 4.680973053848666 | -1 | -4.679 | -0.688 | -0.031 | -0.147 | -21.901 |
| 4.687256239155846 | -1 | -4.686 | -0.552 | -0.025 | -0.118 | -21.963 |
| 4.693539424463024 | -1 | -4.693 | -0.415 | -0.019 | -0.088 | -22.025 |
| 4.699822609770204 | -1 | -4.699 | -0.278 | -0.013 | -0.059 | -22.087 |
| 4.706105795077383 | -1 | -4.706 | -0.139 | -0.006 | -0.03 | -22.147 |
| 4.712388980384562 | -1 | -4.712 | 0 | 0 | 0 | -22.207 |
| 4.718672165691741 | -1 | -4.719 | 0.14 | 0.006 | 0.03 | -22.265 |
| 4.724955350998921 | -1 | -4.725 | 0.281 | 0.013 | 0.059 | -22.323 |
| 4.7312385363061 | -1 | -4.73 | 0.422 | 0.019 | 0.089 | -22.381 |
| 4.73752172161328 | -1 | -4.736 | 0.564 | 0.025 | 0.119 | -22.437 |
| 4.743804906920459 | -1 | -4.741 | 0.707 | 0.031 | 0.149 | -22.493 |
| 4.750088092227637 | -0.999 | -4.747 | 0.85 | 0.038 | 0.179 | -22.547 |
| 4.756371277534817 | -0.999 | -4.752 | 0.995 | 0.044 | 0.209 | -22.601 |
| 4.762654462841996 | -0.999 | -4.757 | 1.14 | 0.05 | 0.239 | -22.654 |
| 4.768937648149175 | -0.998 | -4.761 | 1.285 | 0.057 | 0.27 | -22.706 |
| 4.775220833456354 | -0.998 | -4.766 | 1.432 | 0.063 | 0.3 | -22.758 |
| 4.781504018763534 | -0.998 | -4.77 | 1.579 | 0.069 | 0.33 | -22.808 |
| 4.787787204070713 | -0.997 | -4.774 | 1.727 | 0.075 | 0.361 | -22.858 |
| 4.794070389377892 | -0.997 | -4.778 | 1.875 | 0.082 | 0.391 | -22.906 |
| 4.800353574685071 | -0.996 | -4.782 | 2.024 | 0.088 | 0.422 | -22.954 |
| 4.806636759992251 | -0.996 | -4.785 | 2.174 | 0.094 | 0.452 | -23.001 |
| 4.81291994529943 | -0.995 | -4.789 | 2.325 | 0.1 | 0.483 | -23.047 |
| 4.819203130606608 | -0.994 | -4.792 | 2.476 | 0.107 | 0.514 | -23.092 |
| 4.825486315913788 | -0.994 | -4.795 | 2.628 | 0.113 | 0.545 | -23.137 |
| 4.831769501220967 | -0.993 | -4.797 | 2.78 | 0.119 | 0.575 | -23.18 |
| 4.838052686528146 | -0.992 | -4.8 | 2.934 | 0.125 | 0.606 | -23.222 |
| 4.844335871835326 | -0.991 | -4.802 | 3.087 | 0.132 | 0.637 | -23.264 |
| 4.850619057142505 | -0.99 | -4.804 | 3.242 | 0.138 | 0.668 | -23.304 |
| 4.856902242449684 | -0.99 | -4.806 | 3.397 | 0.144 | 0.699 | -23.344 |
| 4.863185427756863 | -0.989 | -4.808 | 3.553 | 0.15 | 0.731 | -23.382 |
| 4.869468613064042 | -0.988 | -4.81 | 3.709 | 0.156 | 0.762 | -23.42 |
| 4.875751798371221 | -0.987 | -4.811 | 3.866 | 0.163 | 0.793 | -23.456 |
| 4.882034983678401 | -0.986 | -4.812 | 4.024 | 0.169 | 0.824 | -23.492 |
| 4.88831816898558 | -0.985 | -4.813 | 4.182 | 0.175 | 0.856 | -23.527 |
| 4.894601354292759 | -0.983 | -4.814 | 4.341 | 0.181 | 0.887 | -23.561 |
| 4.900884539599939 | -0.982 | -4.814 | 4.501 | 0.187 | 0.918 | -23.593 |
| 4.907167724907117 | -0.981 | -4.814 | 4.661 | 0.194 | 0.95 | -23.625 |
| 4.913450910214297 | -0.98 | -4.814 | 4.821 | 0.2 | 0.981 | -23.656 |
| 4.919734095521476 | -0.979 | -4.814 | 4.983 | 0.206 | 1.013 | -23.685 |
| 4.926017280828655 | -0.977 | -4.814 | 5.144 | 0.212 | 1.044 | -23.714 |
| 4.932300466135834 | -0.976 | -4.814 | 5.307 | 0.218 | 1.076 | -23.742 |
| 4.938583651443014 | -0.975 | -4.813 | 5.47 | 0.224 | 1.108 | -23.768 |
| 4.944866836750193 | -0.973 | -4.812 | 5.633 | 0.23 | 1.139 | -23.794 |
| 4.951150022057372 | -0.972 | -4.811 | 5.798 | 0.236 | 1.171 | -23.818 |
| 4.957433207364551 | -0.97 | -4.809 | 5.962 | 0.243 | 1.203 | -23.842 |
| 4.96371639267173 | -0.969 | -4.808 | 6.127 | 0.249 | 1.234 | -23.864 |
| 4.96999957797891 | -0.967 | -4.806 | 6.293 | 0.255 | 1.266 | -23.886 |
| 4.976282763286088 | -0.965 | -4.804 | 6.459 | 0.261 | 1.298 | -23.906 |
| 4.982565948593268 | -0.964 | -4.802 | 6.626 | 0.267 | 1.33 | -23.925 |
| 4.988849133900447 | -0.962 | -4.799 | 6.793 | 0.273 | 1.362 | -23.944 |
| 4.995132319207626 | -0.96 | -4.797 | 6.961 | 0.279 | 1.394 | -23.961 |
| 5.001415504514805 | -0.959 | -4.794 | 7.13 | 0.285 | 1.425 | -23.977 |
| 5.007698689821984 | -0.957 | -4.791 | 7.298 | 0.291 | 1.457 | -23.992 |
| 5.013981875129164 | -0.955 | -4.788 | 7.468 | 0.297 | 1.489 | -24.005 |
| 5.020265060436343 | -0.953 | -4.784 | 7.637 | 0.303 | 1.521 | -24.018 |
| 5.026548245743522 | -0.951 | -4.781 | 7.808 | 0.309 | 1.553 | -24.03 |
| 5.032831431050702 | -0.949 | -4.777 | 7.978 | 0.315 | 1.585 | -24.04 |
| 5.039114616357881 | -0.947 | -4.773 | 8.15 | 0.321 | 1.617 | -24.049 |
| 5.04539780166506 | -0.945 | -4.768 | 8.321 | 0.327 | 1.649 | -24.058 |
| 5.05168098697224 | -0.943 | -4.764 | 8.493 | 0.333 | 1.681 | -24.065 |
| 5.057964172279418 | -0.941 | -4.759 | 8.666 | 0.339 | 1.713 | -24.071 |
| 5.064247357586598 | -0.939 | -4.754 | 8.839 | 0.345 | 1.745 | -24.075 |
| 5.070530542893777 | -0.937 | -4.749 | 9.012 | 0.351 | 1.777 | -24.079 |
| 5.076813728200956 | -0.934 | -4.743 | 9.186 | 0.356 | 1.809 | -24.081 |
| 5.083096913508135 | -0.932 | -4.738 | 9.36 | 0.362 | 1.841 | -24.083 |
| 5.089380098815314 | -0.93 | -4.732 | 9.535 | 0.368 | 1.874 | -24.083 |
| 5.095663284122493 | -0.927 | -4.726 | 9.71 | 0.374 | 1.906 | -24.082 |
| 5.101946469429673 | -0.925 | -4.72 | 9.886 | 0.38 | 1.938 | -24.08 |
| 5.108229654736852 | -0.923 | -4.713 | 10.061 | 0.386 | 1.97 | -24.076 |
| 5.114512840044031 | -0.92 | -4.707 | 10.238 | 0.391 | 2.002 | -24.072 |
| 5.12079602535121 | -0.918 | -4.7 | 10.414 | 0.397 | 2.034 | -24.066 |
| 5.12707921065839 | -0.915 | -4.693 | 10.591 | 0.403 | 2.066 | -24.059 |
| 5.133362395965568 | -0.913 | -4.685 | 10.768 | 0.409 | 2.098 | -24.051 |
| 5.139645581272747 | -0.91 | -4.678 | 10.946 | 0.414 | 2.13 | -24.041 |
| 5.145928766579927 | -0.907 | -4.67 | 11.124 | 0.42 | 2.162 | -24.031 |
| 5.152211951887106 | -0.905 | -4.662 | 11.302 | 0.426 | 2.194 | -24.019 |
| 5.158495137194286 | -0.902 | -4.654 | 11.481 | 0.431 | 2.226 | -24.006 |
| 5.164778322501465 | -0.899 | -4.645 | 11.66 | 0.437 | 2.258 | -23.992 |
| 5.171061507808644 | -0.897 | -4.637 | 11.839 | 0.443 | 2.29 | -23.976 |
| 5.177344693115823 | -0.894 | -4.628 | 12.019 | 0.448 | 2.321 | -23.959 |
| 5.183627878423002 | -0.891 | -4.619 | 12.199 | 0.454 | 2.353 | -23.941 |
| 5.189911063730181 | -0.888 | -4.609 | 12.379 | 0.46 | 2.385 | -23.922 |
| 5.196194249037361 | -0.885 | -4.6 | 12.559 | 0.465 | 2.417 | -23.902 |
| 5.20247743434454 | -0.882 | -4.59 | 12.74 | 0.471 | 2.449 | -23.88 |
| 5.20876061965172 | -0.879 | -4.58 | 12.921 | 0.476 | 2.481 | -23.857 |
| 5.215043804958898 | -0.876 | -4.57 | 13.102 | 0.482 | 2.512 | -23.833 |
| 5.221326990266077 | -0.873 | -4.56 | 13.284 | 0.487 | 2.544 | -23.807 |
| 5.227610175573257 | -0.87 | -4.549 | 13.465 | 0.493 | 2.576 | -23.78 |
| 5.233893360880435 | -0.867 | -4.538 | 13.647 | 0.498 | 2.607 | -23.752 |
| 5.240176546187615 | -0.864 | -4.527 | 13.829 | 0.504 | 2.639 | -23.723 |
| 5.246459731494794 | -0.861 | -4.516 | 14.012 | 0.509 | 2.671 | -23.692 |
| 5.252742916801973 | -0.858 | -4.504 | 14.194 | 0.514 | 2.702 | -23.66 |
| 5.259026102109152 | -0.854 | -4.493 | 14.377 | 0.52 | 2.734 | -23.627 |
| 5.265309287416332 | -0.851 | -4.481 | 14.56 | 0.525 | 2.765 | -23.593 |
| 5.27159247272351 | -0.848 | -4.469 | 14.743 | 0.531 | 2.797 | -23.557 |
| 5.27787565803069 | -0.844 | -4.456 | 14.926 | 0.536 | 2.828 | -23.52 |
| 5.284158843337869 | -0.841 | -4.444 | 15.109 | 0.541 | 2.859 | -23.481 |
| 5.290442028645049 | -0.838 | -4.431 | 15.293 | 0.546 | 2.891 | -23.441 |
| 5.296725213952227 | -0.834 | -4.418 | 15.477 | 0.552 | 2.922 | -23.4 |
| 5.303008399259407 | -0.831 | -4.405 | 15.66 | 0.557 | 2.953 | -23.358 |
| 5.309291584566586 | -0.827 | -4.391 | 15.844 | 0.562 | 2.984 | -23.314 |
| 5.315574769873765 | -0.824 | -4.378 | 16.028 | 0.567 | 3.015 | -23.269 |
| 5.321857955180945 | -0.82 | -4.364 | 16.213 | 0.572 | 3.046 | -23.223 |
| 5.328141140488124 | -0.816 | -4.35 | 16.397 | 0.578 | 3.077 | -23.175 |
| 5.334424325795303 | -0.813 | -4.335 | 16.581 | 0.583 | 3.108 | -23.126 |
| 5.340707511102482 | -0.809 | -4.321 | 16.765 | 0.588 | 3.139 | -23.076 |
| 5.346990696409661 | -0.805 | -4.306 | 16.95 | 0.593 | 3.17 | -23.024 |
| 5.35327388171684 | -0.802 | -4.291 | 17.134 | 0.598 | 3.201 | -22.971 |
| 5.35955706702402 | -0.798 | -4.276 | 17.319 | 0.603 | 3.231 | -22.917 |
| 5.365840252331199 | -0.794 | -4.26 | 17.504 | 0.608 | 3.262 | -22.861 |
| 5.372123437638378 | -0.79 | -4.245 | 17.688 | 0.613 | 3.293 | -22.804 |
| 5.378406622945557 | -0.786 | -4.229 | 17.873 | 0.618 | 3.323 | -22.745 |
| 5.384689808252737 | -0.782 | -4.213 | 18.058 | 0.623 | 3.354 | -22.685 |
| 5.390972993559916 | -0.778 | -4.197 | 18.242 | 0.628 | 3.384 | -22.624 |
| 5.397256178867095 | -0.775 | -4.18 | 18.427 | 0.633 | 3.414 | -22.562 |
| 5.403539364174274 | -0.771 | -4.163 | 18.612 | 0.637 | 3.444 | -22.498 |
| 5.409822549481453 | -0.766 | -4.147 | 18.796 | 0.642 | 3.474 | -22.432 |
| 5.416105734788632 | -0.762 | -4.129 | 18.981 | 0.647 | 3.505 | -22.366 |
| 5.422388920095812 | -0.758 | -4.112 | 19.165 | 0.652 | 3.534 | -22.298 |
| 5.42867210540299 | -0.754 | -4.095 | 19.35 | 0.657 | 3.564 | -22.228 |
| 5.43495529071017 | -0.75 | -4.077 | 19.534 | 0.661 | 3.594 | -22.157 |
| 5.44123847601735 | -0.746 | -4.059 | 19.719 | 0.666 | 3.624 | -22.085 |
| 5.447521661324528 | -0.742 | -4.041 | 19.903 | 0.671 | 3.654 | -22.012 |
| 5.453804846631708 | -0.738 | -4.022 | 20.087 | 0.675 | 3.683 | -21.937 |
| 5.460088031938887 | -0.733 | -4.004 | 20.271 | 0.68 | 3.713 | -21.86 |
| 5.466371217246066 | -0.729 | -3.985 | 20.455 | 0.685 | 3.742 | -21.782 |
| 5.472654402553245 | -0.725 | -3.966 | 20.639 | 0.689 | 3.771 | -21.703 |
| 5.478937587860424 | -0.72 | -3.947 | 20.823 | 0.694 | 3.8 | -21.623 |
| 5.485220773167603 | -0.716 | -3.927 | 21.006 | 0.698 | 3.83 | -21.541 |
| 5.491503958474783 | -0.712 | -3.907 | 21.19 | 0.703 | 3.859 | -21.458 |
| 5.497787143781962 | -0.707 | -3.888 | 21.373 | 0.707 | 3.888 | -21.373 |
| 5.504070329089141 | -0.703 | -3.867 | 21.556 | 0.712 | 3.916 | -21.287 |
| 5.51035351439632 | -0.698 | -3.847 | 21.739 | 0.716 | 3.945 | -21.199 |
| 5.5166366997035 | -0.694 | -3.827 | 21.921 | 0.72 | 3.974 | -21.11 |
| 5.522919885010679 | -0.689 | -3.806 | 22.104 | 0.725 | 4.002 | -21.02 |
| 5.529203070317858 | -0.685 | -3.785 | 22.286 | 0.729 | 4.031 | -20.928 |
| 5.535486255625037 | -0.68 | -3.764 | 22.468 | 0.733 | 4.059 | -20.835 |
| 5.541769440932216 | -0.675 | -3.743 | 22.65 | 0.738 | 4.087 | -20.74 |
| 5.548052626239396 | -0.671 | -3.721 | 22.831 | 0.742 | 4.115 | -20.644 |
| 5.554335811546575 | -0.666 | -3.699 | 23.013 | 0.746 | 4.143 | -20.547 |
| 5.560618996853754 | -0.661 | -3.677 | 23.194 | 0.75 | 4.171 | -20.448 |
| 5.566902182160933 | -0.657 | -3.655 | 23.375 | 0.754 | 4.199 | -20.348 |
| 5.573185367468112 | -0.652 | -3.633 | 23.555 | 0.758 | 4.226 | -20.246 |
| 5.579468552775292 | -0.647 | -3.61 | 23.735 | 0.762 | 4.254 | -20.143 |
| 5.585751738082471 | -0.642 | -3.587 | 23.915 | 0.766 | 4.281 | -20.039 |
| 5.59203492338965 | -0.637 | -3.564 | 24.095 | 0.771 | 4.309 | -19.933 |
| 5.59831810869683 | -0.633 | -3.541 | 24.274 | 0.775 | 4.336 | -19.825 |
| 5.604601294004008 | -0.628 | -3.518 | 24.453 | 0.778 | 4.363 | -19.717 |
| 5.610884479311188 | -0.623 | -3.494 | 24.631 | 0.782 | 4.39 | -19.607 |
| 5.617167664618367 | -0.618 | -3.471 | 24.809 | 0.786 | 4.417 | -19.495 |
| 5.623450849925546 | -0.613 | -3.447 | 24.987 | 0.79 | 4.443 | -19.382 |
| 5.629734035232725 | -0.608 | -3.422 | 25.165 | 0.794 | 4.47 | -19.268 |
| 5.636017220539904 | -0.603 | -3.398 | 25.342 | 0.798 | 4.496 | -19.152 |
| 5.642300405847083 | -0.598 | -3.374 | 25.518 | 0.802 | 4.523 | -19.035 |
| 5.648583591154263 | -0.593 | -3.349 | 25.695 | 0.805 | 4.549 | -18.916 |
| 5.654866776461442 | -0.588 | -3.324 | 25.87 | 0.809 | 4.575 | -18.796 |
| 5.661149961768621 | -0.583 | -3.299 | 26.046 | 0.813 | 4.601 | -18.674 |
| 5.6674331470758 | -0.578 | -3.273 | 26.221 | 0.816 | 4.627 | -18.552 |
| 5.673716332382979 | -0.572 | -3.248 | 26.395 | 0.82 | 4.652 | -18.427 |
| 5.679999517690159 | -0.567 | -3.222 | 26.569 | 0.824 | 4.678 | -18.301 |
| 5.686282702997337 | -0.562 | -3.196 | 26.743 | 0.827 | 4.703 | -18.174 |
| 5.692565888304517 | -0.557 | -3.17 | 26.916 | 0.831 | 4.728 | -18.046 |
| 5.698849073611696 | -0.552 | -3.144 | 27.088 | 0.834 | 4.753 | -17.916 |
| 5.705132258918875 | -0.546 | -3.117 | 27.26 | 0.838 | 4.778 | -17.784 |
| 5.711415444226055 | -0.541 | -3.091 | 27.432 | 0.841 | 4.803 | -17.652 |
| 5.717698629533234 | -0.536 | -3.064 | 27.603 | 0.844 | 4.828 | -17.517 |
| 5.723981814840413 | -0.531 | -3.037 | 27.773 | 0.848 | 4.852 | -17.382 |
| 5.730265000147592 | -0.525 | -3.009 | 27.943 | 0.851 | 4.876 | -17.245 |
| 5.73654818545477 | -0.52 | -2.982 | 28.113 | 0.854 | 4.901 | -17.106 |
| 5.742831370761951 | -0.514 | -2.954 | 28.281 | 0.858 | 4.925 | -16.966 |
| 5.74911455606913 | -0.509 | -2.927 | 28.45 | 0.861 | 4.949 | -16.825 |
| 5.75539774137631 | -0.504 | -2.899 | 28.617 | 0.864 | 4.972 | -16.682 |
| 5.761680926683488 | -0.498 | -2.87 | 28.784 | 0.867 | 4.996 | -16.538 |
| 5.767964111990667 | -0.493 | -2.842 | 28.951 | 0.87 | 5.019 | -16.393 |
| 5.774247297297846 | -0.487 | -2.814 | 29.116 | 0.873 | 5.042 | -16.246 |
| 5.780530482605025 | -0.482 | -2.785 | 29.281 | 0.876 | 5.066 | -16.098 |
| 5.786813667912205 | -0.476 | -2.756 | 29.446 | 0.879 | 5.088 | -15.948 |
| 5.793096853219384 | -0.471 | -2.727 | 29.61 | 0.882 | 5.111 | -15.797 |
| 5.799380038526563 | -0.465 | -2.698 | 29.773 | 0.885 | 5.134 | -15.644 |
| 5.805663223833742 | -0.46 | -2.668 | 29.935 | 0.888 | 5.156 | -15.49 |
| 5.811946409140922 | -0.454 | -2.639 | 30.097 | 0.891 | 5.178 | -15.335 |
| 5.8182295944481 | -0.448 | -2.609 | 30.258 | 0.894 | 5.201 | -15.179 |
| 5.82451277975528 | -0.443 | -2.579 | 30.419 | 0.897 | 5.222 | -15.021 |
| 5.830795965062459 | -0.437 | -2.549 | 30.578 | 0.899 | 5.244 | -14.861 |
| 5.837079150369638 | -0.431 | -2.518 | 30.737 | 0.902 | 5.266 | -14.7 |
| 5.843362335676817 | -0.426 | -2.488 | 30.895 | 0.905 | 5.287 | -14.538 |
| 5.849645520983997 | -0.42 | -2.457 | 31.053 | 0.907 | 5.308 | -14.375 |
| 5.855928706291176 | -0.414 | -2.427 | 31.209 | 0.91 | 5.33 | -14.21 |
| 5.862211891598355 | -0.409 | -2.396 | 31.365 | 0.913 | 5.35 | -14.043 |
| 5.868495076905535 | -0.403 | -2.364 | 31.52 | 0.915 | 5.371 | -13.876 |
| 5.874778262212714 | -0.397 | -2.333 | 31.674 | 0.918 | 5.392 | -13.707 |
| 5.881061447519893 | -0.391 | -2.302 | 31.828 | 0.92 | 5.412 | -13.536 |
| 5.887344632827072 | -0.386 | -2.27 | 31.981 | 0.923 | 5.432 | -13.365 |
| 5.893627818134251 | -0.38 | -2.238 | 32.132 | 0.925 | 5.452 | -13.192 |
| 5.899911003441431 | -0.374 | -2.206 | 32.283 | 0.927 | 5.472 | -13.017 |
| 5.90619418874861 | -0.368 | -2.174 | 32.434 | 0.93 | 5.491 | -12.841 |
| 5.912477374055789 | -0.362 | -2.142 | 32.583 | 0.932 | 5.511 | -12.664 |
| 5.918760559362968 | -0.356 | -2.11 | 32.731 | 0.934 | 5.53 | -12.486 |
| 5.925043744670147 | -0.351 | -2.077 | 32.879 | 0.937 | 5.549 | -12.306 |
| 5.931326929977326 | -0.345 | -2.044 | 33.025 | 0.939 | 5.568 | -12.125 |
| 5.937610115284505 | -0.339 | -2.011 | 33.171 | 0.941 | 5.587 | -11.942 |
| 5.943893300591684 | -0.333 | -1.978 | 33.316 | 0.943 | 5.605 | -11.758 |
| 5.950176485898864 | -0.327 | -1.945 | 33.46 | 0.945 | 5.623 | -11.573 |
| 5.956459671206043 | -0.321 | -1.912 | 33.602 | 0.947 | 5.641 | -11.387 |
| 5.962742856513223 | -0.315 | -1.878 | 33.744 | 0.949 | 5.659 | -11.199 |
| 5.969026041820402 | -0.309 | -1.845 | 33.885 | 0.951 | 5.677 | -11.01 |
| 5.975309227127581 | -0.303 | -1.811 | 34.025 | 0.953 | 5.694 | -10.82 |
| 5.98159241243476 | -0.297 | -1.777 | 34.165 | 0.955 | 5.712 | -10.628 |
| 5.987875597741939 | -0.291 | -1.743 | 34.303 | 0.957 | 5.729 | -10.435 |
| 5.994158783049118 | -0.285 | -1.708 | 34.44 | 0.959 | 5.746 | -10.241 |
| 6.000441968356298 | -0.279 | -1.674 | 34.576 | 0.96 | 5.762 | -10.045 |
| 6.006725153663476 | -0.273 | -1.64 | 34.711 | 0.962 | 5.779 | -9.848 |
| 6.013008338970656 | -0.267 | -1.605 | 34.845 | 0.964 | 5.795 | -9.65 |
| 6.019291524277835 | -0.261 | -1.57 | 34.978 | 0.965 | 5.811 | -9.451 |
| 6.025574709585015 | -0.255 | -1.535 | 35.109 | 0.967 | 5.827 | -9.25 |
| 6.031857894892193 | -0.249 | -1.5 | 35.24 | 0.969 | 5.842 | -9.048 |
| 6.038141080199372 | -0.243 | -1.465 | 35.37 | 0.97 | 5.858 | -8.845 |
| 6.044424265506552 | -0.236 | -1.43 | 35.499 | 0.972 | 5.873 | -8.641 |
| 6.050707450813731 | -0.23 | -1.394 | 35.626 | 0.973 | 5.888 | -8.435 |
| 6.05699063612091 | -0.224 | -1.358 | 35.753 | 0.975 | 5.903 | -8.228 |
| 6.06327382142809 | -0.218 | -1.323 | 35.878 | 0.976 | 5.917 | -8.02 |
| 6.069557006735269 | -0.212 | -1.287 | 36.002 | 0.977 | 5.932 | -7.81 |
| 6.075840192042448 | -0.206 | -1.251 | 36.125 | 0.979 | 5.946 | -7.6 |
| 6.082123377349627 | -0.2 | -1.215 | 36.247 | 0.98 | 5.96 | -7.388 |
| 6.088406562656806 | -0.194 | -1.178 | 36.368 | 0.981 | 5.973 | -7.175 |
| 6.094689747963986 | -0.187 | -1.142 | 36.487 | 0.982 | 5.987 | -6.96 |
| 6.100972933271164 | -0.181 | -1.106 | 36.606 | 0.983 | 6 | -6.745 |
| 6.107256118578344 | -0.175 | -1.069 | 36.723 | 0.985 | 6.013 | -6.528 |
| 6.113539303885523 | -0.169 | -1.032 | 36.839 | 0.986 | 6.026 | -6.31 |
| 6.119822489192702 | -0.163 | -0.995 | 36.954 | 0.987 | 6.038 | -6.091 |
| 6.126105674499882 | -0.156 | -0.958 | 37.067 | 0.988 | 6.051 | -5.871 |
| 6.132388859807061 | -0.15 | -0.921 | 37.179 | 0.989 | 6.063 | -5.649 |
| 6.13867204511424 | -0.144 | -0.884 | 37.29 | 0.99 | 6.075 | -5.427 |
| 6.144955230421419 | -0.138 | -0.847 | 37.4 | 0.99 | 6.086 | -5.203 |
| 6.151238415728598 | -0.132 | -0.809 | 37.509 | 0.991 | 6.098 | -4.978 |
| 6.157521601035778 | -0.125 | -0.772 | 37.616 | 0.992 | 6.109 | -4.752 |
| 6.163804786342957 | -0.119 | -0.734 | 37.722 | 0.993 | 6.12 | -4.525 |
| 6.170087971650136 | -0.113 | -0.696 | 37.827 | 0.994 | 6.131 | -4.296 |
| 6.176371156957315 | -0.107 | -0.658 | 37.93 | 0.994 | 6.141 | -4.067 |
| 6.182654342264494 | -0.1 | -0.621 | 38.032 | 0.995 | 6.151 | -3.836 |
| 6.188937527571674 | -0.094 | -0.582 | 38.133 | 0.996 | 6.161 | -3.605 |
| 6.195220712878853 | -0.088 | -0.544 | 38.232 | 0.996 | 6.171 | -3.372 |
| 6.201503898186032 | -0.082 | -0.506 | 38.33 | 0.997 | 6.181 | -3.138 |
| 6.207787083493211 | -0.075 | -0.468 | 38.427 | 0.997 | 6.19 | -2.903 |
| 6.21407026880039 | -0.069 | -0.429 | 38.522 | 0.998 | 6.199 | -2.667 |
| 6.22035345410757 | -0.063 | -0.391 | 38.616 | 0.998 | 6.208 | -2.43 |
| 6.226636639414749 | -0.057 | -0.352 | 38.709 | 0.998 | 6.217 | -2.191 |
| 6.232919824721928 | -0.05 | -0.313 | 38.8 | 0.999 | 6.225 | -1.952 |
| 6.239203010029107 | -0.044 | -0.274 | 38.89 | 0.999 | 6.233 | -1.712 |
| 6.245486195336286 | -0.038 | -0.235 | 38.978 | 0.999 | 6.241 | -1.47 |
| 6.251769380643465 | -0.031 | -0.196 | 39.065 | 1 | 6.249 | -1.228 |
| 6.258052565950644 | -0.025 | -0.157 | 39.151 | 1 | 6.256 | -0.984 |
| 6.264335751257824 | -0.019 | -0.118 | 39.235 | 1 | 6.263 | -0.74 |
| 6.270618936565003 | -0.013 | -0.079 | 39.318 | 1 | 6.27 | -0.494 |
| 6.276902121872182 | -0.006 | -0.039 | 39.399 | 1 | 6.277 | -0.248 |
| 6.283185307179361 | 0 | 0 | 39.478 | 1 | 6.283 | 0 |